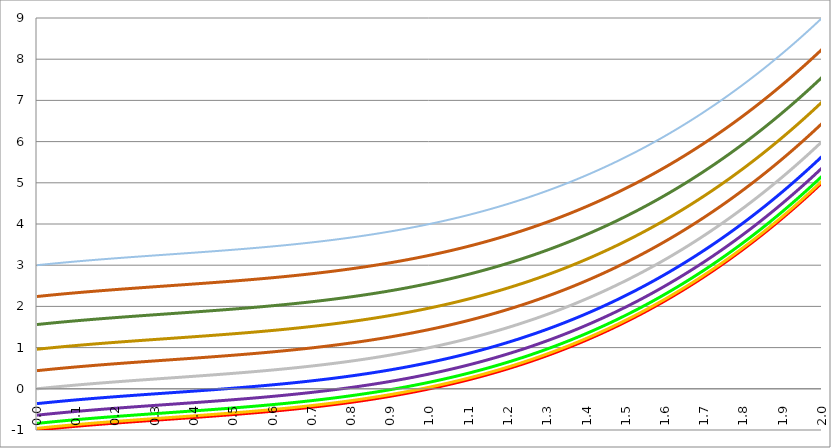
| Category | Series 1 | Series 0 | Series 3 | Series 4 | Series 5 | Series 2 | Series 6 | Series 7 | Series 8 | Series 9 | Series 10 |
|---|---|---|---|---|---|---|---|---|---|---|---|
| 0.0 | -1 | -0.96 | -0.84 | -0.64 | -0.36 | 0 | 0.44 | 0.96 | 1.56 | 2.24 | 3 |
| 0.001 | -0.999 | -0.959 | -0.839 | -0.639 | -0.359 | 0.001 | 0.441 | 0.961 | 1.561 | 2.241 | 3.001 |
| 0.002 | -0.998 | -0.958 | -0.838 | -0.638 | -0.358 | 0.002 | 0.442 | 0.962 | 1.562 | 2.242 | 3.002 |
| 0.003 | -0.997 | -0.957 | -0.837 | -0.637 | -0.357 | 0.003 | 0.443 | 0.963 | 1.563 | 2.243 | 3.003 |
| 0.004 | -0.996 | -0.956 | -0.836 | -0.636 | -0.356 | 0.004 | 0.444 | 0.964 | 1.564 | 2.244 | 3.004 |
| 0.005 | -0.995 | -0.955 | -0.835 | -0.635 | -0.355 | 0.005 | 0.445 | 0.965 | 1.565 | 2.245 | 3.005 |
| 0.006 | -0.994 | -0.954 | -0.834 | -0.634 | -0.354 | 0.006 | 0.446 | 0.966 | 1.566 | 2.246 | 3.006 |
| 0.007 | -0.993 | -0.953 | -0.833 | -0.633 | -0.353 | 0.007 | 0.447 | 0.967 | 1.567 | 2.247 | 3.007 |
| 0.008 | -0.992 | -0.952 | -0.832 | -0.632 | -0.352 | 0.008 | 0.448 | 0.968 | 1.568 | 2.248 | 3.008 |
| 0.009 | -0.991 | -0.951 | -0.831 | -0.631 | -0.351 | 0.009 | 0.449 | 0.969 | 1.569 | 2.249 | 3.009 |
| 0.01 | -0.99 | -0.95 | -0.83 | -0.63 | -0.35 | 0.01 | 0.45 | 0.97 | 1.57 | 2.25 | 3.01 |
| 0.011 | -0.989 | -0.949 | -0.829 | -0.629 | -0.349 | 0.011 | 0.451 | 0.971 | 1.571 | 2.251 | 3.011 |
| 0.012 | -0.988 | -0.948 | -0.828 | -0.628 | -0.348 | 0.012 | 0.452 | 0.972 | 1.572 | 2.252 | 3.012 |
| 0.013 | -0.987 | -0.947 | -0.827 | -0.627 | -0.347 | 0.013 | 0.453 | 0.973 | 1.573 | 2.253 | 3.013 |
| 0.014 | -0.986 | -0.946 | -0.826 | -0.626 | -0.346 | 0.014 | 0.454 | 0.974 | 1.574 | 2.254 | 3.014 |
| 0.015 | -0.985 | -0.945 | -0.825 | -0.625 | -0.345 | 0.015 | 0.455 | 0.975 | 1.575 | 2.255 | 3.015 |
| 0.016 | -0.984 | -0.944 | -0.824 | -0.624 | -0.344 | 0.016 | 0.456 | 0.976 | 1.576 | 2.256 | 3.016 |
| 0.017 | -0.983 | -0.943 | -0.823 | -0.623 | -0.343 | 0.017 | 0.457 | 0.977 | 1.577 | 2.257 | 3.017 |
| 0.018 | -0.982 | -0.942 | -0.822 | -0.622 | -0.342 | 0.018 | 0.458 | 0.978 | 1.578 | 2.258 | 3.018 |
| 0.019 | -0.981 | -0.941 | -0.821 | -0.621 | -0.341 | 0.019 | 0.459 | 0.979 | 1.579 | 2.259 | 3.019 |
| 0.02 | -0.98 | -0.94 | -0.82 | -0.62 | -0.34 | 0.02 | 0.46 | 0.98 | 1.58 | 2.26 | 3.02 |
| 0.021 | -0.979 | -0.939 | -0.819 | -0.619 | -0.339 | 0.021 | 0.461 | 0.981 | 1.581 | 2.261 | 3.021 |
| 0.022 | -0.978 | -0.938 | -0.818 | -0.618 | -0.338 | 0.022 | 0.462 | 0.982 | 1.582 | 2.262 | 3.022 |
| 0.023 | -0.978 | -0.938 | -0.818 | -0.618 | -0.338 | 0.022 | 0.462 | 0.982 | 1.582 | 2.262 | 3.022 |
| 0.024 | -0.977 | -0.937 | -0.817 | -0.617 | -0.337 | 0.023 | 0.463 | 0.983 | 1.583 | 2.263 | 3.023 |
| 0.025 | -0.976 | -0.936 | -0.816 | -0.616 | -0.336 | 0.024 | 0.464 | 0.984 | 1.584 | 2.264 | 3.024 |
| 0.026 | -0.975 | -0.935 | -0.815 | -0.615 | -0.335 | 0.025 | 0.465 | 0.985 | 1.585 | 2.265 | 3.025 |
| 0.027 | -0.974 | -0.934 | -0.814 | -0.614 | -0.334 | 0.026 | 0.466 | 0.986 | 1.586 | 2.266 | 3.026 |
| 0.028 | -0.973 | -0.933 | -0.813 | -0.613 | -0.333 | 0.027 | 0.467 | 0.987 | 1.587 | 2.267 | 3.027 |
| 0.029 | -0.972 | -0.932 | -0.812 | -0.612 | -0.332 | 0.028 | 0.468 | 0.988 | 1.588 | 2.268 | 3.028 |
| 0.03 | -0.971 | -0.931 | -0.811 | -0.611 | -0.331 | 0.029 | 0.469 | 0.989 | 1.589 | 2.269 | 3.029 |
| 0.031 | -0.97 | -0.93 | -0.81 | -0.61 | -0.33 | 0.03 | 0.47 | 0.99 | 1.59 | 2.27 | 3.03 |
| 0.032 | -0.969 | -0.929 | -0.809 | -0.609 | -0.329 | 0.031 | 0.471 | 0.991 | 1.591 | 2.271 | 3.031 |
| 0.033 | -0.968 | -0.928 | -0.808 | -0.608 | -0.328 | 0.032 | 0.472 | 0.992 | 1.592 | 2.272 | 3.032 |
| 0.034 | -0.967 | -0.927 | -0.807 | -0.607 | -0.327 | 0.033 | 0.473 | 0.993 | 1.593 | 2.273 | 3.033 |
| 0.035 | -0.966 | -0.926 | -0.806 | -0.606 | -0.326 | 0.034 | 0.474 | 0.994 | 1.594 | 2.274 | 3.034 |
| 0.036 | -0.965 | -0.925 | -0.805 | -0.605 | -0.325 | 0.035 | 0.475 | 0.995 | 1.595 | 2.275 | 3.035 |
| 0.037 | -0.964 | -0.924 | -0.804 | -0.604 | -0.324 | 0.036 | 0.476 | 0.996 | 1.596 | 2.276 | 3.036 |
| 0.038 | -0.963 | -0.923 | -0.803 | -0.603 | -0.323 | 0.037 | 0.477 | 0.997 | 1.597 | 2.277 | 3.037 |
| 0.039 | -0.962 | -0.922 | -0.802 | -0.602 | -0.322 | 0.038 | 0.478 | 0.998 | 1.598 | 2.278 | 3.038 |
| 0.04 | -0.962 | -0.922 | -0.802 | -0.602 | -0.322 | 0.038 | 0.478 | 0.998 | 1.598 | 2.278 | 3.038 |
| 0.041 | -0.961 | -0.921 | -0.801 | -0.601 | -0.321 | 0.039 | 0.479 | 0.999 | 1.599 | 2.279 | 3.039 |
| 0.042 | -0.96 | -0.92 | -0.8 | -0.6 | -0.32 | 0.04 | 0.48 | 1 | 1.6 | 2.28 | 3.04 |
| 0.043 | -0.959 | -0.919 | -0.799 | -0.599 | -0.319 | 0.041 | 0.481 | 1.001 | 1.601 | 2.281 | 3.041 |
| 0.044 | -0.958 | -0.918 | -0.798 | -0.598 | -0.318 | 0.042 | 0.482 | 1.002 | 1.602 | 2.282 | 3.042 |
| 0.045 | -0.957 | -0.917 | -0.797 | -0.597 | -0.317 | 0.043 | 0.483 | 1.003 | 1.603 | 2.283 | 3.043 |
| 0.046 | -0.956 | -0.916 | -0.796 | -0.596 | -0.316 | 0.044 | 0.484 | 1.004 | 1.604 | 2.284 | 3.044 |
| 0.047 | -0.955 | -0.915 | -0.795 | -0.595 | -0.315 | 0.045 | 0.485 | 1.005 | 1.605 | 2.285 | 3.045 |
| 0.048 | -0.954 | -0.914 | -0.794 | -0.594 | -0.314 | 0.046 | 0.486 | 1.006 | 1.606 | 2.286 | 3.046 |
| 0.049 | -0.953 | -0.913 | -0.793 | -0.593 | -0.313 | 0.047 | 0.487 | 1.007 | 1.607 | 2.287 | 3.047 |
| 0.05 | -0.952 | -0.912 | -0.792 | -0.592 | -0.312 | 0.048 | 0.488 | 1.008 | 1.608 | 2.288 | 3.048 |
| 0.051 | -0.951 | -0.911 | -0.791 | -0.591 | -0.311 | 0.049 | 0.489 | 1.009 | 1.609 | 2.289 | 3.049 |
| 0.052 | -0.951 | -0.911 | -0.791 | -0.591 | -0.311 | 0.049 | 0.489 | 1.009 | 1.609 | 2.289 | 3.049 |
| 0.053 | -0.95 | -0.91 | -0.79 | -0.59 | -0.31 | 0.05 | 0.49 | 1.01 | 1.61 | 2.29 | 3.05 |
| 0.054 | -0.949 | -0.909 | -0.789 | -0.589 | -0.309 | 0.051 | 0.491 | 1.011 | 1.611 | 2.291 | 3.051 |
| 0.055 | -0.948 | -0.908 | -0.788 | -0.588 | -0.308 | 0.052 | 0.492 | 1.012 | 1.612 | 2.292 | 3.052 |
| 0.056 | -0.947 | -0.907 | -0.787 | -0.587 | -0.307 | 0.053 | 0.493 | 1.013 | 1.613 | 2.293 | 3.053 |
| 0.057 | -0.946 | -0.906 | -0.786 | -0.586 | -0.306 | 0.054 | 0.494 | 1.014 | 1.614 | 2.294 | 3.054 |
| 0.058 | -0.945 | -0.905 | -0.785 | -0.585 | -0.305 | 0.055 | 0.495 | 1.015 | 1.615 | 2.295 | 3.055 |
| 0.059 | -0.944 | -0.904 | -0.784 | -0.584 | -0.304 | 0.056 | 0.496 | 1.016 | 1.616 | 2.296 | 3.056 |
| 0.06 | -0.943 | -0.903 | -0.783 | -0.583 | -0.303 | 0.057 | 0.497 | 1.017 | 1.617 | 2.297 | 3.057 |
| 0.061 | -0.942 | -0.902 | -0.782 | -0.582 | -0.302 | 0.058 | 0.498 | 1.018 | 1.618 | 2.298 | 3.058 |
| 0.062 | -0.942 | -0.902 | -0.782 | -0.582 | -0.302 | 0.058 | 0.498 | 1.018 | 1.618 | 2.298 | 3.058 |
| 0.063 | -0.941 | -0.901 | -0.781 | -0.581 | -0.301 | 0.059 | 0.499 | 1.019 | 1.619 | 2.299 | 3.059 |
| 0.064 | -0.94 | -0.9 | -0.78 | -0.58 | -0.3 | 0.06 | 0.5 | 1.02 | 1.62 | 2.3 | 3.06 |
| 0.065 | -0.939 | -0.899 | -0.779 | -0.579 | -0.299 | 0.061 | 0.501 | 1.021 | 1.621 | 2.301 | 3.061 |
| 0.066 | -0.938 | -0.898 | -0.778 | -0.578 | -0.298 | 0.062 | 0.502 | 1.022 | 1.622 | 2.302 | 3.062 |
| 0.067 | -0.937 | -0.897 | -0.777 | -0.577 | -0.297 | 0.063 | 0.503 | 1.023 | 1.623 | 2.303 | 3.063 |
| 0.068 | -0.936 | -0.896 | -0.776 | -0.576 | -0.296 | 0.064 | 0.504 | 1.024 | 1.624 | 2.304 | 3.064 |
| 0.069 | -0.935 | -0.895 | -0.775 | -0.575 | -0.295 | 0.065 | 0.505 | 1.025 | 1.625 | 2.305 | 3.065 |
| 0.07 | -0.935 | -0.895 | -0.775 | -0.575 | -0.295 | 0.065 | 0.505 | 1.025 | 1.625 | 2.305 | 3.065 |
| 0.071 | -0.934 | -0.894 | -0.774 | -0.574 | -0.294 | 0.066 | 0.506 | 1.026 | 1.626 | 2.306 | 3.066 |
| 0.072 | -0.933 | -0.893 | -0.773 | -0.573 | -0.293 | 0.067 | 0.507 | 1.027 | 1.627 | 2.307 | 3.067 |
| 0.073 | -0.932 | -0.892 | -0.772 | -0.572 | -0.292 | 0.068 | 0.508 | 1.028 | 1.628 | 2.308 | 3.068 |
| 0.074 | -0.931 | -0.891 | -0.771 | -0.571 | -0.291 | 0.069 | 0.509 | 1.029 | 1.629 | 2.309 | 3.069 |
| 0.075 | -0.93 | -0.89 | -0.77 | -0.57 | -0.29 | 0.07 | 0.51 | 1.03 | 1.63 | 2.31 | 3.07 |
| 0.076 | -0.929 | -0.889 | -0.769 | -0.569 | -0.289 | 0.071 | 0.511 | 1.031 | 1.631 | 2.311 | 3.071 |
| 0.077 | -0.928 | -0.888 | -0.768 | -0.568 | -0.288 | 0.072 | 0.512 | 1.032 | 1.632 | 2.312 | 3.072 |
| 0.078 | -0.928 | -0.888 | -0.768 | -0.568 | -0.288 | 0.072 | 0.512 | 1.032 | 1.632 | 2.312 | 3.072 |
| 0.079 | -0.927 | -0.887 | -0.767 | -0.567 | -0.287 | 0.073 | 0.513 | 1.033 | 1.633 | 2.313 | 3.073 |
| 0.08 | -0.926 | -0.886 | -0.766 | -0.566 | -0.286 | 0.074 | 0.514 | 1.034 | 1.634 | 2.314 | 3.074 |
| 0.081 | -0.925 | -0.885 | -0.765 | -0.565 | -0.285 | 0.075 | 0.515 | 1.035 | 1.635 | 2.315 | 3.075 |
| 0.082 | -0.924 | -0.884 | -0.764 | -0.564 | -0.284 | 0.076 | 0.516 | 1.036 | 1.636 | 2.316 | 3.076 |
| 0.083 | -0.923 | -0.883 | -0.763 | -0.563 | -0.283 | 0.077 | 0.517 | 1.037 | 1.637 | 2.317 | 3.077 |
| 0.084 | -0.922 | -0.882 | -0.762 | -0.562 | -0.282 | 0.078 | 0.518 | 1.038 | 1.638 | 2.318 | 3.078 |
| 0.085 | -0.922 | -0.882 | -0.762 | -0.562 | -0.282 | 0.078 | 0.518 | 1.038 | 1.638 | 2.318 | 3.078 |
| 0.086 | -0.921 | -0.881 | -0.761 | -0.561 | -0.281 | 0.079 | 0.519 | 1.039 | 1.639 | 2.319 | 3.079 |
| 0.087 | -0.92 | -0.88 | -0.76 | -0.56 | -0.28 | 0.08 | 0.52 | 1.04 | 1.64 | 2.32 | 3.08 |
| 0.088 | -0.919 | -0.879 | -0.759 | -0.559 | -0.279 | 0.081 | 0.521 | 1.041 | 1.641 | 2.321 | 3.081 |
| 0.089 | -0.918 | -0.878 | -0.758 | -0.558 | -0.278 | 0.082 | 0.522 | 1.042 | 1.642 | 2.322 | 3.082 |
| 0.09 | -0.917 | -0.877 | -0.757 | -0.557 | -0.277 | 0.083 | 0.523 | 1.043 | 1.643 | 2.323 | 3.083 |
| 0.091 | -0.917 | -0.877 | -0.757 | -0.557 | -0.277 | 0.083 | 0.523 | 1.043 | 1.643 | 2.323 | 3.083 |
| 0.092 | -0.916 | -0.876 | -0.756 | -0.556 | -0.276 | 0.084 | 0.524 | 1.044 | 1.644 | 2.324 | 3.084 |
| 0.093 | -0.915 | -0.875 | -0.755 | -0.555 | -0.275 | 0.085 | 0.525 | 1.045 | 1.645 | 2.325 | 3.085 |
| 0.094 | -0.914 | -0.874 | -0.754 | -0.554 | -0.274 | 0.086 | 0.526 | 1.046 | 1.646 | 2.326 | 3.086 |
| 0.095 | -0.913 | -0.873 | -0.753 | -0.553 | -0.273 | 0.087 | 0.527 | 1.047 | 1.647 | 2.327 | 3.087 |
| 0.096 | -0.912 | -0.872 | -0.752 | -0.552 | -0.272 | 0.088 | 0.528 | 1.048 | 1.648 | 2.328 | 3.088 |
| 0.097 | -0.911 | -0.871 | -0.751 | -0.551 | -0.271 | 0.089 | 0.529 | 1.049 | 1.649 | 2.329 | 3.089 |
| 0.098 | -0.911 | -0.871 | -0.751 | -0.551 | -0.271 | 0.089 | 0.529 | 1.049 | 1.649 | 2.329 | 3.089 |
| 0.099 | -0.91 | -0.87 | -0.75 | -0.55 | -0.27 | 0.09 | 0.53 | 1.05 | 1.65 | 2.33 | 3.09 |
| 0.1 | -0.909 | -0.869 | -0.749 | -0.549 | -0.269 | 0.091 | 0.531 | 1.051 | 1.651 | 2.331 | 3.091 |
| 0.101 | -0.908 | -0.868 | -0.748 | -0.548 | -0.268 | 0.092 | 0.532 | 1.052 | 1.652 | 2.332 | 3.092 |
| 0.102 | -0.907 | -0.867 | -0.747 | -0.547 | -0.267 | 0.093 | 0.533 | 1.053 | 1.653 | 2.333 | 3.093 |
| 0.103 | -0.907 | -0.867 | -0.747 | -0.547 | -0.267 | 0.093 | 0.533 | 1.053 | 1.653 | 2.333 | 3.093 |
| 0.104 | -0.906 | -0.866 | -0.746 | -0.546 | -0.266 | 0.094 | 0.534 | 1.054 | 1.654 | 2.334 | 3.094 |
| 0.105 | -0.905 | -0.865 | -0.745 | -0.545 | -0.265 | 0.095 | 0.535 | 1.055 | 1.655 | 2.335 | 3.095 |
| 0.106 | -0.904 | -0.864 | -0.744 | -0.544 | -0.264 | 0.096 | 0.536 | 1.056 | 1.656 | 2.336 | 3.096 |
| 0.107 | -0.903 | -0.863 | -0.743 | -0.543 | -0.263 | 0.097 | 0.537 | 1.057 | 1.657 | 2.337 | 3.097 |
| 0.108 | -0.902 | -0.862 | -0.742 | -0.542 | -0.262 | 0.098 | 0.538 | 1.058 | 1.658 | 2.338 | 3.098 |
| 0.109 | -0.902 | -0.862 | -0.742 | -0.542 | -0.262 | 0.098 | 0.538 | 1.058 | 1.658 | 2.338 | 3.098 |
| 0.11 | -0.901 | -0.861 | -0.741 | -0.541 | -0.261 | 0.099 | 0.539 | 1.059 | 1.659 | 2.339 | 3.099 |
| 0.111 | -0.9 | -0.86 | -0.74 | -0.54 | -0.26 | 0.1 | 0.54 | 1.06 | 1.66 | 2.34 | 3.1 |
| 0.112 | -0.899 | -0.859 | -0.739 | -0.539 | -0.259 | 0.101 | 0.541 | 1.061 | 1.661 | 2.341 | 3.101 |
| 0.113 | -0.898 | -0.858 | -0.738 | -0.538 | -0.258 | 0.102 | 0.542 | 1.062 | 1.662 | 2.342 | 3.102 |
| 0.114 | -0.898 | -0.858 | -0.738 | -0.538 | -0.258 | 0.102 | 0.542 | 1.062 | 1.662 | 2.342 | 3.102 |
| 0.115 | -0.897 | -0.857 | -0.737 | -0.537 | -0.257 | 0.103 | 0.543 | 1.063 | 1.663 | 2.343 | 3.103 |
| 0.116 | -0.896 | -0.856 | -0.736 | -0.536 | -0.256 | 0.104 | 0.544 | 1.064 | 1.664 | 2.344 | 3.104 |
| 0.117 | -0.895 | -0.855 | -0.735 | -0.535 | -0.255 | 0.105 | 0.545 | 1.065 | 1.665 | 2.345 | 3.105 |
| 0.118 | -0.894 | -0.854 | -0.734 | -0.534 | -0.254 | 0.106 | 0.546 | 1.066 | 1.666 | 2.346 | 3.106 |
| 0.119 | -0.893 | -0.853 | -0.733 | -0.533 | -0.253 | 0.107 | 0.547 | 1.067 | 1.667 | 2.347 | 3.107 |
| 0.12 | -0.893 | -0.853 | -0.733 | -0.533 | -0.253 | 0.107 | 0.547 | 1.067 | 1.667 | 2.347 | 3.107 |
| 0.121 | -0.892 | -0.852 | -0.732 | -0.532 | -0.252 | 0.108 | 0.548 | 1.068 | 1.668 | 2.348 | 3.108 |
| 0.122 | -0.891 | -0.851 | -0.731 | -0.531 | -0.251 | 0.109 | 0.549 | 1.069 | 1.669 | 2.349 | 3.109 |
| 0.123 | -0.89 | -0.85 | -0.73 | -0.53 | -0.25 | 0.11 | 0.55 | 1.07 | 1.67 | 2.35 | 3.11 |
| 0.124 | -0.889 | -0.849 | -0.729 | -0.529 | -0.249 | 0.111 | 0.551 | 1.071 | 1.671 | 2.351 | 3.111 |
| 0.125 | -0.889 | -0.849 | -0.729 | -0.529 | -0.249 | 0.111 | 0.551 | 1.071 | 1.671 | 2.351 | 3.111 |
| 0.126 | -0.888 | -0.848 | -0.728 | -0.528 | -0.248 | 0.112 | 0.552 | 1.072 | 1.672 | 2.352 | 3.112 |
| 0.127 | -0.887 | -0.847 | -0.727 | -0.527 | -0.247 | 0.113 | 0.553 | 1.073 | 1.673 | 2.353 | 3.113 |
| 0.128 | -0.886 | -0.846 | -0.726 | -0.526 | -0.246 | 0.114 | 0.554 | 1.074 | 1.674 | 2.354 | 3.114 |
| 0.129 | -0.885 | -0.845 | -0.725 | -0.525 | -0.245 | 0.115 | 0.555 | 1.075 | 1.675 | 2.355 | 3.115 |
| 0.13 | -0.885 | -0.845 | -0.725 | -0.525 | -0.245 | 0.115 | 0.555 | 1.075 | 1.675 | 2.355 | 3.115 |
| 0.131 | -0.884 | -0.844 | -0.724 | -0.524 | -0.244 | 0.116 | 0.556 | 1.076 | 1.676 | 2.356 | 3.116 |
| 0.132 | -0.883 | -0.843 | -0.723 | -0.523 | -0.243 | 0.117 | 0.557 | 1.077 | 1.677 | 2.357 | 3.117 |
| 0.133 | -0.882 | -0.842 | -0.722 | -0.522 | -0.242 | 0.118 | 0.558 | 1.078 | 1.678 | 2.358 | 3.118 |
| 0.134 | -0.882 | -0.842 | -0.722 | -0.522 | -0.242 | 0.118 | 0.558 | 1.078 | 1.678 | 2.358 | 3.118 |
| 0.135 | -0.881 | -0.841 | -0.721 | -0.521 | -0.241 | 0.119 | 0.559 | 1.079 | 1.679 | 2.359 | 3.119 |
| 0.136 | -0.88 | -0.84 | -0.72 | -0.52 | -0.24 | 0.12 | 0.56 | 1.08 | 1.68 | 2.36 | 3.12 |
| 0.137 | -0.879 | -0.839 | -0.719 | -0.519 | -0.239 | 0.121 | 0.561 | 1.081 | 1.681 | 2.361 | 3.121 |
| 0.138 | -0.878 | -0.838 | -0.718 | -0.518 | -0.238 | 0.122 | 0.562 | 1.082 | 1.682 | 2.362 | 3.122 |
| 0.139 | -0.878 | -0.838 | -0.718 | -0.518 | -0.238 | 0.122 | 0.562 | 1.082 | 1.682 | 2.362 | 3.122 |
| 0.14 | -0.877 | -0.837 | -0.717 | -0.517 | -0.237 | 0.123 | 0.563 | 1.083 | 1.683 | 2.363 | 3.123 |
| 0.141 | -0.876 | -0.836 | -0.716 | -0.516 | -0.236 | 0.124 | 0.564 | 1.084 | 1.684 | 2.364 | 3.124 |
| 0.142 | -0.875 | -0.835 | -0.715 | -0.515 | -0.235 | 0.125 | 0.565 | 1.085 | 1.685 | 2.365 | 3.125 |
| 0.143 | -0.875 | -0.835 | -0.715 | -0.515 | -0.235 | 0.125 | 0.565 | 1.085 | 1.685 | 2.365 | 3.125 |
| 0.144 | -0.874 | -0.834 | -0.714 | -0.514 | -0.234 | 0.126 | 0.566 | 1.086 | 1.686 | 2.366 | 3.126 |
| 0.145 | -0.873 | -0.833 | -0.713 | -0.513 | -0.233 | 0.127 | 0.567 | 1.087 | 1.687 | 2.367 | 3.127 |
| 0.146 | -0.872 | -0.832 | -0.712 | -0.512 | -0.232 | 0.128 | 0.568 | 1.088 | 1.688 | 2.368 | 3.128 |
| 0.147 | -0.871 | -0.831 | -0.711 | -0.511 | -0.231 | 0.129 | 0.569 | 1.089 | 1.689 | 2.369 | 3.129 |
| 0.148 | -0.871 | -0.831 | -0.711 | -0.511 | -0.231 | 0.129 | 0.569 | 1.089 | 1.689 | 2.369 | 3.129 |
| 0.149 | -0.87 | -0.83 | -0.71 | -0.51 | -0.23 | 0.13 | 0.57 | 1.09 | 1.69 | 2.37 | 3.13 |
| 0.15 | -0.869 | -0.829 | -0.709 | -0.509 | -0.229 | 0.131 | 0.571 | 1.091 | 1.691 | 2.371 | 3.131 |
| 0.151 | -0.868 | -0.828 | -0.708 | -0.508 | -0.228 | 0.132 | 0.572 | 1.092 | 1.692 | 2.372 | 3.132 |
| 0.152 | -0.868 | -0.828 | -0.708 | -0.508 | -0.228 | 0.132 | 0.572 | 1.092 | 1.692 | 2.372 | 3.132 |
| 0.153 | -0.867 | -0.827 | -0.707 | -0.507 | -0.227 | 0.133 | 0.573 | 1.093 | 1.693 | 2.373 | 3.133 |
| 0.154 | -0.866 | -0.826 | -0.706 | -0.506 | -0.226 | 0.134 | 0.574 | 1.094 | 1.694 | 2.374 | 3.134 |
| 0.155 | -0.865 | -0.825 | -0.705 | -0.505 | -0.225 | 0.135 | 0.575 | 1.095 | 1.695 | 2.375 | 3.135 |
| 0.156 | -0.865 | -0.825 | -0.705 | -0.505 | -0.225 | 0.135 | 0.575 | 1.095 | 1.695 | 2.375 | 3.135 |
| 0.157 | -0.864 | -0.824 | -0.704 | -0.504 | -0.224 | 0.136 | 0.576 | 1.096 | 1.696 | 2.376 | 3.136 |
| 0.158 | -0.863 | -0.823 | -0.703 | -0.503 | -0.223 | 0.137 | 0.577 | 1.097 | 1.697 | 2.377 | 3.137 |
| 0.159 | -0.862 | -0.822 | -0.702 | -0.502 | -0.222 | 0.138 | 0.578 | 1.098 | 1.698 | 2.378 | 3.138 |
| 0.16 | -0.862 | -0.822 | -0.702 | -0.502 | -0.222 | 0.138 | 0.578 | 1.098 | 1.698 | 2.378 | 3.138 |
| 0.161 | -0.861 | -0.821 | -0.701 | -0.501 | -0.221 | 0.139 | 0.579 | 1.099 | 1.699 | 2.379 | 3.139 |
| 0.162 | -0.86 | -0.82 | -0.7 | -0.5 | -0.22 | 0.14 | 0.58 | 1.1 | 1.7 | 2.38 | 3.14 |
| 0.163 | -0.859 | -0.819 | -0.699 | -0.499 | -0.219 | 0.141 | 0.581 | 1.101 | 1.701 | 2.381 | 3.141 |
| 0.164 | -0.858 | -0.818 | -0.698 | -0.498 | -0.218 | 0.142 | 0.582 | 1.102 | 1.702 | 2.382 | 3.142 |
| 0.165 | -0.858 | -0.818 | -0.698 | -0.498 | -0.218 | 0.142 | 0.582 | 1.102 | 1.702 | 2.382 | 3.142 |
| 0.166 | -0.857 | -0.817 | -0.697 | -0.497 | -0.217 | 0.143 | 0.583 | 1.103 | 1.703 | 2.383 | 3.143 |
| 0.167 | -0.856 | -0.816 | -0.696 | -0.496 | -0.216 | 0.144 | 0.584 | 1.104 | 1.704 | 2.384 | 3.144 |
| 0.168 | -0.855 | -0.815 | -0.695 | -0.495 | -0.215 | 0.145 | 0.585 | 1.105 | 1.705 | 2.385 | 3.145 |
| 0.169 | -0.855 | -0.815 | -0.695 | -0.495 | -0.215 | 0.145 | 0.585 | 1.105 | 1.705 | 2.385 | 3.145 |
| 0.17 | -0.854 | -0.814 | -0.694 | -0.494 | -0.214 | 0.146 | 0.586 | 1.106 | 1.706 | 2.386 | 3.146 |
| 0.171 | -0.853 | -0.813 | -0.693 | -0.493 | -0.213 | 0.147 | 0.587 | 1.107 | 1.707 | 2.387 | 3.147 |
| 0.172 | -0.852 | -0.812 | -0.692 | -0.492 | -0.212 | 0.148 | 0.588 | 1.108 | 1.708 | 2.388 | 3.148 |
| 0.173 | -0.852 | -0.812 | -0.692 | -0.492 | -0.212 | 0.148 | 0.588 | 1.108 | 1.708 | 2.388 | 3.148 |
| 0.174 | -0.851 | -0.811 | -0.691 | -0.491 | -0.211 | 0.149 | 0.589 | 1.109 | 1.709 | 2.389 | 3.149 |
| 0.175 | -0.85 | -0.81 | -0.69 | -0.49 | -0.21 | 0.15 | 0.59 | 1.11 | 1.71 | 2.39 | 3.15 |
| 0.176 | -0.85 | -0.81 | -0.69 | -0.49 | -0.21 | 0.15 | 0.59 | 1.11 | 1.71 | 2.39 | 3.15 |
| 0.177 | -0.849 | -0.809 | -0.689 | -0.489 | -0.209 | 0.151 | 0.591 | 1.111 | 1.711 | 2.391 | 3.151 |
| 0.178 | -0.848 | -0.808 | -0.688 | -0.488 | -0.208 | 0.152 | 0.592 | 1.112 | 1.712 | 2.392 | 3.152 |
| 0.179 | -0.847 | -0.807 | -0.687 | -0.487 | -0.207 | 0.153 | 0.593 | 1.113 | 1.713 | 2.393 | 3.153 |
| 0.18 | -0.847 | -0.807 | -0.687 | -0.487 | -0.207 | 0.153 | 0.593 | 1.113 | 1.713 | 2.393 | 3.153 |
| 0.181 | -0.846 | -0.806 | -0.686 | -0.486 | -0.206 | 0.154 | 0.594 | 1.114 | 1.714 | 2.394 | 3.154 |
| 0.182 | -0.845 | -0.805 | -0.685 | -0.485 | -0.205 | 0.155 | 0.595 | 1.115 | 1.715 | 2.395 | 3.155 |
| 0.183 | -0.844 | -0.804 | -0.684 | -0.484 | -0.204 | 0.156 | 0.596 | 1.116 | 1.716 | 2.396 | 3.156 |
| 0.184 | -0.844 | -0.804 | -0.684 | -0.484 | -0.204 | 0.156 | 0.596 | 1.116 | 1.716 | 2.396 | 3.156 |
| 0.185 | -0.843 | -0.803 | -0.683 | -0.483 | -0.203 | 0.157 | 0.597 | 1.117 | 1.717 | 2.397 | 3.157 |
| 0.186 | -0.842 | -0.802 | -0.682 | -0.482 | -0.202 | 0.158 | 0.598 | 1.118 | 1.718 | 2.398 | 3.158 |
| 0.187 | -0.841 | -0.801 | -0.681 | -0.481 | -0.201 | 0.159 | 0.599 | 1.119 | 1.719 | 2.399 | 3.159 |
| 0.188 | -0.841 | -0.801 | -0.681 | -0.481 | -0.201 | 0.159 | 0.599 | 1.119 | 1.719 | 2.399 | 3.159 |
| 0.189 | -0.84 | -0.8 | -0.68 | -0.48 | -0.2 | 0.16 | 0.6 | 1.12 | 1.72 | 2.4 | 3.16 |
| 0.19 | -0.839 | -0.799 | -0.679 | -0.479 | -0.199 | 0.161 | 0.601 | 1.121 | 1.721 | 2.401 | 3.161 |
| 0.191 | -0.839 | -0.799 | -0.679 | -0.479 | -0.199 | 0.161 | 0.601 | 1.121 | 1.721 | 2.401 | 3.161 |
| 0.192 | -0.838 | -0.798 | -0.678 | -0.478 | -0.198 | 0.162 | 0.602 | 1.122 | 1.722 | 2.402 | 3.162 |
| 0.193 | -0.837 | -0.797 | -0.677 | -0.477 | -0.197 | 0.163 | 0.603 | 1.123 | 1.723 | 2.403 | 3.163 |
| 0.194 | -0.836 | -0.796 | -0.676 | -0.476 | -0.196 | 0.164 | 0.604 | 1.124 | 1.724 | 2.404 | 3.164 |
| 0.195 | -0.836 | -0.796 | -0.676 | -0.476 | -0.196 | 0.164 | 0.604 | 1.124 | 1.724 | 2.404 | 3.164 |
| 0.196 | -0.835 | -0.795 | -0.675 | -0.475 | -0.195 | 0.165 | 0.605 | 1.125 | 1.725 | 2.405 | 3.165 |
| 0.197 | -0.834 | -0.794 | -0.674 | -0.474 | -0.194 | 0.166 | 0.606 | 1.126 | 1.726 | 2.406 | 3.166 |
| 0.198 | -0.833 | -0.793 | -0.673 | -0.473 | -0.193 | 0.167 | 0.607 | 1.127 | 1.727 | 2.407 | 3.167 |
| 0.199 | -0.833 | -0.793 | -0.673 | -0.473 | -0.193 | 0.167 | 0.607 | 1.127 | 1.727 | 2.407 | 3.167 |
| 0.2 | -0.832 | -0.792 | -0.672 | -0.472 | -0.192 | 0.168 | 0.608 | 1.128 | 1.728 | 2.408 | 3.168 |
| 0.201 | -0.831 | -0.791 | -0.671 | -0.471 | -0.191 | 0.169 | 0.609 | 1.129 | 1.729 | 2.409 | 3.169 |
| 0.202 | -0.831 | -0.791 | -0.671 | -0.471 | -0.191 | 0.169 | 0.609 | 1.129 | 1.729 | 2.409 | 3.169 |
| 0.203 | -0.83 | -0.79 | -0.67 | -0.47 | -0.19 | 0.17 | 0.61 | 1.13 | 1.73 | 2.41 | 3.17 |
| 0.204 | -0.829 | -0.789 | -0.669 | -0.469 | -0.189 | 0.171 | 0.611 | 1.131 | 1.731 | 2.411 | 3.171 |
| 0.205 | -0.828 | -0.788 | -0.668 | -0.468 | -0.188 | 0.172 | 0.612 | 1.132 | 1.732 | 2.412 | 3.172 |
| 0.206 | -0.828 | -0.788 | -0.668 | -0.468 | -0.188 | 0.172 | 0.612 | 1.132 | 1.732 | 2.412 | 3.172 |
| 0.207 | -0.827 | -0.787 | -0.667 | -0.467 | -0.187 | 0.173 | 0.613 | 1.133 | 1.733 | 2.413 | 3.173 |
| 0.208 | -0.826 | -0.786 | -0.666 | -0.466 | -0.186 | 0.174 | 0.614 | 1.134 | 1.734 | 2.414 | 3.174 |
| 0.209 | -0.826 | -0.786 | -0.666 | -0.466 | -0.186 | 0.174 | 0.614 | 1.134 | 1.734 | 2.414 | 3.174 |
| 0.21 | -0.825 | -0.785 | -0.665 | -0.465 | -0.185 | 0.175 | 0.615 | 1.135 | 1.735 | 2.415 | 3.175 |
| 0.211 | -0.824 | -0.784 | -0.664 | -0.464 | -0.184 | 0.176 | 0.616 | 1.136 | 1.736 | 2.416 | 3.176 |
| 0.212 | -0.823 | -0.783 | -0.663 | -0.463 | -0.183 | 0.177 | 0.617 | 1.137 | 1.737 | 2.417 | 3.177 |
| 0.213 | -0.823 | -0.783 | -0.663 | -0.463 | -0.183 | 0.177 | 0.617 | 1.137 | 1.737 | 2.417 | 3.177 |
| 0.214 | -0.822 | -0.782 | -0.662 | -0.462 | -0.182 | 0.178 | 0.618 | 1.138 | 1.738 | 2.418 | 3.178 |
| 0.215 | -0.821 | -0.781 | -0.661 | -0.461 | -0.181 | 0.179 | 0.619 | 1.139 | 1.739 | 2.419 | 3.179 |
| 0.216 | -0.821 | -0.781 | -0.661 | -0.461 | -0.181 | 0.179 | 0.619 | 1.139 | 1.739 | 2.419 | 3.179 |
| 0.217 | -0.82 | -0.78 | -0.66 | -0.46 | -0.18 | 0.18 | 0.62 | 1.14 | 1.74 | 2.42 | 3.18 |
| 0.218 | -0.819 | -0.779 | -0.659 | -0.459 | -0.179 | 0.181 | 0.621 | 1.141 | 1.741 | 2.421 | 3.181 |
| 0.219 | -0.818 | -0.778 | -0.658 | -0.458 | -0.178 | 0.182 | 0.622 | 1.142 | 1.742 | 2.422 | 3.182 |
| 0.22 | -0.818 | -0.778 | -0.658 | -0.458 | -0.178 | 0.182 | 0.622 | 1.142 | 1.742 | 2.422 | 3.182 |
| 0.221 | -0.817 | -0.777 | -0.657 | -0.457 | -0.177 | 0.183 | 0.623 | 1.143 | 1.743 | 2.423 | 3.183 |
| 0.222 | -0.816 | -0.776 | -0.656 | -0.456 | -0.176 | 0.184 | 0.624 | 1.144 | 1.744 | 2.424 | 3.184 |
| 0.223 | -0.816 | -0.776 | -0.656 | -0.456 | -0.176 | 0.184 | 0.624 | 1.144 | 1.744 | 2.424 | 3.184 |
| 0.224 | -0.815 | -0.775 | -0.655 | -0.455 | -0.175 | 0.185 | 0.625 | 1.145 | 1.745 | 2.425 | 3.185 |
| 0.225 | -0.814 | -0.774 | -0.654 | -0.454 | -0.174 | 0.186 | 0.626 | 1.146 | 1.746 | 2.426 | 3.186 |
| 0.226 | -0.814 | -0.774 | -0.654 | -0.454 | -0.174 | 0.186 | 0.626 | 1.146 | 1.746 | 2.426 | 3.186 |
| 0.227 | -0.813 | -0.773 | -0.653 | -0.453 | -0.173 | 0.187 | 0.627 | 1.147 | 1.747 | 2.427 | 3.187 |
| 0.228 | -0.812 | -0.772 | -0.652 | -0.452 | -0.172 | 0.188 | 0.628 | 1.148 | 1.748 | 2.428 | 3.188 |
| 0.229 | -0.811 | -0.771 | -0.651 | -0.451 | -0.171 | 0.189 | 0.629 | 1.149 | 1.749 | 2.429 | 3.189 |
| 0.23 | -0.811 | -0.771 | -0.651 | -0.451 | -0.171 | 0.189 | 0.629 | 1.149 | 1.749 | 2.429 | 3.189 |
| 0.231 | -0.81 | -0.77 | -0.65 | -0.45 | -0.17 | 0.19 | 0.63 | 1.15 | 1.75 | 2.43 | 3.19 |
| 0.232 | -0.809 | -0.769 | -0.649 | -0.449 | -0.169 | 0.191 | 0.631 | 1.151 | 1.751 | 2.431 | 3.191 |
| 0.233 | -0.809 | -0.769 | -0.649 | -0.449 | -0.169 | 0.191 | 0.631 | 1.151 | 1.751 | 2.431 | 3.191 |
| 0.234 | -0.808 | -0.768 | -0.648 | -0.448 | -0.168 | 0.192 | 0.632 | 1.152 | 1.752 | 2.432 | 3.192 |
| 0.235 | -0.807 | -0.767 | -0.647 | -0.447 | -0.167 | 0.193 | 0.633 | 1.153 | 1.753 | 2.433 | 3.193 |
| 0.236 | -0.807 | -0.767 | -0.647 | -0.447 | -0.167 | 0.193 | 0.633 | 1.153 | 1.753 | 2.433 | 3.193 |
| 0.237 | -0.806 | -0.766 | -0.646 | -0.446 | -0.166 | 0.194 | 0.634 | 1.154 | 1.754 | 2.434 | 3.194 |
| 0.238 | -0.805 | -0.765 | -0.645 | -0.445 | -0.165 | 0.195 | 0.635 | 1.155 | 1.755 | 2.435 | 3.195 |
| 0.239 | -0.804 | -0.764 | -0.644 | -0.444 | -0.164 | 0.196 | 0.636 | 1.156 | 1.756 | 2.436 | 3.196 |
| 0.24 | -0.804 | -0.764 | -0.644 | -0.444 | -0.164 | 0.196 | 0.636 | 1.156 | 1.756 | 2.436 | 3.196 |
| 0.241 | -0.803 | -0.763 | -0.643 | -0.443 | -0.163 | 0.197 | 0.637 | 1.157 | 1.757 | 2.437 | 3.197 |
| 0.242 | -0.802 | -0.762 | -0.642 | -0.442 | -0.162 | 0.198 | 0.638 | 1.158 | 1.758 | 2.438 | 3.198 |
| 0.243 | -0.802 | -0.762 | -0.642 | -0.442 | -0.162 | 0.198 | 0.638 | 1.158 | 1.758 | 2.438 | 3.198 |
| 0.244 | -0.801 | -0.761 | -0.641 | -0.441 | -0.161 | 0.199 | 0.639 | 1.159 | 1.759 | 2.439 | 3.199 |
| 0.245 | -0.8 | -0.76 | -0.64 | -0.44 | -0.16 | 0.2 | 0.64 | 1.16 | 1.76 | 2.44 | 3.2 |
| 0.246 | -0.8 | -0.76 | -0.64 | -0.44 | -0.16 | 0.2 | 0.64 | 1.16 | 1.76 | 2.44 | 3.2 |
| 0.247 | -0.799 | -0.759 | -0.639 | -0.439 | -0.159 | 0.201 | 0.641 | 1.161 | 1.761 | 2.441 | 3.201 |
| 0.248 | -0.798 | -0.758 | -0.638 | -0.438 | -0.158 | 0.202 | 0.642 | 1.162 | 1.762 | 2.442 | 3.202 |
| 0.249 | -0.798 | -0.758 | -0.638 | -0.438 | -0.158 | 0.202 | 0.642 | 1.162 | 1.762 | 2.442 | 3.202 |
| 0.25 | -0.797 | -0.757 | -0.637 | -0.437 | -0.157 | 0.203 | 0.643 | 1.163 | 1.763 | 2.443 | 3.203 |
| 0.251 | -0.796 | -0.756 | -0.636 | -0.436 | -0.156 | 0.204 | 0.644 | 1.164 | 1.764 | 2.444 | 3.204 |
| 0.252 | -0.796 | -0.756 | -0.636 | -0.436 | -0.156 | 0.204 | 0.644 | 1.164 | 1.764 | 2.444 | 3.204 |
| 0.253 | -0.795 | -0.755 | -0.635 | -0.435 | -0.155 | 0.205 | 0.645 | 1.165 | 1.765 | 2.445 | 3.205 |
| 0.254 | -0.794 | -0.754 | -0.634 | -0.434 | -0.154 | 0.206 | 0.646 | 1.166 | 1.766 | 2.446 | 3.206 |
| 0.255 | -0.793 | -0.753 | -0.633 | -0.433 | -0.153 | 0.207 | 0.647 | 1.167 | 1.767 | 2.447 | 3.207 |
| 0.256 | -0.793 | -0.753 | -0.633 | -0.433 | -0.153 | 0.207 | 0.647 | 1.167 | 1.767 | 2.447 | 3.207 |
| 0.257 | -0.792 | -0.752 | -0.632 | -0.432 | -0.152 | 0.208 | 0.648 | 1.168 | 1.768 | 2.448 | 3.208 |
| 0.258 | -0.791 | -0.751 | -0.631 | -0.431 | -0.151 | 0.209 | 0.649 | 1.169 | 1.769 | 2.449 | 3.209 |
| 0.259 | -0.791 | -0.751 | -0.631 | -0.431 | -0.151 | 0.209 | 0.649 | 1.169 | 1.769 | 2.449 | 3.209 |
| 0.26 | -0.79 | -0.75 | -0.63 | -0.43 | -0.15 | 0.21 | 0.65 | 1.17 | 1.77 | 2.45 | 3.21 |
| 0.261 | -0.789 | -0.749 | -0.629 | -0.429 | -0.149 | 0.211 | 0.651 | 1.171 | 1.771 | 2.451 | 3.211 |
| 0.262 | -0.789 | -0.749 | -0.629 | -0.429 | -0.149 | 0.211 | 0.651 | 1.171 | 1.771 | 2.451 | 3.211 |
| 0.263 | -0.788 | -0.748 | -0.628 | -0.428 | -0.148 | 0.212 | 0.652 | 1.172 | 1.772 | 2.452 | 3.212 |
| 0.264 | -0.787 | -0.747 | -0.627 | -0.427 | -0.147 | 0.213 | 0.653 | 1.173 | 1.773 | 2.453 | 3.213 |
| 0.265 | -0.787 | -0.747 | -0.627 | -0.427 | -0.147 | 0.213 | 0.653 | 1.173 | 1.773 | 2.453 | 3.213 |
| 0.266 | -0.786 | -0.746 | -0.626 | -0.426 | -0.146 | 0.214 | 0.654 | 1.174 | 1.774 | 2.454 | 3.214 |
| 0.267 | -0.785 | -0.745 | -0.625 | -0.425 | -0.145 | 0.215 | 0.655 | 1.175 | 1.775 | 2.455 | 3.215 |
| 0.268 | -0.785 | -0.745 | -0.625 | -0.425 | -0.145 | 0.215 | 0.655 | 1.175 | 1.775 | 2.455 | 3.215 |
| 0.269 | -0.784 | -0.744 | -0.624 | -0.424 | -0.144 | 0.216 | 0.656 | 1.176 | 1.776 | 2.456 | 3.216 |
| 0.27 | -0.783 | -0.743 | -0.623 | -0.423 | -0.143 | 0.217 | 0.657 | 1.177 | 1.777 | 2.457 | 3.217 |
| 0.271 | -0.783 | -0.743 | -0.623 | -0.423 | -0.143 | 0.217 | 0.657 | 1.177 | 1.777 | 2.457 | 3.217 |
| 0.272 | -0.782 | -0.742 | -0.622 | -0.422 | -0.142 | 0.218 | 0.658 | 1.178 | 1.778 | 2.458 | 3.218 |
| 0.273 | -0.781 | -0.741 | -0.621 | -0.421 | -0.141 | 0.219 | 0.659 | 1.179 | 1.779 | 2.459 | 3.219 |
| 0.274 | -0.781 | -0.741 | -0.621 | -0.421 | -0.141 | 0.219 | 0.659 | 1.179 | 1.779 | 2.459 | 3.219 |
| 0.275 | -0.78 | -0.74 | -0.62 | -0.42 | -0.14 | 0.22 | 0.66 | 1.18 | 1.78 | 2.46 | 3.22 |
| 0.276 | -0.779 | -0.739 | -0.619 | -0.419 | -0.139 | 0.221 | 0.661 | 1.181 | 1.781 | 2.461 | 3.221 |
| 0.277 | -0.778 | -0.738 | -0.618 | -0.418 | -0.138 | 0.222 | 0.662 | 1.182 | 1.782 | 2.462 | 3.222 |
| 0.278 | -0.778 | -0.738 | -0.618 | -0.418 | -0.138 | 0.222 | 0.662 | 1.182 | 1.782 | 2.462 | 3.222 |
| 0.279 | -0.777 | -0.737 | -0.617 | -0.417 | -0.137 | 0.223 | 0.663 | 1.183 | 1.783 | 2.463 | 3.223 |
| 0.28 | -0.776 | -0.736 | -0.616 | -0.416 | -0.136 | 0.224 | 0.664 | 1.184 | 1.784 | 2.464 | 3.224 |
| 0.281 | -0.776 | -0.736 | -0.616 | -0.416 | -0.136 | 0.224 | 0.664 | 1.184 | 1.784 | 2.464 | 3.224 |
| 0.282 | -0.775 | -0.735 | -0.615 | -0.415 | -0.135 | 0.225 | 0.665 | 1.185 | 1.785 | 2.465 | 3.225 |
| 0.283 | -0.774 | -0.734 | -0.614 | -0.414 | -0.134 | 0.226 | 0.666 | 1.186 | 1.786 | 2.466 | 3.226 |
| 0.284 | -0.774 | -0.734 | -0.614 | -0.414 | -0.134 | 0.226 | 0.666 | 1.186 | 1.786 | 2.466 | 3.226 |
| 0.285 | -0.773 | -0.733 | -0.613 | -0.413 | -0.133 | 0.227 | 0.667 | 1.187 | 1.787 | 2.467 | 3.227 |
| 0.286 | -0.772 | -0.732 | -0.612 | -0.412 | -0.132 | 0.228 | 0.668 | 1.188 | 1.788 | 2.468 | 3.228 |
| 0.287 | -0.772 | -0.732 | -0.612 | -0.412 | -0.132 | 0.228 | 0.668 | 1.188 | 1.788 | 2.468 | 3.228 |
| 0.288 | -0.771 | -0.731 | -0.611 | -0.411 | -0.131 | 0.229 | 0.669 | 1.189 | 1.789 | 2.469 | 3.229 |
| 0.289 | -0.77 | -0.73 | -0.61 | -0.41 | -0.13 | 0.23 | 0.67 | 1.19 | 1.79 | 2.47 | 3.23 |
| 0.29 | -0.77 | -0.73 | -0.61 | -0.41 | -0.13 | 0.23 | 0.67 | 1.19 | 1.79 | 2.47 | 3.23 |
| 0.291 | -0.769 | -0.729 | -0.609 | -0.409 | -0.129 | 0.231 | 0.671 | 1.191 | 1.791 | 2.471 | 3.231 |
| 0.292 | -0.768 | -0.728 | -0.608 | -0.408 | -0.128 | 0.232 | 0.672 | 1.192 | 1.792 | 2.472 | 3.232 |
| 0.293 | -0.768 | -0.728 | -0.608 | -0.408 | -0.128 | 0.232 | 0.672 | 1.192 | 1.792 | 2.472 | 3.232 |
| 0.294 | -0.767 | -0.727 | -0.607 | -0.407 | -0.127 | 0.233 | 0.673 | 1.193 | 1.793 | 2.473 | 3.233 |
| 0.295 | -0.766 | -0.726 | -0.606 | -0.406 | -0.126 | 0.234 | 0.674 | 1.194 | 1.794 | 2.474 | 3.234 |
| 0.296 | -0.766 | -0.726 | -0.606 | -0.406 | -0.126 | 0.234 | 0.674 | 1.194 | 1.794 | 2.474 | 3.234 |
| 0.297 | -0.765 | -0.725 | -0.605 | -0.405 | -0.125 | 0.235 | 0.675 | 1.195 | 1.795 | 2.475 | 3.235 |
| 0.298 | -0.764 | -0.724 | -0.604 | -0.404 | -0.124 | 0.236 | 0.676 | 1.196 | 1.796 | 2.476 | 3.236 |
| 0.299 | -0.764 | -0.724 | -0.604 | -0.404 | -0.124 | 0.236 | 0.676 | 1.196 | 1.796 | 2.476 | 3.236 |
| 0.3 | -0.763 | -0.723 | -0.603 | -0.403 | -0.123 | 0.237 | 0.677 | 1.197 | 1.797 | 2.477 | 3.237 |
| 0.301 | -0.762 | -0.722 | -0.602 | -0.402 | -0.122 | 0.238 | 0.678 | 1.198 | 1.798 | 2.478 | 3.238 |
| 0.302 | -0.762 | -0.722 | -0.602 | -0.402 | -0.122 | 0.238 | 0.678 | 1.198 | 1.798 | 2.478 | 3.238 |
| 0.303 | -0.761 | -0.721 | -0.601 | -0.401 | -0.121 | 0.239 | 0.679 | 1.199 | 1.799 | 2.479 | 3.239 |
| 0.304 | -0.76 | -0.72 | -0.6 | -0.4 | -0.12 | 0.24 | 0.68 | 1.2 | 1.8 | 2.48 | 3.24 |
| 0.305 | -0.76 | -0.72 | -0.6 | -0.4 | -0.12 | 0.24 | 0.68 | 1.2 | 1.8 | 2.48 | 3.24 |
| 0.306 | -0.759 | -0.719 | -0.599 | -0.399 | -0.119 | 0.241 | 0.681 | 1.201 | 1.801 | 2.481 | 3.241 |
| 0.307 | -0.758 | -0.718 | -0.598 | -0.398 | -0.118 | 0.242 | 0.682 | 1.202 | 1.802 | 2.482 | 3.242 |
| 0.308 | -0.758 | -0.718 | -0.598 | -0.398 | -0.118 | 0.242 | 0.682 | 1.202 | 1.802 | 2.482 | 3.242 |
| 0.309 | -0.757 | -0.717 | -0.597 | -0.397 | -0.117 | 0.243 | 0.683 | 1.203 | 1.803 | 2.483 | 3.243 |
| 0.31 | -0.756 | -0.716 | -0.596 | -0.396 | -0.116 | 0.244 | 0.684 | 1.204 | 1.804 | 2.484 | 3.244 |
| 0.311 | -0.756 | -0.716 | -0.596 | -0.396 | -0.116 | 0.244 | 0.684 | 1.204 | 1.804 | 2.484 | 3.244 |
| 0.312 | -0.755 | -0.715 | -0.595 | -0.395 | -0.115 | 0.245 | 0.685 | 1.205 | 1.805 | 2.485 | 3.245 |
| 0.313 | -0.754 | -0.714 | -0.594 | -0.394 | -0.114 | 0.246 | 0.686 | 1.206 | 1.806 | 2.486 | 3.246 |
| 0.314 | -0.754 | -0.714 | -0.594 | -0.394 | -0.114 | 0.246 | 0.686 | 1.206 | 1.806 | 2.486 | 3.246 |
| 0.315 | -0.753 | -0.713 | -0.593 | -0.393 | -0.113 | 0.247 | 0.687 | 1.207 | 1.807 | 2.487 | 3.247 |
| 0.316 | -0.752 | -0.712 | -0.592 | -0.392 | -0.112 | 0.248 | 0.688 | 1.208 | 1.808 | 2.488 | 3.248 |
| 0.317 | -0.752 | -0.712 | -0.592 | -0.392 | -0.112 | 0.248 | 0.688 | 1.208 | 1.808 | 2.488 | 3.248 |
| 0.318 | -0.751 | -0.711 | -0.591 | -0.391 | -0.111 | 0.249 | 0.689 | 1.209 | 1.809 | 2.489 | 3.249 |
| 0.319 | -0.75 | -0.71 | -0.59 | -0.39 | -0.11 | 0.25 | 0.69 | 1.21 | 1.81 | 2.49 | 3.25 |
| 0.32 | -0.75 | -0.71 | -0.59 | -0.39 | -0.11 | 0.25 | 0.69 | 1.21 | 1.81 | 2.49 | 3.25 |
| 0.321 | -0.749 | -0.709 | -0.589 | -0.389 | -0.109 | 0.251 | 0.691 | 1.211 | 1.811 | 2.491 | 3.251 |
| 0.322 | -0.748 | -0.708 | -0.588 | -0.388 | -0.108 | 0.252 | 0.692 | 1.212 | 1.812 | 2.492 | 3.252 |
| 0.323 | -0.748 | -0.708 | -0.588 | -0.388 | -0.108 | 0.252 | 0.692 | 1.212 | 1.812 | 2.492 | 3.252 |
| 0.324 | -0.747 | -0.707 | -0.587 | -0.387 | -0.107 | 0.253 | 0.693 | 1.213 | 1.813 | 2.493 | 3.253 |
| 0.325 | -0.746 | -0.706 | -0.586 | -0.386 | -0.106 | 0.254 | 0.694 | 1.214 | 1.814 | 2.494 | 3.254 |
| 0.326 | -0.746 | -0.706 | -0.586 | -0.386 | -0.106 | 0.254 | 0.694 | 1.214 | 1.814 | 2.494 | 3.254 |
| 0.327 | -0.745 | -0.705 | -0.585 | -0.385 | -0.105 | 0.255 | 0.695 | 1.215 | 1.815 | 2.495 | 3.255 |
| 0.328 | -0.744 | -0.704 | -0.584 | -0.384 | -0.104 | 0.256 | 0.696 | 1.216 | 1.816 | 2.496 | 3.256 |
| 0.329 | -0.744 | -0.704 | -0.584 | -0.384 | -0.104 | 0.256 | 0.696 | 1.216 | 1.816 | 2.496 | 3.256 |
| 0.33 | -0.743 | -0.703 | -0.583 | -0.383 | -0.103 | 0.257 | 0.697 | 1.217 | 1.817 | 2.497 | 3.257 |
| 0.331 | -0.742 | -0.702 | -0.582 | -0.382 | -0.102 | 0.258 | 0.698 | 1.218 | 1.818 | 2.498 | 3.258 |
| 0.332 | -0.742 | -0.702 | -0.582 | -0.382 | -0.102 | 0.258 | 0.698 | 1.218 | 1.818 | 2.498 | 3.258 |
| 0.333 | -0.741 | -0.701 | -0.581 | -0.381 | -0.101 | 0.259 | 0.699 | 1.219 | 1.819 | 2.499 | 3.259 |
| 0.334 | -0.74 | -0.7 | -0.58 | -0.38 | -0.1 | 0.26 | 0.7 | 1.22 | 1.82 | 2.5 | 3.26 |
| 0.335 | -0.74 | -0.7 | -0.58 | -0.38 | -0.1 | 0.26 | 0.7 | 1.22 | 1.82 | 2.5 | 3.26 |
| 0.336 | -0.739 | -0.699 | -0.579 | -0.379 | -0.099 | 0.261 | 0.701 | 1.221 | 1.821 | 2.501 | 3.261 |
| 0.337 | -0.738 | -0.698 | -0.578 | -0.378 | -0.098 | 0.262 | 0.702 | 1.222 | 1.822 | 2.502 | 3.262 |
| 0.338 | -0.738 | -0.698 | -0.578 | -0.378 | -0.098 | 0.262 | 0.702 | 1.222 | 1.822 | 2.502 | 3.262 |
| 0.339 | -0.737 | -0.697 | -0.577 | -0.377 | -0.097 | 0.263 | 0.703 | 1.223 | 1.823 | 2.503 | 3.263 |
| 0.34 | -0.736 | -0.696 | -0.576 | -0.376 | -0.096 | 0.264 | 0.704 | 1.224 | 1.824 | 2.504 | 3.264 |
| 0.341 | -0.736 | -0.696 | -0.576 | -0.376 | -0.096 | 0.264 | 0.704 | 1.224 | 1.824 | 2.504 | 3.264 |
| 0.342 | -0.735 | -0.695 | -0.575 | -0.375 | -0.095 | 0.265 | 0.705 | 1.225 | 1.825 | 2.505 | 3.265 |
| 0.343 | -0.734 | -0.694 | -0.574 | -0.374 | -0.094 | 0.266 | 0.706 | 1.226 | 1.826 | 2.506 | 3.266 |
| 0.344 | -0.734 | -0.694 | -0.574 | -0.374 | -0.094 | 0.266 | 0.706 | 1.226 | 1.826 | 2.506 | 3.266 |
| 0.345 | -0.733 | -0.693 | -0.573 | -0.373 | -0.093 | 0.267 | 0.707 | 1.227 | 1.827 | 2.507 | 3.267 |
| 0.346 | -0.732 | -0.692 | -0.572 | -0.372 | -0.092 | 0.268 | 0.708 | 1.228 | 1.828 | 2.508 | 3.268 |
| 0.347 | -0.732 | -0.692 | -0.572 | -0.372 | -0.092 | 0.268 | 0.708 | 1.228 | 1.828 | 2.508 | 3.268 |
| 0.348 | -0.731 | -0.691 | -0.571 | -0.371 | -0.091 | 0.269 | 0.709 | 1.229 | 1.829 | 2.509 | 3.269 |
| 0.349 | -0.73 | -0.69 | -0.57 | -0.37 | -0.09 | 0.27 | 0.71 | 1.23 | 1.83 | 2.51 | 3.27 |
| 0.35 | -0.73 | -0.69 | -0.57 | -0.37 | -0.09 | 0.27 | 0.71 | 1.23 | 1.83 | 2.51 | 3.27 |
| 0.351 | -0.729 | -0.689 | -0.569 | -0.369 | -0.089 | 0.271 | 0.711 | 1.231 | 1.831 | 2.511 | 3.271 |
| 0.352 | -0.728 | -0.688 | -0.568 | -0.368 | -0.088 | 0.272 | 0.712 | 1.232 | 1.832 | 2.512 | 3.272 |
| 0.353 | -0.728 | -0.688 | -0.568 | -0.368 | -0.088 | 0.272 | 0.712 | 1.232 | 1.832 | 2.512 | 3.272 |
| 0.354 | -0.727 | -0.687 | -0.567 | -0.367 | -0.087 | 0.273 | 0.713 | 1.233 | 1.833 | 2.513 | 3.273 |
| 0.355 | -0.726 | -0.686 | -0.566 | -0.366 | -0.086 | 0.274 | 0.714 | 1.234 | 1.834 | 2.514 | 3.274 |
| 0.356 | -0.726 | -0.686 | -0.566 | -0.366 | -0.086 | 0.274 | 0.714 | 1.234 | 1.834 | 2.514 | 3.274 |
| 0.357 | -0.725 | -0.685 | -0.565 | -0.365 | -0.085 | 0.275 | 0.715 | 1.235 | 1.835 | 2.515 | 3.275 |
| 0.358 | -0.724 | -0.684 | -0.564 | -0.364 | -0.084 | 0.276 | 0.716 | 1.236 | 1.836 | 2.516 | 3.276 |
| 0.359 | -0.724 | -0.684 | -0.564 | -0.364 | -0.084 | 0.276 | 0.716 | 1.236 | 1.836 | 2.516 | 3.276 |
| 0.36 | -0.723 | -0.683 | -0.563 | -0.363 | -0.083 | 0.277 | 0.717 | 1.237 | 1.837 | 2.517 | 3.277 |
| 0.361 | -0.722 | -0.682 | -0.562 | -0.362 | -0.082 | 0.278 | 0.718 | 1.238 | 1.838 | 2.518 | 3.278 |
| 0.362 | -0.722 | -0.682 | -0.562 | -0.362 | -0.082 | 0.278 | 0.718 | 1.238 | 1.838 | 2.518 | 3.278 |
| 0.363 | -0.721 | -0.681 | -0.561 | -0.361 | -0.081 | 0.279 | 0.719 | 1.239 | 1.839 | 2.519 | 3.279 |
| 0.364 | -0.72 | -0.68 | -0.56 | -0.36 | -0.08 | 0.28 | 0.72 | 1.24 | 1.84 | 2.52 | 3.28 |
| 0.365 | -0.72 | -0.68 | -0.56 | -0.36 | -0.08 | 0.28 | 0.72 | 1.24 | 1.84 | 2.52 | 3.28 |
| 0.366 | -0.719 | -0.679 | -0.559 | -0.359 | -0.079 | 0.281 | 0.721 | 1.241 | 1.841 | 2.521 | 3.281 |
| 0.367 | -0.718 | -0.678 | -0.558 | -0.358 | -0.078 | 0.282 | 0.722 | 1.242 | 1.842 | 2.522 | 3.282 |
| 0.368 | -0.718 | -0.678 | -0.558 | -0.358 | -0.078 | 0.282 | 0.722 | 1.242 | 1.842 | 2.522 | 3.282 |
| 0.369 | -0.717 | -0.677 | -0.557 | -0.357 | -0.077 | 0.283 | 0.723 | 1.243 | 1.843 | 2.523 | 3.283 |
| 0.37 | -0.716 | -0.676 | -0.556 | -0.356 | -0.076 | 0.284 | 0.724 | 1.244 | 1.844 | 2.524 | 3.284 |
| 0.371 | -0.716 | -0.676 | -0.556 | -0.356 | -0.076 | 0.284 | 0.724 | 1.244 | 1.844 | 2.524 | 3.284 |
| 0.372 | -0.715 | -0.675 | -0.555 | -0.355 | -0.075 | 0.285 | 0.725 | 1.245 | 1.845 | 2.525 | 3.285 |
| 0.373 | -0.714 | -0.674 | -0.554 | -0.354 | -0.074 | 0.286 | 0.726 | 1.246 | 1.846 | 2.526 | 3.286 |
| 0.374 | -0.714 | -0.674 | -0.554 | -0.354 | -0.074 | 0.286 | 0.726 | 1.246 | 1.846 | 2.526 | 3.286 |
| 0.375 | -0.713 | -0.673 | -0.553 | -0.353 | -0.073 | 0.287 | 0.727 | 1.247 | 1.847 | 2.527 | 3.287 |
| 0.376 | -0.712 | -0.672 | -0.552 | -0.352 | -0.072 | 0.288 | 0.728 | 1.248 | 1.848 | 2.528 | 3.288 |
| 0.377 | -0.712 | -0.672 | -0.552 | -0.352 | -0.072 | 0.288 | 0.728 | 1.248 | 1.848 | 2.528 | 3.288 |
| 0.378 | -0.711 | -0.671 | -0.551 | -0.351 | -0.071 | 0.289 | 0.729 | 1.249 | 1.849 | 2.529 | 3.289 |
| 0.379 | -0.71 | -0.67 | -0.55 | -0.35 | -0.07 | 0.29 | 0.73 | 1.25 | 1.85 | 2.53 | 3.29 |
| 0.38 | -0.71 | -0.67 | -0.55 | -0.35 | -0.07 | 0.29 | 0.73 | 1.25 | 1.85 | 2.53 | 3.29 |
| 0.381 | -0.709 | -0.669 | -0.549 | -0.349 | -0.069 | 0.291 | 0.731 | 1.251 | 1.851 | 2.531 | 3.291 |
| 0.382 | -0.708 | -0.668 | -0.548 | -0.348 | -0.068 | 0.292 | 0.732 | 1.252 | 1.852 | 2.532 | 3.292 |
| 0.383 | -0.708 | -0.668 | -0.548 | -0.348 | -0.068 | 0.292 | 0.732 | 1.252 | 1.852 | 2.532 | 3.292 |
| 0.384 | -0.707 | -0.667 | -0.547 | -0.347 | -0.067 | 0.293 | 0.733 | 1.253 | 1.853 | 2.533 | 3.293 |
| 0.385 | -0.706 | -0.666 | -0.546 | -0.346 | -0.066 | 0.294 | 0.734 | 1.254 | 1.854 | 2.534 | 3.294 |
| 0.386 | -0.705 | -0.665 | -0.545 | -0.345 | -0.065 | 0.295 | 0.735 | 1.255 | 1.855 | 2.535 | 3.295 |
| 0.387 | -0.705 | -0.665 | -0.545 | -0.345 | -0.065 | 0.295 | 0.735 | 1.255 | 1.855 | 2.535 | 3.295 |
| 0.388 | -0.704 | -0.664 | -0.544 | -0.344 | -0.064 | 0.296 | 0.736 | 1.256 | 1.856 | 2.536 | 3.296 |
| 0.389 | -0.703 | -0.663 | -0.543 | -0.343 | -0.063 | 0.297 | 0.737 | 1.257 | 1.857 | 2.537 | 3.297 |
| 0.39 | -0.703 | -0.663 | -0.543 | -0.343 | -0.063 | 0.297 | 0.737 | 1.257 | 1.857 | 2.537 | 3.297 |
| 0.391 | -0.702 | -0.662 | -0.542 | -0.342 | -0.062 | 0.298 | 0.738 | 1.258 | 1.858 | 2.538 | 3.298 |
| 0.392 | -0.701 | -0.661 | -0.541 | -0.341 | -0.061 | 0.299 | 0.739 | 1.259 | 1.859 | 2.539 | 3.299 |
| 0.393 | -0.701 | -0.661 | -0.541 | -0.341 | -0.061 | 0.299 | 0.739 | 1.259 | 1.859 | 2.539 | 3.299 |
| 0.394 | -0.7 | -0.66 | -0.54 | -0.34 | -0.06 | 0.3 | 0.74 | 1.26 | 1.86 | 2.54 | 3.3 |
| 0.395 | -0.699 | -0.659 | -0.539 | -0.339 | -0.059 | 0.301 | 0.741 | 1.261 | 1.861 | 2.541 | 3.301 |
| 0.396 | -0.699 | -0.659 | -0.539 | -0.339 | -0.059 | 0.301 | 0.741 | 1.261 | 1.861 | 2.541 | 3.301 |
| 0.397 | -0.698 | -0.658 | -0.538 | -0.338 | -0.058 | 0.302 | 0.742 | 1.262 | 1.862 | 2.542 | 3.302 |
| 0.398 | -0.697 | -0.657 | -0.537 | -0.337 | -0.057 | 0.303 | 0.743 | 1.263 | 1.863 | 2.543 | 3.303 |
| 0.399 | -0.697 | -0.657 | -0.537 | -0.337 | -0.057 | 0.303 | 0.743 | 1.263 | 1.863 | 2.543 | 3.303 |
| 0.4 | -0.696 | -0.656 | -0.536 | -0.336 | -0.056 | 0.304 | 0.744 | 1.264 | 1.864 | 2.544 | 3.304 |
| 0.401 | -0.695 | -0.655 | -0.535 | -0.335 | -0.055 | 0.305 | 0.745 | 1.265 | 1.865 | 2.545 | 3.305 |
| 0.402 | -0.695 | -0.655 | -0.535 | -0.335 | -0.055 | 0.305 | 0.745 | 1.265 | 1.865 | 2.545 | 3.305 |
| 0.403 | -0.694 | -0.654 | -0.534 | -0.334 | -0.054 | 0.306 | 0.746 | 1.266 | 1.866 | 2.546 | 3.306 |
| 0.404 | -0.693 | -0.653 | -0.533 | -0.333 | -0.053 | 0.307 | 0.747 | 1.267 | 1.867 | 2.547 | 3.307 |
| 0.405 | -0.693 | -0.653 | -0.533 | -0.333 | -0.053 | 0.307 | 0.747 | 1.267 | 1.867 | 2.547 | 3.307 |
| 0.406 | -0.692 | -0.652 | -0.532 | -0.332 | -0.052 | 0.308 | 0.748 | 1.268 | 1.868 | 2.548 | 3.308 |
| 0.407 | -0.691 | -0.651 | -0.531 | -0.331 | -0.051 | 0.309 | 0.749 | 1.269 | 1.869 | 2.549 | 3.309 |
| 0.408 | -0.691 | -0.651 | -0.531 | -0.331 | -0.051 | 0.309 | 0.749 | 1.269 | 1.869 | 2.549 | 3.309 |
| 0.409 | -0.69 | -0.65 | -0.53 | -0.33 | -0.05 | 0.31 | 0.75 | 1.27 | 1.87 | 2.55 | 3.31 |
| 0.41 | -0.689 | -0.649 | -0.529 | -0.329 | -0.049 | 0.311 | 0.751 | 1.271 | 1.871 | 2.551 | 3.311 |
| 0.411 | -0.688 | -0.648 | -0.528 | -0.328 | -0.048 | 0.312 | 0.752 | 1.272 | 1.872 | 2.552 | 3.312 |
| 0.412 | -0.688 | -0.648 | -0.528 | -0.328 | -0.048 | 0.312 | 0.752 | 1.272 | 1.872 | 2.552 | 3.312 |
| 0.413 | -0.687 | -0.647 | -0.527 | -0.327 | -0.047 | 0.313 | 0.753 | 1.273 | 1.873 | 2.553 | 3.313 |
| 0.414 | -0.686 | -0.646 | -0.526 | -0.326 | -0.046 | 0.314 | 0.754 | 1.274 | 1.874 | 2.554 | 3.314 |
| 0.415 | -0.686 | -0.646 | -0.526 | -0.326 | -0.046 | 0.314 | 0.754 | 1.274 | 1.874 | 2.554 | 3.314 |
| 0.416 | -0.685 | -0.645 | -0.525 | -0.325 | -0.045 | 0.315 | 0.755 | 1.275 | 1.875 | 2.555 | 3.315 |
| 0.417 | -0.684 | -0.644 | -0.524 | -0.324 | -0.044 | 0.316 | 0.756 | 1.276 | 1.876 | 2.556 | 3.316 |
| 0.418 | -0.684 | -0.644 | -0.524 | -0.324 | -0.044 | 0.316 | 0.756 | 1.276 | 1.876 | 2.556 | 3.316 |
| 0.419 | -0.683 | -0.643 | -0.523 | -0.323 | -0.043 | 0.317 | 0.757 | 1.277 | 1.877 | 2.557 | 3.317 |
| 0.42 | -0.682 | -0.642 | -0.522 | -0.322 | -0.042 | 0.318 | 0.758 | 1.278 | 1.878 | 2.558 | 3.318 |
| 0.421 | -0.682 | -0.642 | -0.522 | -0.322 | -0.042 | 0.318 | 0.758 | 1.278 | 1.878 | 2.558 | 3.318 |
| 0.422 | -0.681 | -0.641 | -0.521 | -0.321 | -0.041 | 0.319 | 0.759 | 1.279 | 1.879 | 2.559 | 3.319 |
| 0.423 | -0.68 | -0.64 | -0.52 | -0.32 | -0.04 | 0.32 | 0.76 | 1.28 | 1.88 | 2.56 | 3.32 |
| 0.424 | -0.68 | -0.64 | -0.52 | -0.32 | -0.04 | 0.32 | 0.76 | 1.28 | 1.88 | 2.56 | 3.32 |
| 0.425 | -0.679 | -0.639 | -0.519 | -0.319 | -0.039 | 0.321 | 0.761 | 1.281 | 1.881 | 2.561 | 3.321 |
| 0.426 | -0.678 | -0.638 | -0.518 | -0.318 | -0.038 | 0.322 | 0.762 | 1.282 | 1.882 | 2.562 | 3.322 |
| 0.427 | -0.677 | -0.637 | -0.517 | -0.317 | -0.037 | 0.323 | 0.763 | 1.283 | 1.883 | 2.563 | 3.323 |
| 0.428 | -0.677 | -0.637 | -0.517 | -0.317 | -0.037 | 0.323 | 0.763 | 1.283 | 1.883 | 2.563 | 3.323 |
| 0.429 | -0.676 | -0.636 | -0.516 | -0.316 | -0.036 | 0.324 | 0.764 | 1.284 | 1.884 | 2.564 | 3.324 |
| 0.43 | -0.675 | -0.635 | -0.515 | -0.315 | -0.035 | 0.325 | 0.765 | 1.285 | 1.885 | 2.565 | 3.325 |
| 0.431 | -0.675 | -0.635 | -0.515 | -0.315 | -0.035 | 0.325 | 0.765 | 1.285 | 1.885 | 2.565 | 3.325 |
| 0.432 | -0.674 | -0.634 | -0.514 | -0.314 | -0.034 | 0.326 | 0.766 | 1.286 | 1.886 | 2.566 | 3.326 |
| 0.433 | -0.673 | -0.633 | -0.513 | -0.313 | -0.033 | 0.327 | 0.767 | 1.287 | 1.887 | 2.567 | 3.327 |
| 0.434 | -0.673 | -0.633 | -0.513 | -0.313 | -0.033 | 0.327 | 0.767 | 1.287 | 1.887 | 2.567 | 3.327 |
| 0.435 | -0.672 | -0.632 | -0.512 | -0.312 | -0.032 | 0.328 | 0.768 | 1.288 | 1.888 | 2.568 | 3.328 |
| 0.436 | -0.671 | -0.631 | -0.511 | -0.311 | -0.031 | 0.329 | 0.769 | 1.289 | 1.889 | 2.569 | 3.329 |
| 0.437 | -0.671 | -0.631 | -0.511 | -0.311 | -0.031 | 0.329 | 0.769 | 1.289 | 1.889 | 2.569 | 3.329 |
| 0.438 | -0.67 | -0.63 | -0.51 | -0.31 | -0.03 | 0.33 | 0.77 | 1.29 | 1.89 | 2.57 | 3.33 |
| 0.439 | -0.669 | -0.629 | -0.509 | -0.309 | -0.029 | 0.331 | 0.771 | 1.291 | 1.891 | 2.571 | 3.331 |
| 0.44 | -0.668 | -0.628 | -0.508 | -0.308 | -0.028 | 0.332 | 0.772 | 1.292 | 1.892 | 2.572 | 3.332 |
| 0.441 | -0.668 | -0.628 | -0.508 | -0.308 | -0.028 | 0.332 | 0.772 | 1.292 | 1.892 | 2.572 | 3.332 |
| 0.442 | -0.667 | -0.627 | -0.507 | -0.307 | -0.027 | 0.333 | 0.773 | 1.293 | 1.893 | 2.573 | 3.333 |
| 0.443 | -0.666 | -0.626 | -0.506 | -0.306 | -0.026 | 0.334 | 0.774 | 1.294 | 1.894 | 2.574 | 3.334 |
| 0.444 | -0.666 | -0.626 | -0.506 | -0.306 | -0.026 | 0.334 | 0.774 | 1.294 | 1.894 | 2.574 | 3.334 |
| 0.445 | -0.665 | -0.625 | -0.505 | -0.305 | -0.025 | 0.335 | 0.775 | 1.295 | 1.895 | 2.575 | 3.335 |
| 0.446 | -0.664 | -0.624 | -0.504 | -0.304 | -0.024 | 0.336 | 0.776 | 1.296 | 1.896 | 2.576 | 3.336 |
| 0.447 | -0.663 | -0.623 | -0.503 | -0.303 | -0.023 | 0.337 | 0.777 | 1.297 | 1.897 | 2.577 | 3.337 |
| 0.448 | -0.663 | -0.623 | -0.503 | -0.303 | -0.023 | 0.337 | 0.777 | 1.297 | 1.897 | 2.577 | 3.337 |
| 0.449 | -0.662 | -0.622 | -0.502 | -0.302 | -0.022 | 0.338 | 0.778 | 1.298 | 1.898 | 2.578 | 3.338 |
| 0.45 | -0.661 | -0.621 | -0.501 | -0.301 | -0.021 | 0.339 | 0.779 | 1.299 | 1.899 | 2.579 | 3.339 |
| 0.451 | -0.661 | -0.621 | -0.501 | -0.301 | -0.021 | 0.339 | 0.779 | 1.299 | 1.899 | 2.579 | 3.339 |
| 0.452 | -0.66 | -0.62 | -0.5 | -0.3 | -0.02 | 0.34 | 0.78 | 1.3 | 1.9 | 2.58 | 3.34 |
| 0.453 | -0.659 | -0.619 | -0.499 | -0.299 | -0.019 | 0.341 | 0.781 | 1.301 | 1.901 | 2.581 | 3.341 |
| 0.454 | -0.659 | -0.619 | -0.499 | -0.299 | -0.019 | 0.341 | 0.781 | 1.301 | 1.901 | 2.581 | 3.341 |
| 0.455 | -0.658 | -0.618 | -0.498 | -0.298 | -0.018 | 0.342 | 0.782 | 1.302 | 1.902 | 2.582 | 3.342 |
| 0.456 | -0.657 | -0.617 | -0.497 | -0.297 | -0.017 | 0.343 | 0.783 | 1.303 | 1.903 | 2.583 | 3.343 |
| 0.457 | -0.656 | -0.616 | -0.496 | -0.296 | -0.016 | 0.344 | 0.784 | 1.304 | 1.904 | 2.584 | 3.344 |
| 0.458 | -0.656 | -0.616 | -0.496 | -0.296 | -0.016 | 0.344 | 0.784 | 1.304 | 1.904 | 2.584 | 3.344 |
| 0.459 | -0.655 | -0.615 | -0.495 | -0.295 | -0.015 | 0.345 | 0.785 | 1.305 | 1.905 | 2.585 | 3.345 |
| 0.46 | -0.654 | -0.614 | -0.494 | -0.294 | -0.014 | 0.346 | 0.786 | 1.306 | 1.906 | 2.586 | 3.346 |
| 0.461 | -0.654 | -0.614 | -0.494 | -0.294 | -0.014 | 0.346 | 0.786 | 1.306 | 1.906 | 2.586 | 3.346 |
| 0.462 | -0.653 | -0.613 | -0.493 | -0.293 | -0.013 | 0.347 | 0.787 | 1.307 | 1.907 | 2.587 | 3.347 |
| 0.463 | -0.652 | -0.612 | -0.492 | -0.292 | -0.012 | 0.348 | 0.788 | 1.308 | 1.908 | 2.588 | 3.348 |
| 0.464 | -0.651 | -0.611 | -0.491 | -0.291 | -0.011 | 0.349 | 0.789 | 1.309 | 1.909 | 2.589 | 3.349 |
| 0.465 | -0.651 | -0.611 | -0.491 | -0.291 | -0.011 | 0.349 | 0.789 | 1.309 | 1.909 | 2.589 | 3.349 |
| 0.466 | -0.65 | -0.61 | -0.49 | -0.29 | -0.01 | 0.35 | 0.79 | 1.31 | 1.91 | 2.59 | 3.35 |
| 0.467 | -0.649 | -0.609 | -0.489 | -0.289 | -0.009 | 0.351 | 0.791 | 1.311 | 1.911 | 2.591 | 3.351 |
| 0.468 | -0.649 | -0.609 | -0.489 | -0.289 | -0.009 | 0.351 | 0.791 | 1.311 | 1.911 | 2.591 | 3.351 |
| 0.469 | -0.648 | -0.608 | -0.488 | -0.288 | -0.008 | 0.352 | 0.792 | 1.312 | 1.912 | 2.592 | 3.352 |
| 0.47 | -0.647 | -0.607 | -0.487 | -0.287 | -0.007 | 0.353 | 0.793 | 1.313 | 1.913 | 2.593 | 3.353 |
| 0.471 | -0.646 | -0.606 | -0.486 | -0.286 | -0.006 | 0.354 | 0.794 | 1.314 | 1.914 | 2.594 | 3.354 |
| 0.472 | -0.646 | -0.606 | -0.486 | -0.286 | -0.006 | 0.354 | 0.794 | 1.314 | 1.914 | 2.594 | 3.354 |
| 0.473 | -0.645 | -0.605 | -0.485 | -0.285 | -0.005 | 0.355 | 0.795 | 1.315 | 1.915 | 2.595 | 3.355 |
| 0.474 | -0.644 | -0.604 | -0.484 | -0.284 | -0.004 | 0.356 | 0.796 | 1.316 | 1.916 | 2.596 | 3.356 |
| 0.475 | -0.643 | -0.603 | -0.483 | -0.283 | -0.003 | 0.357 | 0.797 | 1.317 | 1.917 | 2.597 | 3.357 |
| 0.476 | -0.643 | -0.603 | -0.483 | -0.283 | -0.003 | 0.357 | 0.797 | 1.317 | 1.917 | 2.597 | 3.357 |
| 0.477 | -0.642 | -0.602 | -0.482 | -0.282 | -0.002 | 0.358 | 0.798 | 1.318 | 1.918 | 2.598 | 3.358 |
| 0.478 | -0.641 | -0.601 | -0.481 | -0.281 | -0.001 | 0.359 | 0.799 | 1.319 | 1.919 | 2.599 | 3.359 |
| 0.479 | -0.641 | -0.601 | -0.481 | -0.281 | -0.001 | 0.359 | 0.799 | 1.319 | 1.919 | 2.599 | 3.359 |
| 0.48 | -0.64 | -0.6 | -0.48 | -0.28 | 0 | 0.36 | 0.8 | 1.32 | 1.92 | 2.6 | 3.36 |
| 0.481 | -0.639 | -0.599 | -0.479 | -0.279 | 0.001 | 0.361 | 0.801 | 1.321 | 1.921 | 2.601 | 3.361 |
| 0.482 | -0.638 | -0.598 | -0.478 | -0.278 | 0.002 | 0.362 | 0.802 | 1.322 | 1.922 | 2.602 | 3.362 |
| 0.483 | -0.638 | -0.598 | -0.478 | -0.278 | 0.002 | 0.362 | 0.802 | 1.322 | 1.922 | 2.602 | 3.362 |
| 0.484 | -0.637 | -0.597 | -0.477 | -0.277 | 0.003 | 0.363 | 0.803 | 1.323 | 1.923 | 2.603 | 3.363 |
| 0.485 | -0.636 | -0.596 | -0.476 | -0.276 | 0.004 | 0.364 | 0.804 | 1.324 | 1.924 | 2.604 | 3.364 |
| 0.486 | -0.635 | -0.595 | -0.475 | -0.275 | 0.005 | 0.365 | 0.805 | 1.325 | 1.925 | 2.605 | 3.365 |
| 0.487 | -0.635 | -0.595 | -0.475 | -0.275 | 0.005 | 0.365 | 0.805 | 1.325 | 1.925 | 2.605 | 3.365 |
| 0.488 | -0.634 | -0.594 | -0.474 | -0.274 | 0.006 | 0.366 | 0.806 | 1.326 | 1.926 | 2.606 | 3.366 |
| 0.489 | -0.633 | -0.593 | -0.473 | -0.273 | 0.007 | 0.367 | 0.807 | 1.327 | 1.927 | 2.607 | 3.367 |
| 0.49 | -0.632 | -0.592 | -0.472 | -0.272 | 0.008 | 0.368 | 0.808 | 1.328 | 1.928 | 2.608 | 3.368 |
| 0.491 | -0.632 | -0.592 | -0.472 | -0.272 | 0.008 | 0.368 | 0.808 | 1.328 | 1.928 | 2.608 | 3.368 |
| 0.492 | -0.631 | -0.591 | -0.471 | -0.271 | 0.009 | 0.369 | 0.809 | 1.329 | 1.929 | 2.609 | 3.369 |
| 0.493 | -0.63 | -0.59 | -0.47 | -0.27 | 0.01 | 0.37 | 0.81 | 1.33 | 1.93 | 2.61 | 3.37 |
| 0.494 | -0.629 | -0.589 | -0.469 | -0.269 | 0.011 | 0.371 | 0.811 | 1.331 | 1.931 | 2.611 | 3.371 |
| 0.495 | -0.629 | -0.589 | -0.469 | -0.269 | 0.011 | 0.371 | 0.811 | 1.331 | 1.931 | 2.611 | 3.371 |
| 0.496 | -0.628 | -0.588 | -0.468 | -0.268 | 0.012 | 0.372 | 0.812 | 1.332 | 1.932 | 2.612 | 3.372 |
| 0.497 | -0.627 | -0.587 | -0.467 | -0.267 | 0.013 | 0.373 | 0.813 | 1.333 | 1.933 | 2.613 | 3.373 |
| 0.498 | -0.626 | -0.586 | -0.466 | -0.266 | 0.014 | 0.374 | 0.814 | 1.334 | 1.934 | 2.614 | 3.374 |
| 0.499 | -0.626 | -0.586 | -0.466 | -0.266 | 0.014 | 0.374 | 0.814 | 1.334 | 1.934 | 2.614 | 3.374 |
| 0.5 | -0.625 | -0.585 | -0.465 | -0.265 | 0.015 | 0.375 | 0.815 | 1.335 | 1.935 | 2.615 | 3.375 |
| 0.501 | -0.624 | -0.584 | -0.464 | -0.264 | 0.016 | 0.376 | 0.816 | 1.336 | 1.936 | 2.616 | 3.376 |
| 0.502 | -0.623 | -0.583 | -0.463 | -0.263 | 0.017 | 0.377 | 0.817 | 1.337 | 1.937 | 2.617 | 3.377 |
| 0.503 | -0.623 | -0.583 | -0.463 | -0.263 | 0.017 | 0.377 | 0.817 | 1.337 | 1.937 | 2.617 | 3.377 |
| 0.504 | -0.622 | -0.582 | -0.462 | -0.262 | 0.018 | 0.378 | 0.818 | 1.338 | 1.938 | 2.618 | 3.378 |
| 0.505 | -0.621 | -0.581 | -0.461 | -0.261 | 0.019 | 0.379 | 0.819 | 1.339 | 1.939 | 2.619 | 3.379 |
| 0.506 | -0.62 | -0.58 | -0.46 | -0.26 | 0.02 | 0.38 | 0.82 | 1.34 | 1.94 | 2.62 | 3.38 |
| 0.507 | -0.62 | -0.58 | -0.46 | -0.26 | 0.02 | 0.38 | 0.82 | 1.34 | 1.94 | 2.62 | 3.38 |
| 0.508 | -0.619 | -0.579 | -0.459 | -0.259 | 0.021 | 0.381 | 0.821 | 1.341 | 1.941 | 2.621 | 3.381 |
| 0.509 | -0.618 | -0.578 | -0.458 | -0.258 | 0.022 | 0.382 | 0.822 | 1.342 | 1.942 | 2.622 | 3.382 |
| 0.51 | -0.617 | -0.577 | -0.457 | -0.257 | 0.023 | 0.383 | 0.823 | 1.343 | 1.943 | 2.623 | 3.383 |
| 0.511 | -0.617 | -0.577 | -0.457 | -0.257 | 0.023 | 0.383 | 0.823 | 1.343 | 1.943 | 2.623 | 3.383 |
| 0.512 | -0.616 | -0.576 | -0.456 | -0.256 | 0.024 | 0.384 | 0.824 | 1.344 | 1.944 | 2.624 | 3.384 |
| 0.513 | -0.615 | -0.575 | -0.455 | -0.255 | 0.025 | 0.385 | 0.825 | 1.345 | 1.945 | 2.625 | 3.385 |
| 0.514 | -0.614 | -0.574 | -0.454 | -0.254 | 0.026 | 0.386 | 0.826 | 1.346 | 1.946 | 2.626 | 3.386 |
| 0.515 | -0.614 | -0.574 | -0.454 | -0.254 | 0.026 | 0.386 | 0.826 | 1.346 | 1.946 | 2.626 | 3.386 |
| 0.516 | -0.613 | -0.573 | -0.453 | -0.253 | 0.027 | 0.387 | 0.827 | 1.347 | 1.947 | 2.627 | 3.387 |
| 0.517 | -0.612 | -0.572 | -0.452 | -0.252 | 0.028 | 0.388 | 0.828 | 1.348 | 1.948 | 2.628 | 3.388 |
| 0.518 | -0.611 | -0.571 | -0.451 | -0.251 | 0.029 | 0.389 | 0.829 | 1.349 | 1.949 | 2.629 | 3.389 |
| 0.519 | -0.611 | -0.571 | -0.451 | -0.251 | 0.029 | 0.389 | 0.829 | 1.349 | 1.949 | 2.629 | 3.389 |
| 0.52 | -0.61 | -0.57 | -0.45 | -0.25 | 0.03 | 0.39 | 0.83 | 1.35 | 1.95 | 2.63 | 3.39 |
| 0.521 | -0.609 | -0.569 | -0.449 | -0.249 | 0.031 | 0.391 | 0.831 | 1.351 | 1.951 | 2.631 | 3.391 |
| 0.522 | -0.608 | -0.568 | -0.448 | -0.248 | 0.032 | 0.392 | 0.832 | 1.352 | 1.952 | 2.632 | 3.392 |
| 0.523 | -0.607 | -0.567 | -0.447 | -0.247 | 0.033 | 0.393 | 0.833 | 1.353 | 1.953 | 2.633 | 3.393 |
| 0.524 | -0.607 | -0.567 | -0.447 | -0.247 | 0.033 | 0.393 | 0.833 | 1.353 | 1.953 | 2.633 | 3.393 |
| 0.525 | -0.606 | -0.566 | -0.446 | -0.246 | 0.034 | 0.394 | 0.834 | 1.354 | 1.954 | 2.634 | 3.394 |
| 0.526 | -0.605 | -0.565 | -0.445 | -0.245 | 0.035 | 0.395 | 0.835 | 1.355 | 1.955 | 2.635 | 3.395 |
| 0.527 | -0.604 | -0.564 | -0.444 | -0.244 | 0.036 | 0.396 | 0.836 | 1.356 | 1.956 | 2.636 | 3.396 |
| 0.528 | -0.604 | -0.564 | -0.444 | -0.244 | 0.036 | 0.396 | 0.836 | 1.356 | 1.956 | 2.636 | 3.396 |
| 0.529 | -0.603 | -0.563 | -0.443 | -0.243 | 0.037 | 0.397 | 0.837 | 1.357 | 1.957 | 2.637 | 3.397 |
| 0.53 | -0.602 | -0.562 | -0.442 | -0.242 | 0.038 | 0.398 | 0.838 | 1.358 | 1.958 | 2.638 | 3.398 |
| 0.531 | -0.601 | -0.561 | -0.441 | -0.241 | 0.039 | 0.399 | 0.839 | 1.359 | 1.959 | 2.639 | 3.399 |
| 0.532 | -0.6 | -0.56 | -0.44 | -0.24 | 0.04 | 0.4 | 0.84 | 1.36 | 1.96 | 2.64 | 3.4 |
| 0.533 | -0.6 | -0.56 | -0.44 | -0.24 | 0.04 | 0.4 | 0.84 | 1.36 | 1.96 | 2.64 | 3.4 |
| 0.534 | -0.599 | -0.559 | -0.439 | -0.239 | 0.041 | 0.401 | 0.841 | 1.361 | 1.961 | 2.641 | 3.401 |
| 0.535 | -0.598 | -0.558 | -0.438 | -0.238 | 0.042 | 0.402 | 0.842 | 1.362 | 1.962 | 2.642 | 3.402 |
| 0.536 | -0.597 | -0.557 | -0.437 | -0.237 | 0.043 | 0.403 | 0.843 | 1.363 | 1.963 | 2.643 | 3.403 |
| 0.537 | -0.597 | -0.557 | -0.437 | -0.237 | 0.043 | 0.403 | 0.843 | 1.363 | 1.963 | 2.643 | 3.403 |
| 0.538 | -0.596 | -0.556 | -0.436 | -0.236 | 0.044 | 0.404 | 0.844 | 1.364 | 1.964 | 2.644 | 3.404 |
| 0.539 | -0.595 | -0.555 | -0.435 | -0.235 | 0.045 | 0.405 | 0.845 | 1.365 | 1.965 | 2.645 | 3.405 |
| 0.54 | -0.594 | -0.554 | -0.434 | -0.234 | 0.046 | 0.406 | 0.846 | 1.366 | 1.966 | 2.646 | 3.406 |
| 0.541 | -0.593 | -0.553 | -0.433 | -0.233 | 0.047 | 0.407 | 0.847 | 1.367 | 1.967 | 2.647 | 3.407 |
| 0.542 | -0.593 | -0.553 | -0.433 | -0.233 | 0.047 | 0.407 | 0.847 | 1.367 | 1.967 | 2.647 | 3.407 |
| 0.543 | -0.592 | -0.552 | -0.432 | -0.232 | 0.048 | 0.408 | 0.848 | 1.368 | 1.968 | 2.648 | 3.408 |
| 0.544 | -0.591 | -0.551 | -0.431 | -0.231 | 0.049 | 0.409 | 0.849 | 1.369 | 1.969 | 2.649 | 3.409 |
| 0.545 | -0.59 | -0.55 | -0.43 | -0.23 | 0.05 | 0.41 | 0.85 | 1.37 | 1.97 | 2.65 | 3.41 |
| 0.546 | -0.589 | -0.549 | -0.429 | -0.229 | 0.051 | 0.411 | 0.851 | 1.371 | 1.971 | 2.651 | 3.411 |
| 0.547 | -0.589 | -0.549 | -0.429 | -0.229 | 0.051 | 0.411 | 0.851 | 1.371 | 1.971 | 2.651 | 3.411 |
| 0.548 | -0.588 | -0.548 | -0.428 | -0.228 | 0.052 | 0.412 | 0.852 | 1.372 | 1.972 | 2.652 | 3.412 |
| 0.549 | -0.587 | -0.547 | -0.427 | -0.227 | 0.053 | 0.413 | 0.853 | 1.373 | 1.973 | 2.653 | 3.413 |
| 0.55 | -0.586 | -0.546 | -0.426 | -0.226 | 0.054 | 0.414 | 0.854 | 1.374 | 1.974 | 2.654 | 3.414 |
| 0.551 | -0.585 | -0.545 | -0.425 | -0.225 | 0.055 | 0.415 | 0.855 | 1.375 | 1.975 | 2.655 | 3.415 |
| 0.552 | -0.585 | -0.545 | -0.425 | -0.225 | 0.055 | 0.415 | 0.855 | 1.375 | 1.975 | 2.655 | 3.415 |
| 0.553 | -0.584 | -0.544 | -0.424 | -0.224 | 0.056 | 0.416 | 0.856 | 1.376 | 1.976 | 2.656 | 3.416 |
| 0.554 | -0.583 | -0.543 | -0.423 | -0.223 | 0.057 | 0.417 | 0.857 | 1.377 | 1.977 | 2.657 | 3.417 |
| 0.555 | -0.582 | -0.542 | -0.422 | -0.222 | 0.058 | 0.418 | 0.858 | 1.378 | 1.978 | 2.658 | 3.418 |
| 0.556 | -0.581 | -0.541 | -0.421 | -0.221 | 0.059 | 0.419 | 0.859 | 1.379 | 1.979 | 2.659 | 3.419 |
| 0.557 | -0.58 | -0.54 | -0.42 | -0.22 | 0.06 | 0.42 | 0.86 | 1.38 | 1.98 | 2.66 | 3.42 |
| 0.558 | -0.58 | -0.54 | -0.42 | -0.22 | 0.06 | 0.42 | 0.86 | 1.38 | 1.98 | 2.66 | 3.42 |
| 0.559 | -0.579 | -0.539 | -0.419 | -0.219 | 0.061 | 0.421 | 0.861 | 1.381 | 1.981 | 2.661 | 3.421 |
| 0.56 | -0.578 | -0.538 | -0.418 | -0.218 | 0.062 | 0.422 | 0.862 | 1.382 | 1.982 | 2.662 | 3.422 |
| 0.561 | -0.577 | -0.537 | -0.417 | -0.217 | 0.063 | 0.423 | 0.863 | 1.383 | 1.983 | 2.663 | 3.423 |
| 0.562 | -0.576 | -0.536 | -0.416 | -0.216 | 0.064 | 0.424 | 0.864 | 1.384 | 1.984 | 2.664 | 3.424 |
| 0.563 | -0.576 | -0.536 | -0.416 | -0.216 | 0.064 | 0.424 | 0.864 | 1.384 | 1.984 | 2.664 | 3.424 |
| 0.564 | -0.575 | -0.535 | -0.415 | -0.215 | 0.065 | 0.425 | 0.865 | 1.385 | 1.985 | 2.665 | 3.425 |
| 0.565 | -0.574 | -0.534 | -0.414 | -0.214 | 0.066 | 0.426 | 0.866 | 1.386 | 1.986 | 2.666 | 3.426 |
| 0.566 | -0.573 | -0.533 | -0.413 | -0.213 | 0.067 | 0.427 | 0.867 | 1.387 | 1.987 | 2.667 | 3.427 |
| 0.567 | -0.572 | -0.532 | -0.412 | -0.212 | 0.068 | 0.428 | 0.868 | 1.388 | 1.988 | 2.668 | 3.428 |
| 0.568 | -0.571 | -0.531 | -0.411 | -0.211 | 0.069 | 0.429 | 0.869 | 1.389 | 1.989 | 2.669 | 3.429 |
| 0.569 | -0.571 | -0.531 | -0.411 | -0.211 | 0.069 | 0.429 | 0.869 | 1.389 | 1.989 | 2.669 | 3.429 |
| 0.57 | -0.57 | -0.53 | -0.41 | -0.21 | 0.07 | 0.43 | 0.87 | 1.39 | 1.99 | 2.67 | 3.43 |
| 0.571 | -0.569 | -0.529 | -0.409 | -0.209 | 0.071 | 0.431 | 0.871 | 1.391 | 1.991 | 2.671 | 3.431 |
| 0.572 | -0.568 | -0.528 | -0.408 | -0.208 | 0.072 | 0.432 | 0.872 | 1.392 | 1.992 | 2.672 | 3.432 |
| 0.573 | -0.567 | -0.527 | -0.407 | -0.207 | 0.073 | 0.433 | 0.873 | 1.393 | 1.993 | 2.673 | 3.433 |
| 0.574 | -0.566 | -0.526 | -0.406 | -0.206 | 0.074 | 0.434 | 0.874 | 1.394 | 1.994 | 2.674 | 3.434 |
| 0.575 | -0.566 | -0.526 | -0.406 | -0.206 | 0.074 | 0.434 | 0.874 | 1.394 | 1.994 | 2.674 | 3.434 |
| 0.576 | -0.565 | -0.525 | -0.405 | -0.205 | 0.075 | 0.435 | 0.875 | 1.395 | 1.995 | 2.675 | 3.435 |
| 0.577 | -0.564 | -0.524 | -0.404 | -0.204 | 0.076 | 0.436 | 0.876 | 1.396 | 1.996 | 2.676 | 3.436 |
| 0.578 | -0.563 | -0.523 | -0.403 | -0.203 | 0.077 | 0.437 | 0.877 | 1.397 | 1.997 | 2.677 | 3.437 |
| 0.579 | -0.562 | -0.522 | -0.402 | -0.202 | 0.078 | 0.438 | 0.878 | 1.398 | 1.998 | 2.678 | 3.438 |
| 0.58 | -0.561 | -0.521 | -0.401 | -0.201 | 0.079 | 0.439 | 0.879 | 1.399 | 1.999 | 2.679 | 3.439 |
| 0.581 | -0.56 | -0.52 | -0.4 | -0.2 | 0.08 | 0.44 | 0.88 | 1.4 | 2 | 2.68 | 3.44 |
| 0.582 | -0.56 | -0.52 | -0.4 | -0.2 | 0.08 | 0.44 | 0.88 | 1.4 | 2 | 2.68 | 3.44 |
| 0.583 | -0.559 | -0.519 | -0.399 | -0.199 | 0.081 | 0.441 | 0.881 | 1.401 | 2.001 | 2.681 | 3.441 |
| 0.584 | -0.558 | -0.518 | -0.398 | -0.198 | 0.082 | 0.442 | 0.882 | 1.402 | 2.002 | 2.682 | 3.442 |
| 0.585 | -0.557 | -0.517 | -0.397 | -0.197 | 0.083 | 0.443 | 0.883 | 1.403 | 2.003 | 2.683 | 3.443 |
| 0.586 | -0.556 | -0.516 | -0.396 | -0.196 | 0.084 | 0.444 | 0.884 | 1.404 | 2.004 | 2.684 | 3.444 |
| 0.587 | -0.555 | -0.515 | -0.395 | -0.195 | 0.085 | 0.445 | 0.885 | 1.405 | 2.005 | 2.685 | 3.445 |
| 0.588 | -0.554 | -0.514 | -0.394 | -0.194 | 0.086 | 0.446 | 0.886 | 1.406 | 2.006 | 2.686 | 3.446 |
| 0.589 | -0.554 | -0.514 | -0.394 | -0.194 | 0.086 | 0.446 | 0.886 | 1.406 | 2.006 | 2.686 | 3.446 |
| 0.59 | -0.553 | -0.513 | -0.393 | -0.193 | 0.087 | 0.447 | 0.887 | 1.407 | 2.007 | 2.687 | 3.447 |
| 0.591 | -0.552 | -0.512 | -0.392 | -0.192 | 0.088 | 0.448 | 0.888 | 1.408 | 2.008 | 2.688 | 3.448 |
| 0.592 | -0.551 | -0.511 | -0.391 | -0.191 | 0.089 | 0.449 | 0.889 | 1.409 | 2.009 | 2.689 | 3.449 |
| 0.593 | -0.55 | -0.51 | -0.39 | -0.19 | 0.09 | 0.45 | 0.89 | 1.41 | 2.01 | 2.69 | 3.45 |
| 0.594 | -0.549 | -0.509 | -0.389 | -0.189 | 0.091 | 0.451 | 0.891 | 1.411 | 2.011 | 2.691 | 3.451 |
| 0.595 | -0.548 | -0.508 | -0.388 | -0.188 | 0.092 | 0.452 | 0.892 | 1.412 | 2.012 | 2.692 | 3.452 |
| 0.596 | -0.548 | -0.508 | -0.388 | -0.188 | 0.092 | 0.452 | 0.892 | 1.412 | 2.012 | 2.692 | 3.452 |
| 0.597 | -0.547 | -0.507 | -0.387 | -0.187 | 0.093 | 0.453 | 0.893 | 1.413 | 2.013 | 2.693 | 3.453 |
| 0.598 | -0.546 | -0.506 | -0.386 | -0.186 | 0.094 | 0.454 | 0.894 | 1.414 | 2.014 | 2.694 | 3.454 |
| 0.599 | -0.545 | -0.505 | -0.385 | -0.185 | 0.095 | 0.455 | 0.895 | 1.415 | 2.015 | 2.695 | 3.455 |
| 0.6 | -0.544 | -0.504 | -0.384 | -0.184 | 0.096 | 0.456 | 0.896 | 1.416 | 2.016 | 2.696 | 3.456 |
| 0.601 | -0.543 | -0.503 | -0.383 | -0.183 | 0.097 | 0.457 | 0.897 | 1.417 | 2.017 | 2.697 | 3.457 |
| 0.602 | -0.542 | -0.502 | -0.382 | -0.182 | 0.098 | 0.458 | 0.898 | 1.418 | 2.018 | 2.698 | 3.458 |
| 0.603 | -0.541 | -0.501 | -0.381 | -0.181 | 0.099 | 0.459 | 0.899 | 1.419 | 2.019 | 2.699 | 3.459 |
| 0.604 | -0.54 | -0.5 | -0.38 | -0.18 | 0.1 | 0.46 | 0.9 | 1.42 | 2.02 | 2.7 | 3.46 |
| 0.605 | -0.54 | -0.5 | -0.38 | -0.18 | 0.1 | 0.46 | 0.9 | 1.42 | 2.02 | 2.7 | 3.46 |
| 0.606 | -0.539 | -0.499 | -0.379 | -0.179 | 0.101 | 0.461 | 0.901 | 1.421 | 2.021 | 2.701 | 3.461 |
| 0.607 | -0.538 | -0.498 | -0.378 | -0.178 | 0.102 | 0.462 | 0.902 | 1.422 | 2.022 | 2.702 | 3.462 |
| 0.608 | -0.537 | -0.497 | -0.377 | -0.177 | 0.103 | 0.463 | 0.903 | 1.423 | 2.023 | 2.703 | 3.463 |
| 0.609 | -0.536 | -0.496 | -0.376 | -0.176 | 0.104 | 0.464 | 0.904 | 1.424 | 2.024 | 2.704 | 3.464 |
| 0.61 | -0.535 | -0.495 | -0.375 | -0.175 | 0.105 | 0.465 | 0.905 | 1.425 | 2.025 | 2.705 | 3.465 |
| 0.611 | -0.534 | -0.494 | -0.374 | -0.174 | 0.106 | 0.466 | 0.906 | 1.426 | 2.026 | 2.706 | 3.466 |
| 0.612 | -0.533 | -0.493 | -0.373 | -0.173 | 0.107 | 0.467 | 0.907 | 1.427 | 2.027 | 2.707 | 3.467 |
| 0.613 | -0.532 | -0.492 | -0.372 | -0.172 | 0.108 | 0.468 | 0.908 | 1.428 | 2.028 | 2.708 | 3.468 |
| 0.614 | -0.532 | -0.492 | -0.372 | -0.172 | 0.108 | 0.468 | 0.908 | 1.428 | 2.028 | 2.708 | 3.468 |
| 0.615 | -0.531 | -0.491 | -0.371 | -0.171 | 0.109 | 0.469 | 0.909 | 1.429 | 2.029 | 2.709 | 3.469 |
| 0.616 | -0.53 | -0.49 | -0.37 | -0.17 | 0.11 | 0.47 | 0.91 | 1.43 | 2.03 | 2.71 | 3.47 |
| 0.617 | -0.529 | -0.489 | -0.369 | -0.169 | 0.111 | 0.471 | 0.911 | 1.431 | 2.031 | 2.711 | 3.471 |
| 0.618 | -0.528 | -0.488 | -0.368 | -0.168 | 0.112 | 0.472 | 0.912 | 1.432 | 2.032 | 2.712 | 3.472 |
| 0.619 | -0.527 | -0.487 | -0.367 | -0.167 | 0.113 | 0.473 | 0.913 | 1.433 | 2.033 | 2.713 | 3.473 |
| 0.62 | -0.526 | -0.486 | -0.366 | -0.166 | 0.114 | 0.474 | 0.914 | 1.434 | 2.034 | 2.714 | 3.474 |
| 0.621 | -0.525 | -0.485 | -0.365 | -0.165 | 0.115 | 0.475 | 0.915 | 1.435 | 2.035 | 2.715 | 3.475 |
| 0.622 | -0.524 | -0.484 | -0.364 | -0.164 | 0.116 | 0.476 | 0.916 | 1.436 | 2.036 | 2.716 | 3.476 |
| 0.623 | -0.523 | -0.483 | -0.363 | -0.163 | 0.117 | 0.477 | 0.917 | 1.437 | 2.037 | 2.717 | 3.477 |
| 0.624 | -0.522 | -0.482 | -0.362 | -0.162 | 0.118 | 0.478 | 0.918 | 1.438 | 2.038 | 2.718 | 3.478 |
| 0.625 | -0.521 | -0.481 | -0.361 | -0.161 | 0.119 | 0.479 | 0.919 | 1.439 | 2.039 | 2.719 | 3.479 |
| 0.626 | -0.521 | -0.481 | -0.361 | -0.161 | 0.119 | 0.479 | 0.919 | 1.439 | 2.039 | 2.719 | 3.479 |
| 0.627 | -0.52 | -0.48 | -0.36 | -0.16 | 0.12 | 0.48 | 0.92 | 1.44 | 2.04 | 2.72 | 3.48 |
| 0.628 | -0.519 | -0.479 | -0.359 | -0.159 | 0.121 | 0.481 | 0.921 | 1.441 | 2.041 | 2.721 | 3.481 |
| 0.629 | -0.518 | -0.478 | -0.358 | -0.158 | 0.122 | 0.482 | 0.922 | 1.442 | 2.042 | 2.722 | 3.482 |
| 0.63 | -0.517 | -0.477 | -0.357 | -0.157 | 0.123 | 0.483 | 0.923 | 1.443 | 2.043 | 2.723 | 3.483 |
| 0.631 | -0.516 | -0.476 | -0.356 | -0.156 | 0.124 | 0.484 | 0.924 | 1.444 | 2.044 | 2.724 | 3.484 |
| 0.632 | -0.515 | -0.475 | -0.355 | -0.155 | 0.125 | 0.485 | 0.925 | 1.445 | 2.045 | 2.725 | 3.485 |
| 0.633 | -0.514 | -0.474 | -0.354 | -0.154 | 0.126 | 0.486 | 0.926 | 1.446 | 2.046 | 2.726 | 3.486 |
| 0.634 | -0.513 | -0.473 | -0.353 | -0.153 | 0.127 | 0.487 | 0.927 | 1.447 | 2.047 | 2.727 | 3.487 |
| 0.635 | -0.512 | -0.472 | -0.352 | -0.152 | 0.128 | 0.488 | 0.928 | 1.448 | 2.048 | 2.728 | 3.488 |
| 0.636 | -0.511 | -0.471 | -0.351 | -0.151 | 0.129 | 0.489 | 0.929 | 1.449 | 2.049 | 2.729 | 3.489 |
| 0.637 | -0.51 | -0.47 | -0.35 | -0.15 | 0.13 | 0.49 | 0.93 | 1.45 | 2.05 | 2.73 | 3.49 |
| 0.638 | -0.509 | -0.469 | -0.349 | -0.149 | 0.131 | 0.491 | 0.931 | 1.451 | 2.051 | 2.731 | 3.491 |
| 0.639 | -0.508 | -0.468 | -0.348 | -0.148 | 0.132 | 0.492 | 0.932 | 1.452 | 2.052 | 2.732 | 3.492 |
| 0.64 | -0.507 | -0.467 | -0.347 | -0.147 | 0.133 | 0.493 | 0.933 | 1.453 | 2.053 | 2.733 | 3.493 |
| 0.641 | -0.507 | -0.467 | -0.347 | -0.147 | 0.133 | 0.493 | 0.933 | 1.453 | 2.053 | 2.733 | 3.493 |
| 0.642 | -0.506 | -0.466 | -0.346 | -0.146 | 0.134 | 0.494 | 0.934 | 1.454 | 2.054 | 2.734 | 3.494 |
| 0.643 | -0.505 | -0.465 | -0.345 | -0.145 | 0.135 | 0.495 | 0.935 | 1.455 | 2.055 | 2.735 | 3.495 |
| 0.644 | -0.504 | -0.464 | -0.344 | -0.144 | 0.136 | 0.496 | 0.936 | 1.456 | 2.056 | 2.736 | 3.496 |
| 0.645 | -0.503 | -0.463 | -0.343 | -0.143 | 0.137 | 0.497 | 0.937 | 1.457 | 2.057 | 2.737 | 3.497 |
| 0.646 | -0.502 | -0.462 | -0.342 | -0.142 | 0.138 | 0.498 | 0.938 | 1.458 | 2.058 | 2.738 | 3.498 |
| 0.647 | -0.501 | -0.461 | -0.341 | -0.141 | 0.139 | 0.499 | 0.939 | 1.459 | 2.059 | 2.739 | 3.499 |
| 0.648 | -0.5 | -0.46 | -0.34 | -0.14 | 0.14 | 0.5 | 0.94 | 1.46 | 2.06 | 2.74 | 3.5 |
| 0.649 | -0.499 | -0.459 | -0.339 | -0.139 | 0.141 | 0.501 | 0.941 | 1.461 | 2.061 | 2.741 | 3.501 |
| 0.65 | -0.498 | -0.458 | -0.338 | -0.138 | 0.142 | 0.502 | 0.942 | 1.462 | 2.062 | 2.742 | 3.502 |
| 0.651 | -0.497 | -0.457 | -0.337 | -0.137 | 0.143 | 0.503 | 0.943 | 1.463 | 2.063 | 2.743 | 3.503 |
| 0.652 | -0.496 | -0.456 | -0.336 | -0.136 | 0.144 | 0.504 | 0.944 | 1.464 | 2.064 | 2.744 | 3.504 |
| 0.653 | -0.495 | -0.455 | -0.335 | -0.135 | 0.145 | 0.505 | 0.945 | 1.465 | 2.065 | 2.745 | 3.505 |
| 0.654 | -0.494 | -0.454 | -0.334 | -0.134 | 0.146 | 0.506 | 0.946 | 1.466 | 2.066 | 2.746 | 3.506 |
| 0.655 | -0.493 | -0.453 | -0.333 | -0.133 | 0.147 | 0.507 | 0.947 | 1.467 | 2.067 | 2.747 | 3.507 |
| 0.656 | -0.492 | -0.452 | -0.332 | -0.132 | 0.148 | 0.508 | 0.948 | 1.468 | 2.068 | 2.748 | 3.508 |
| 0.657 | -0.491 | -0.451 | -0.331 | -0.131 | 0.149 | 0.509 | 0.949 | 1.469 | 2.069 | 2.749 | 3.509 |
| 0.658 | -0.49 | -0.45 | -0.33 | -0.13 | 0.15 | 0.51 | 0.95 | 1.47 | 2.07 | 2.75 | 3.51 |
| 0.659 | -0.489 | -0.449 | -0.329 | -0.129 | 0.151 | 0.511 | 0.951 | 1.471 | 2.071 | 2.751 | 3.511 |
| 0.66 | -0.488 | -0.448 | -0.328 | -0.128 | 0.152 | 0.512 | 0.952 | 1.472 | 2.072 | 2.752 | 3.512 |
| 0.661 | -0.487 | -0.447 | -0.327 | -0.127 | 0.153 | 0.513 | 0.953 | 1.473 | 2.073 | 2.753 | 3.513 |
| 0.662 | -0.486 | -0.446 | -0.326 | -0.126 | 0.154 | 0.514 | 0.954 | 1.474 | 2.074 | 2.754 | 3.514 |
| 0.663 | -0.485 | -0.445 | -0.325 | -0.125 | 0.155 | 0.515 | 0.955 | 1.475 | 2.075 | 2.755 | 3.515 |
| 0.664 | -0.484 | -0.444 | -0.324 | -0.124 | 0.156 | 0.516 | 0.956 | 1.476 | 2.076 | 2.756 | 3.516 |
| 0.665 | -0.483 | -0.443 | -0.323 | -0.123 | 0.157 | 0.517 | 0.957 | 1.477 | 2.077 | 2.757 | 3.517 |
| 0.666 | -0.482 | -0.442 | -0.322 | -0.122 | 0.158 | 0.518 | 0.958 | 1.478 | 2.078 | 2.758 | 3.518 |
| 0.667 | -0.481 | -0.441 | -0.321 | -0.121 | 0.159 | 0.519 | 0.959 | 1.479 | 2.079 | 2.759 | 3.519 |
| 0.668 | -0.48 | -0.44 | -0.32 | -0.12 | 0.16 | 0.52 | 0.96 | 1.48 | 2.08 | 2.76 | 3.52 |
| 0.669 | -0.479 | -0.439 | -0.319 | -0.119 | 0.161 | 0.521 | 0.961 | 1.481 | 2.081 | 2.761 | 3.521 |
| 0.67 | -0.478 | -0.438 | -0.318 | -0.118 | 0.162 | 0.522 | 0.962 | 1.482 | 2.082 | 2.762 | 3.522 |
| 0.671 | -0.477 | -0.437 | -0.317 | -0.117 | 0.163 | 0.523 | 0.963 | 1.483 | 2.083 | 2.763 | 3.523 |
| 0.672 | -0.476 | -0.436 | -0.316 | -0.116 | 0.164 | 0.524 | 0.964 | 1.484 | 2.084 | 2.764 | 3.524 |
| 0.673 | -0.475 | -0.435 | -0.315 | -0.115 | 0.165 | 0.525 | 0.965 | 1.485 | 2.085 | 2.765 | 3.525 |
| 0.674 | -0.474 | -0.434 | -0.314 | -0.114 | 0.166 | 0.526 | 0.966 | 1.486 | 2.086 | 2.766 | 3.526 |
| 0.675 | -0.473 | -0.433 | -0.313 | -0.113 | 0.167 | 0.527 | 0.967 | 1.487 | 2.087 | 2.767 | 3.527 |
| 0.676 | -0.472 | -0.432 | -0.312 | -0.112 | 0.168 | 0.528 | 0.968 | 1.488 | 2.088 | 2.768 | 3.528 |
| 0.677 | -0.471 | -0.431 | -0.311 | -0.111 | 0.169 | 0.529 | 0.969 | 1.489 | 2.089 | 2.769 | 3.529 |
| 0.678 | -0.47 | -0.43 | -0.31 | -0.11 | 0.17 | 0.53 | 0.97 | 1.49 | 2.09 | 2.77 | 3.53 |
| 0.679 | -0.469 | -0.429 | -0.309 | -0.109 | 0.171 | 0.531 | 0.971 | 1.491 | 2.091 | 2.771 | 3.531 |
| 0.68 | -0.468 | -0.428 | -0.308 | -0.108 | 0.172 | 0.532 | 0.972 | 1.492 | 2.092 | 2.772 | 3.532 |
| 0.681 | -0.467 | -0.427 | -0.307 | -0.107 | 0.173 | 0.533 | 0.973 | 1.493 | 2.093 | 2.773 | 3.533 |
| 0.682 | -0.466 | -0.426 | -0.306 | -0.106 | 0.174 | 0.534 | 0.974 | 1.494 | 2.094 | 2.774 | 3.534 |
| 0.683 | -0.465 | -0.425 | -0.305 | -0.105 | 0.175 | 0.535 | 0.975 | 1.495 | 2.095 | 2.775 | 3.535 |
| 0.684 | -0.464 | -0.424 | -0.304 | -0.104 | 0.176 | 0.536 | 0.976 | 1.496 | 2.096 | 2.776 | 3.536 |
| 0.685 | -0.463 | -0.423 | -0.303 | -0.103 | 0.177 | 0.537 | 0.977 | 1.497 | 2.097 | 2.777 | 3.537 |
| 0.686 | -0.462 | -0.422 | -0.302 | -0.102 | 0.178 | 0.538 | 0.978 | 1.498 | 2.098 | 2.778 | 3.538 |
| 0.687 | -0.461 | -0.421 | -0.301 | -0.101 | 0.179 | 0.539 | 0.979 | 1.499 | 2.099 | 2.779 | 3.539 |
| 0.688 | -0.46 | -0.42 | -0.3 | -0.1 | 0.18 | 0.54 | 0.98 | 1.5 | 2.1 | 2.78 | 3.54 |
| 0.689 | -0.459 | -0.419 | -0.299 | -0.099 | 0.181 | 0.541 | 0.981 | 1.501 | 2.101 | 2.781 | 3.541 |
| 0.69 | -0.458 | -0.418 | -0.298 | -0.098 | 0.182 | 0.542 | 0.982 | 1.502 | 2.102 | 2.782 | 3.542 |
| 0.691 | -0.457 | -0.417 | -0.297 | -0.097 | 0.183 | 0.543 | 0.983 | 1.503 | 2.103 | 2.783 | 3.543 |
| 0.692 | -0.455 | -0.415 | -0.295 | -0.095 | 0.185 | 0.545 | 0.985 | 1.505 | 2.105 | 2.785 | 3.545 |
| 0.693 | -0.454 | -0.414 | -0.294 | -0.094 | 0.186 | 0.546 | 0.986 | 1.506 | 2.106 | 2.786 | 3.546 |
| 0.694 | -0.453 | -0.413 | -0.293 | -0.093 | 0.187 | 0.547 | 0.987 | 1.507 | 2.107 | 2.787 | 3.547 |
| 0.695 | -0.452 | -0.412 | -0.292 | -0.092 | 0.188 | 0.548 | 0.988 | 1.508 | 2.108 | 2.788 | 3.548 |
| 0.696 | -0.451 | -0.411 | -0.291 | -0.091 | 0.189 | 0.549 | 0.989 | 1.509 | 2.109 | 2.789 | 3.549 |
| 0.697 | -0.45 | -0.41 | -0.29 | -0.09 | 0.19 | 0.55 | 0.99 | 1.51 | 2.11 | 2.79 | 3.55 |
| 0.698 | -0.449 | -0.409 | -0.289 | -0.089 | 0.191 | 0.551 | 0.991 | 1.511 | 2.111 | 2.791 | 3.551 |
| 0.699 | -0.448 | -0.408 | -0.288 | -0.088 | 0.192 | 0.552 | 0.992 | 1.512 | 2.112 | 2.792 | 3.552 |
| 0.7 | -0.447 | -0.407 | -0.287 | -0.087 | 0.193 | 0.553 | 0.993 | 1.513 | 2.113 | 2.793 | 3.553 |
| 0.701 | -0.446 | -0.406 | -0.286 | -0.086 | 0.194 | 0.554 | 0.994 | 1.514 | 2.114 | 2.794 | 3.554 |
| 0.702 | -0.445 | -0.405 | -0.285 | -0.085 | 0.195 | 0.555 | 0.995 | 1.515 | 2.115 | 2.795 | 3.555 |
| 0.703 | -0.444 | -0.404 | -0.284 | -0.084 | 0.196 | 0.556 | 0.996 | 1.516 | 2.116 | 2.796 | 3.556 |
| 0.704 | -0.443 | -0.403 | -0.283 | -0.083 | 0.197 | 0.557 | 0.997 | 1.517 | 2.117 | 2.797 | 3.557 |
| 0.705 | -0.442 | -0.402 | -0.282 | -0.082 | 0.198 | 0.558 | 0.998 | 1.518 | 2.118 | 2.798 | 3.558 |
| 0.706 | -0.441 | -0.401 | -0.281 | -0.081 | 0.199 | 0.559 | 0.999 | 1.519 | 2.119 | 2.799 | 3.559 |
| 0.707 | -0.439 | -0.399 | -0.279 | -0.079 | 0.201 | 0.561 | 1.001 | 1.521 | 2.121 | 2.801 | 3.561 |
| 0.708 | -0.438 | -0.398 | -0.278 | -0.078 | 0.202 | 0.562 | 1.002 | 1.522 | 2.122 | 2.802 | 3.562 |
| 0.709 | -0.437 | -0.397 | -0.277 | -0.077 | 0.203 | 0.563 | 1.003 | 1.523 | 2.123 | 2.803 | 3.563 |
| 0.71 | -0.436 | -0.396 | -0.276 | -0.076 | 0.204 | 0.564 | 1.004 | 1.524 | 2.124 | 2.804 | 3.564 |
| 0.711 | -0.435 | -0.395 | -0.275 | -0.075 | 0.205 | 0.565 | 1.005 | 1.525 | 2.125 | 2.805 | 3.565 |
| 0.712 | -0.434 | -0.394 | -0.274 | -0.074 | 0.206 | 0.566 | 1.006 | 1.526 | 2.126 | 2.806 | 3.566 |
| 0.713 | -0.433 | -0.393 | -0.273 | -0.073 | 0.207 | 0.567 | 1.007 | 1.527 | 2.127 | 2.807 | 3.567 |
| 0.714 | -0.432 | -0.392 | -0.272 | -0.072 | 0.208 | 0.568 | 1.008 | 1.528 | 2.128 | 2.808 | 3.568 |
| 0.715 | -0.431 | -0.391 | -0.271 | -0.071 | 0.209 | 0.569 | 1.009 | 1.529 | 2.129 | 2.809 | 3.569 |
| 0.716 | -0.43 | -0.39 | -0.27 | -0.07 | 0.21 | 0.57 | 1.01 | 1.53 | 2.13 | 2.81 | 3.57 |
| 0.717 | -0.428 | -0.388 | -0.268 | -0.068 | 0.212 | 0.572 | 1.012 | 1.532 | 2.132 | 2.812 | 3.572 |
| 0.718 | -0.427 | -0.387 | -0.267 | -0.067 | 0.213 | 0.573 | 1.013 | 1.533 | 2.133 | 2.813 | 3.573 |
| 0.719 | -0.426 | -0.386 | -0.266 | -0.066 | 0.214 | 0.574 | 1.014 | 1.534 | 2.134 | 2.814 | 3.574 |
| 0.72 | -0.425 | -0.385 | -0.265 | -0.065 | 0.215 | 0.575 | 1.015 | 1.535 | 2.135 | 2.815 | 3.575 |
| 0.721 | -0.424 | -0.384 | -0.264 | -0.064 | 0.216 | 0.576 | 1.016 | 1.536 | 2.136 | 2.816 | 3.576 |
| 0.722 | -0.423 | -0.383 | -0.263 | -0.063 | 0.217 | 0.577 | 1.017 | 1.537 | 2.137 | 2.817 | 3.577 |
| 0.723 | -0.422 | -0.382 | -0.262 | -0.062 | 0.218 | 0.578 | 1.018 | 1.538 | 2.138 | 2.818 | 3.578 |
| 0.724 | -0.421 | -0.381 | -0.261 | -0.061 | 0.219 | 0.579 | 1.019 | 1.539 | 2.139 | 2.819 | 3.579 |
| 0.725 | -0.42 | -0.38 | -0.26 | -0.06 | 0.22 | 0.58 | 1.02 | 1.54 | 2.14 | 2.82 | 3.58 |
| 0.726 | -0.418 | -0.378 | -0.258 | -0.058 | 0.222 | 0.582 | 1.022 | 1.542 | 2.142 | 2.822 | 3.582 |
| 0.727 | -0.417 | -0.377 | -0.257 | -0.057 | 0.223 | 0.583 | 1.023 | 1.543 | 2.143 | 2.823 | 3.583 |
| 0.728 | -0.416 | -0.376 | -0.256 | -0.056 | 0.224 | 0.584 | 1.024 | 1.544 | 2.144 | 2.824 | 3.584 |
| 0.729 | -0.415 | -0.375 | -0.255 | -0.055 | 0.225 | 0.585 | 1.025 | 1.545 | 2.145 | 2.825 | 3.585 |
| 0.73 | -0.414 | -0.374 | -0.254 | -0.054 | 0.226 | 0.586 | 1.026 | 1.546 | 2.146 | 2.826 | 3.586 |
| 0.731 | -0.413 | -0.373 | -0.253 | -0.053 | 0.227 | 0.587 | 1.027 | 1.547 | 2.147 | 2.827 | 3.587 |
| 0.732 | -0.412 | -0.372 | -0.252 | -0.052 | 0.228 | 0.588 | 1.028 | 1.548 | 2.148 | 2.828 | 3.588 |
| 0.733 | -0.41 | -0.37 | -0.25 | -0.05 | 0.23 | 0.59 | 1.03 | 1.55 | 2.15 | 2.83 | 3.59 |
| 0.734 | -0.409 | -0.369 | -0.249 | -0.049 | 0.231 | 0.591 | 1.031 | 1.551 | 2.151 | 2.831 | 3.591 |
| 0.735 | -0.408 | -0.368 | -0.248 | -0.048 | 0.232 | 0.592 | 1.032 | 1.552 | 2.152 | 2.832 | 3.592 |
| 0.736 | -0.407 | -0.367 | -0.247 | -0.047 | 0.233 | 0.593 | 1.033 | 1.553 | 2.153 | 2.833 | 3.593 |
| 0.737 | -0.406 | -0.366 | -0.246 | -0.046 | 0.234 | 0.594 | 1.034 | 1.554 | 2.154 | 2.834 | 3.594 |
| 0.738 | -0.405 | -0.365 | -0.245 | -0.045 | 0.235 | 0.595 | 1.035 | 1.555 | 2.155 | 2.835 | 3.595 |
| 0.739 | -0.404 | -0.364 | -0.244 | -0.044 | 0.236 | 0.596 | 1.036 | 1.556 | 2.156 | 2.836 | 3.596 |
| 0.74 | -0.402 | -0.362 | -0.242 | -0.042 | 0.238 | 0.598 | 1.038 | 1.558 | 2.158 | 2.838 | 3.598 |
| 0.741 | -0.401 | -0.361 | -0.241 | -0.041 | 0.239 | 0.599 | 1.039 | 1.559 | 2.159 | 2.839 | 3.599 |
| 0.742 | -0.4 | -0.36 | -0.24 | -0.04 | 0.24 | 0.6 | 1.04 | 1.56 | 2.16 | 2.84 | 3.6 |
| 0.743 | -0.399 | -0.359 | -0.239 | -0.039 | 0.241 | 0.601 | 1.041 | 1.561 | 2.161 | 2.841 | 3.601 |
| 0.744 | -0.398 | -0.358 | -0.238 | -0.038 | 0.242 | 0.602 | 1.042 | 1.562 | 2.162 | 2.842 | 3.602 |
| 0.745 | -0.397 | -0.357 | -0.237 | -0.037 | 0.243 | 0.603 | 1.043 | 1.563 | 2.163 | 2.843 | 3.603 |
| 0.746 | -0.395 | -0.355 | -0.235 | -0.035 | 0.245 | 0.605 | 1.045 | 1.565 | 2.165 | 2.845 | 3.605 |
| 0.747 | -0.394 | -0.354 | -0.234 | -0.034 | 0.246 | 0.606 | 1.046 | 1.566 | 2.166 | 2.846 | 3.606 |
| 0.748 | -0.393 | -0.353 | -0.233 | -0.033 | 0.247 | 0.607 | 1.047 | 1.567 | 2.167 | 2.847 | 3.607 |
| 0.749 | -0.392 | -0.352 | -0.232 | -0.032 | 0.248 | 0.608 | 1.048 | 1.568 | 2.168 | 2.848 | 3.608 |
| 0.75 | -0.391 | -0.351 | -0.231 | -0.031 | 0.249 | 0.609 | 1.049 | 1.569 | 2.169 | 2.849 | 3.609 |
| 0.751 | -0.389 | -0.349 | -0.229 | -0.029 | 0.251 | 0.611 | 1.051 | 1.571 | 2.171 | 2.851 | 3.611 |
| 0.752 | -0.388 | -0.348 | -0.228 | -0.028 | 0.252 | 0.612 | 1.052 | 1.572 | 2.172 | 2.852 | 3.612 |
| 0.753 | -0.387 | -0.347 | -0.227 | -0.027 | 0.253 | 0.613 | 1.053 | 1.573 | 2.173 | 2.853 | 3.613 |
| 0.754 | -0.386 | -0.346 | -0.226 | -0.026 | 0.254 | 0.614 | 1.054 | 1.574 | 2.174 | 2.854 | 3.614 |
| 0.755 | -0.385 | -0.345 | -0.225 | -0.025 | 0.255 | 0.615 | 1.055 | 1.575 | 2.175 | 2.855 | 3.615 |
| 0.756 | -0.383 | -0.343 | -0.223 | -0.023 | 0.257 | 0.617 | 1.057 | 1.577 | 2.177 | 2.857 | 3.617 |
| 0.757 | -0.382 | -0.342 | -0.222 | -0.022 | 0.258 | 0.618 | 1.058 | 1.578 | 2.178 | 2.858 | 3.618 |
| 0.758 | -0.381 | -0.341 | -0.221 | -0.021 | 0.259 | 0.619 | 1.059 | 1.579 | 2.179 | 2.859 | 3.619 |
| 0.759 | -0.38 | -0.34 | -0.22 | -0.02 | 0.26 | 0.62 | 1.06 | 1.58 | 2.18 | 2.86 | 3.62 |
| 0.76 | -0.379 | -0.339 | -0.219 | -0.019 | 0.261 | 0.621 | 1.061 | 1.581 | 2.181 | 2.861 | 3.621 |
| 0.761 | -0.377 | -0.337 | -0.217 | -0.017 | 0.263 | 0.623 | 1.063 | 1.583 | 2.183 | 2.863 | 3.623 |
| 0.762 | -0.376 | -0.336 | -0.216 | -0.016 | 0.264 | 0.624 | 1.064 | 1.584 | 2.184 | 2.864 | 3.624 |
| 0.763 | -0.375 | -0.335 | -0.215 | -0.015 | 0.265 | 0.625 | 1.065 | 1.585 | 2.185 | 2.865 | 3.625 |
| 0.764 | -0.374 | -0.334 | -0.214 | -0.014 | 0.266 | 0.626 | 1.066 | 1.586 | 2.186 | 2.866 | 3.626 |
| 0.765 | -0.373 | -0.333 | -0.213 | -0.013 | 0.267 | 0.627 | 1.067 | 1.587 | 2.187 | 2.867 | 3.627 |
| 0.766 | -0.371 | -0.331 | -0.211 | -0.011 | 0.269 | 0.629 | 1.069 | 1.589 | 2.189 | 2.869 | 3.629 |
| 0.767 | -0.37 | -0.33 | -0.21 | -0.01 | 0.27 | 0.63 | 1.07 | 1.59 | 2.19 | 2.87 | 3.63 |
| 0.768 | -0.369 | -0.329 | -0.209 | -0.009 | 0.271 | 0.631 | 1.071 | 1.591 | 2.191 | 2.871 | 3.631 |
| 0.769 | -0.368 | -0.328 | -0.208 | -0.008 | 0.272 | 0.632 | 1.072 | 1.592 | 2.192 | 2.872 | 3.632 |
| 0.77 | -0.366 | -0.326 | -0.206 | -0.006 | 0.274 | 0.634 | 1.074 | 1.594 | 2.194 | 2.874 | 3.634 |
| 0.771000000000001 | -0.365 | -0.325 | -0.205 | -0.005 | 0.275 | 0.635 | 1.075 | 1.595 | 2.195 | 2.875 | 3.635 |
| 0.772000000000001 | -0.364 | -0.324 | -0.204 | -0.004 | 0.276 | 0.636 | 1.076 | 1.596 | 2.196 | 2.876 | 3.636 |
| 0.773000000000001 | -0.363 | -0.323 | -0.203 | -0.003 | 0.277 | 0.637 | 1.077 | 1.597 | 2.197 | 2.877 | 3.637 |
| 0.774000000000001 | -0.361 | -0.321 | -0.201 | -0.001 | 0.279 | 0.639 | 1.079 | 1.599 | 2.199 | 2.879 | 3.639 |
| 0.775000000000001 | -0.36 | -0.32 | -0.2 | 0 | 0.28 | 0.64 | 1.08 | 1.6 | 2.2 | 2.88 | 3.64 |
| 0.776000000000001 | -0.359 | -0.319 | -0.199 | 0.001 | 0.281 | 0.641 | 1.081 | 1.601 | 2.201 | 2.881 | 3.641 |
| 0.777000000000001 | -0.358 | -0.318 | -0.198 | 0.002 | 0.282 | 0.642 | 1.082 | 1.602 | 2.202 | 2.882 | 3.642 |
| 0.778000000000001 | -0.356 | -0.316 | -0.196 | 0.004 | 0.284 | 0.644 | 1.084 | 1.604 | 2.204 | 2.884 | 3.644 |
| 0.779000000000001 | -0.355 | -0.315 | -0.195 | 0.005 | 0.285 | 0.645 | 1.085 | 1.605 | 2.205 | 2.885 | 3.645 |
| 0.78 | -0.354 | -0.314 | -0.194 | 0.006 | 0.286 | 0.646 | 1.086 | 1.606 | 2.206 | 2.886 | 3.646 |
| 0.781000000000001 | -0.353 | -0.313 | -0.193 | 0.007 | 0.287 | 0.647 | 1.087 | 1.607 | 2.207 | 2.887 | 3.647 |
| 0.782000000000001 | -0.351 | -0.311 | -0.191 | 0.009 | 0.289 | 0.649 | 1.089 | 1.609 | 2.209 | 2.889 | 3.649 |
| 0.783000000000001 | -0.35 | -0.31 | -0.19 | 0.01 | 0.29 | 0.65 | 1.09 | 1.61 | 2.21 | 2.89 | 3.65 |
| 0.784000000000001 | -0.349 | -0.309 | -0.189 | 0.011 | 0.291 | 0.651 | 1.091 | 1.611 | 2.211 | 2.891 | 3.651 |
| 0.785000000000001 | -0.347 | -0.307 | -0.187 | 0.013 | 0.293 | 0.653 | 1.093 | 1.613 | 2.213 | 2.893 | 3.653 |
| 0.786000000000001 | -0.346 | -0.306 | -0.186 | 0.014 | 0.294 | 0.654 | 1.094 | 1.614 | 2.214 | 2.894 | 3.654 |
| 0.787000000000001 | -0.345 | -0.305 | -0.185 | 0.015 | 0.295 | 0.655 | 1.095 | 1.615 | 2.215 | 2.895 | 3.655 |
| 0.788000000000001 | -0.344 | -0.304 | -0.184 | 0.016 | 0.296 | 0.656 | 1.096 | 1.616 | 2.216 | 2.896 | 3.656 |
| 0.789000000000001 | -0.342 | -0.302 | -0.182 | 0.018 | 0.298 | 0.658 | 1.098 | 1.618 | 2.218 | 2.898 | 3.658 |
| 0.79 | -0.341 | -0.301 | -0.181 | 0.019 | 0.299 | 0.659 | 1.099 | 1.619 | 2.219 | 2.899 | 3.659 |
| 0.791000000000001 | -0.34 | -0.3 | -0.18 | 0.02 | 0.3 | 0.66 | 1.1 | 1.62 | 2.22 | 2.9 | 3.66 |
| 0.792000000000001 | -0.338 | -0.298 | -0.178 | 0.022 | 0.302 | 0.662 | 1.102 | 1.622 | 2.222 | 2.902 | 3.662 |
| 0.793000000000001 | -0.337 | -0.297 | -0.177 | 0.023 | 0.303 | 0.663 | 1.103 | 1.623 | 2.223 | 2.903 | 3.663 |
| 0.794000000000001 | -0.336 | -0.296 | -0.176 | 0.024 | 0.304 | 0.664 | 1.104 | 1.624 | 2.224 | 2.904 | 3.664 |
| 0.795000000000001 | -0.335 | -0.295 | -0.175 | 0.025 | 0.305 | 0.665 | 1.105 | 1.625 | 2.225 | 2.905 | 3.665 |
| 0.796000000000001 | -0.333 | -0.293 | -0.173 | 0.027 | 0.307 | 0.667 | 1.107 | 1.627 | 2.227 | 2.907 | 3.667 |
| 0.797000000000001 | -0.332 | -0.292 | -0.172 | 0.028 | 0.308 | 0.668 | 1.108 | 1.628 | 2.228 | 2.908 | 3.668 |
| 0.798000000000001 | -0.331 | -0.291 | -0.171 | 0.029 | 0.309 | 0.669 | 1.109 | 1.629 | 2.229 | 2.909 | 3.669 |
| 0.799000000000001 | -0.329 | -0.289 | -0.169 | 0.031 | 0.311 | 0.671 | 1.111 | 1.631 | 2.231 | 2.911 | 3.671 |
| 0.800000000000001 | -0.328 | -0.288 | -0.168 | 0.032 | 0.312 | 0.672 | 1.112 | 1.632 | 2.232 | 2.912 | 3.672 |
| 0.801000000000001 | -0.327 | -0.287 | -0.167 | 0.033 | 0.313 | 0.673 | 1.113 | 1.633 | 2.233 | 2.913 | 3.673 |
| 0.802000000000001 | -0.325 | -0.285 | -0.165 | 0.035 | 0.315 | 0.675 | 1.115 | 1.635 | 2.235 | 2.915 | 3.675 |
| 0.803000000000001 | -0.324 | -0.284 | -0.164 | 0.036 | 0.316 | 0.676 | 1.116 | 1.636 | 2.236 | 2.916 | 3.676 |
| 0.804000000000001 | -0.323 | -0.283 | -0.163 | 0.037 | 0.317 | 0.677 | 1.117 | 1.637 | 2.237 | 2.917 | 3.677 |
| 0.805000000000001 | -0.321 | -0.281 | -0.161 | 0.039 | 0.319 | 0.679 | 1.119 | 1.639 | 2.239 | 2.919 | 3.679 |
| 0.806000000000001 | -0.32 | -0.28 | -0.16 | 0.04 | 0.32 | 0.68 | 1.12 | 1.64 | 2.24 | 2.92 | 3.68 |
| 0.807000000000001 | -0.319 | -0.279 | -0.159 | 0.041 | 0.321 | 0.681 | 1.121 | 1.641 | 2.241 | 2.921 | 3.681 |
| 0.808000000000001 | -0.317 | -0.277 | -0.157 | 0.043 | 0.323 | 0.683 | 1.123 | 1.643 | 2.243 | 2.923 | 3.683 |
| 0.809000000000001 | -0.316 | -0.276 | -0.156 | 0.044 | 0.324 | 0.684 | 1.124 | 1.644 | 2.244 | 2.924 | 3.684 |
| 0.810000000000001 | -0.315 | -0.275 | -0.155 | 0.045 | 0.325 | 0.685 | 1.125 | 1.645 | 2.245 | 2.925 | 3.685 |
| 0.811000000000001 | -0.313 | -0.273 | -0.153 | 0.047 | 0.327 | 0.687 | 1.127 | 1.647 | 2.247 | 2.927 | 3.687 |
| 0.812000000000001 | -0.312 | -0.272 | -0.152 | 0.048 | 0.328 | 0.688 | 1.128 | 1.648 | 2.248 | 2.928 | 3.688 |
| 0.813000000000001 | -0.311 | -0.271 | -0.151 | 0.049 | 0.329 | 0.689 | 1.129 | 1.649 | 2.249 | 2.929 | 3.689 |
| 0.814000000000001 | -0.309 | -0.269 | -0.149 | 0.051 | 0.331 | 0.691 | 1.131 | 1.651 | 2.251 | 2.931 | 3.691 |
| 0.815000000000001 | -0.308 | -0.268 | -0.148 | 0.052 | 0.332 | 0.692 | 1.132 | 1.652 | 2.252 | 2.932 | 3.692 |
| 0.816000000000001 | -0.307 | -0.267 | -0.147 | 0.053 | 0.333 | 0.693 | 1.133 | 1.653 | 2.253 | 2.933 | 3.693 |
| 0.817000000000001 | -0.305 | -0.265 | -0.145 | 0.055 | 0.335 | 0.695 | 1.135 | 1.655 | 2.255 | 2.935 | 3.695 |
| 0.818000000000001 | -0.304 | -0.264 | -0.144 | 0.056 | 0.336 | 0.696 | 1.136 | 1.656 | 2.256 | 2.936 | 3.696 |
| 0.819000000000001 | -0.302 | -0.262 | -0.142 | 0.058 | 0.338 | 0.698 | 1.138 | 1.658 | 2.258 | 2.938 | 3.698 |
| 0.820000000000001 | -0.301 | -0.261 | -0.141 | 0.059 | 0.339 | 0.699 | 1.139 | 1.659 | 2.259 | 2.939 | 3.699 |
| 0.821000000000001 | -0.3 | -0.26 | -0.14 | 0.06 | 0.34 | 0.7 | 1.14 | 1.66 | 2.26 | 2.94 | 3.7 |
| 0.822000000000001 | -0.298 | -0.258 | -0.138 | 0.062 | 0.342 | 0.702 | 1.142 | 1.662 | 2.262 | 2.942 | 3.702 |
| 0.823000000000001 | -0.297 | -0.257 | -0.137 | 0.063 | 0.343 | 0.703 | 1.143 | 1.663 | 2.263 | 2.943 | 3.703 |
| 0.824000000000001 | -0.295 | -0.255 | -0.135 | 0.065 | 0.345 | 0.705 | 1.145 | 1.665 | 2.265 | 2.945 | 3.705 |
| 0.825000000000001 | -0.294 | -0.254 | -0.134 | 0.066 | 0.346 | 0.706 | 1.146 | 1.666 | 2.266 | 2.946 | 3.706 |
| 0.826000000000001 | -0.293 | -0.253 | -0.133 | 0.067 | 0.347 | 0.707 | 1.147 | 1.667 | 2.267 | 2.947 | 3.707 |
| 0.827000000000001 | -0.291 | -0.251 | -0.131 | 0.069 | 0.349 | 0.709 | 1.149 | 1.669 | 2.269 | 2.949 | 3.709 |
| 0.828000000000001 | -0.29 | -0.25 | -0.13 | 0.07 | 0.35 | 0.71 | 1.15 | 1.67 | 2.27 | 2.95 | 3.71 |
| 0.829000000000001 | -0.289 | -0.249 | -0.129 | 0.071 | 0.351 | 0.711 | 1.151 | 1.671 | 2.271 | 2.951 | 3.711 |
| 0.830000000000001 | -0.287 | -0.247 | -0.127 | 0.073 | 0.353 | 0.713 | 1.153 | 1.673 | 2.273 | 2.953 | 3.713 |
| 0.831000000000001 | -0.286 | -0.246 | -0.126 | 0.074 | 0.354 | 0.714 | 1.154 | 1.674 | 2.274 | 2.954 | 3.714 |
| 0.832000000000001 | -0.284 | -0.244 | -0.124 | 0.076 | 0.356 | 0.716 | 1.156 | 1.676 | 2.276 | 2.956 | 3.716 |
| 0.833000000000001 | -0.283 | -0.243 | -0.123 | 0.077 | 0.357 | 0.717 | 1.157 | 1.677 | 2.277 | 2.957 | 3.717 |
| 0.834000000000001 | -0.281 | -0.241 | -0.121 | 0.079 | 0.359 | 0.719 | 1.159 | 1.679 | 2.279 | 2.959 | 3.719 |
| 0.835000000000001 | -0.28 | -0.24 | -0.12 | 0.08 | 0.36 | 0.72 | 1.16 | 1.68 | 2.28 | 2.96 | 3.72 |
| 0.836000000000001 | -0.279 | -0.239 | -0.119 | 0.081 | 0.361 | 0.721 | 1.161 | 1.681 | 2.281 | 2.961 | 3.721 |
| 0.837000000000001 | -0.277 | -0.237 | -0.117 | 0.083 | 0.363 | 0.723 | 1.163 | 1.683 | 2.283 | 2.963 | 3.723 |
| 0.838000000000001 | -0.276 | -0.236 | -0.116 | 0.084 | 0.364 | 0.724 | 1.164 | 1.684 | 2.284 | 2.964 | 3.724 |
| 0.839000000000001 | -0.274 | -0.234 | -0.114 | 0.086 | 0.366 | 0.726 | 1.166 | 1.686 | 2.286 | 2.966 | 3.726 |
| 0.840000000000001 | -0.273 | -0.233 | -0.113 | 0.087 | 0.367 | 0.727 | 1.167 | 1.687 | 2.287 | 2.967 | 3.727 |
| 0.841000000000001 | -0.271 | -0.231 | -0.111 | 0.089 | 0.369 | 0.729 | 1.169 | 1.689 | 2.289 | 2.969 | 3.729 |
| 0.842000000000001 | -0.27 | -0.23 | -0.11 | 0.09 | 0.37 | 0.73 | 1.17 | 1.69 | 2.29 | 2.97 | 3.73 |
| 0.843000000000001 | -0.269 | -0.229 | -0.109 | 0.091 | 0.371 | 0.731 | 1.171 | 1.691 | 2.291 | 2.971 | 3.731 |
| 0.844000000000001 | -0.267 | -0.227 | -0.107 | 0.093 | 0.373 | 0.733 | 1.173 | 1.693 | 2.293 | 2.973 | 3.733 |
| 0.845000000000001 | -0.266 | -0.226 | -0.106 | 0.094 | 0.374 | 0.734 | 1.174 | 1.694 | 2.294 | 2.974 | 3.734 |
| 0.846000000000001 | -0.264 | -0.224 | -0.104 | 0.096 | 0.376 | 0.736 | 1.176 | 1.696 | 2.296 | 2.976 | 3.736 |
| 0.847000000000001 | -0.263 | -0.223 | -0.103 | 0.097 | 0.377 | 0.737 | 1.177 | 1.697 | 2.297 | 2.977 | 3.737 |
| 0.848000000000001 | -0.261 | -0.221 | -0.101 | 0.099 | 0.379 | 0.739 | 1.179 | 1.699 | 2.299 | 2.979 | 3.739 |
| 0.849000000000001 | -0.26 | -0.22 | -0.1 | 0.1 | 0.38 | 0.74 | 1.18 | 1.7 | 2.3 | 2.98 | 3.74 |
| 0.850000000000001 | -0.258 | -0.218 | -0.098 | 0.102 | 0.382 | 0.742 | 1.182 | 1.702 | 2.302 | 2.982 | 3.742 |
| 0.851000000000001 | -0.257 | -0.217 | -0.097 | 0.103 | 0.383 | 0.743 | 1.183 | 1.703 | 2.303 | 2.983 | 3.743 |
| 0.852000000000001 | -0.255 | -0.215 | -0.095 | 0.105 | 0.385 | 0.745 | 1.185 | 1.705 | 2.305 | 2.985 | 3.745 |
| 0.853000000000001 | -0.254 | -0.214 | -0.094 | 0.106 | 0.386 | 0.746 | 1.186 | 1.706 | 2.306 | 2.986 | 3.746 |
| 0.854000000000001 | -0.252 | -0.212 | -0.092 | 0.108 | 0.388 | 0.748 | 1.188 | 1.708 | 2.308 | 2.988 | 3.748 |
| 0.855000000000001 | -0.251 | -0.211 | -0.091 | 0.109 | 0.389 | 0.749 | 1.189 | 1.709 | 2.309 | 2.989 | 3.749 |
| 0.856000000000001 | -0.25 | -0.21 | -0.09 | 0.11 | 0.39 | 0.75 | 1.19 | 1.71 | 2.31 | 2.99 | 3.75 |
| 0.857000000000001 | -0.248 | -0.208 | -0.088 | 0.112 | 0.392 | 0.752 | 1.192 | 1.712 | 2.312 | 2.992 | 3.752 |
| 0.858000000000001 | -0.247 | -0.207 | -0.087 | 0.113 | 0.393 | 0.753 | 1.193 | 1.713 | 2.313 | 2.993 | 3.753 |
| 0.859000000000001 | -0.245 | -0.205 | -0.085 | 0.115 | 0.395 | 0.755 | 1.195 | 1.715 | 2.315 | 2.995 | 3.755 |
| 0.860000000000001 | -0.244 | -0.204 | -0.084 | 0.116 | 0.396 | 0.756 | 1.196 | 1.716 | 2.316 | 2.996 | 3.756 |
| 0.861000000000001 | -0.242 | -0.202 | -0.082 | 0.118 | 0.398 | 0.758 | 1.198 | 1.718 | 2.318 | 2.998 | 3.758 |
| 0.862000000000001 | -0.241 | -0.201 | -0.081 | 0.119 | 0.399 | 0.759 | 1.199 | 1.719 | 2.319 | 2.999 | 3.759 |
| 0.863000000000001 | -0.239 | -0.199 | -0.079 | 0.121 | 0.401 | 0.761 | 1.201 | 1.721 | 2.321 | 3.001 | 3.761 |
| 0.864000000000001 | -0.238 | -0.198 | -0.078 | 0.122 | 0.402 | 0.762 | 1.202 | 1.722 | 2.322 | 3.002 | 3.762 |
| 0.865000000000001 | -0.236 | -0.196 | -0.076 | 0.124 | 0.404 | 0.764 | 1.204 | 1.724 | 2.324 | 3.004 | 3.764 |
| 0.866000000000001 | -0.234 | -0.194 | -0.074 | 0.126 | 0.406 | 0.766 | 1.206 | 1.726 | 2.326 | 3.006 | 3.766 |
| 0.867000000000001 | -0.233 | -0.193 | -0.073 | 0.127 | 0.407 | 0.767 | 1.207 | 1.727 | 2.327 | 3.007 | 3.767 |
| 0.868000000000001 | -0.231 | -0.191 | -0.071 | 0.129 | 0.409 | 0.769 | 1.209 | 1.729 | 2.329 | 3.009 | 3.769 |
| 0.869000000000001 | -0.23 | -0.19 | -0.07 | 0.13 | 0.41 | 0.77 | 1.21 | 1.73 | 2.33 | 3.01 | 3.77 |
| 0.870000000000001 | -0.228 | -0.188 | -0.068 | 0.132 | 0.412 | 0.772 | 1.212 | 1.732 | 2.332 | 3.012 | 3.772 |
| 0.871000000000001 | -0.227 | -0.187 | -0.067 | 0.133 | 0.413 | 0.773 | 1.213 | 1.733 | 2.333 | 3.013 | 3.773 |
| 0.872000000000001 | -0.225 | -0.185 | -0.065 | 0.135 | 0.415 | 0.775 | 1.215 | 1.735 | 2.335 | 3.015 | 3.775 |
| 0.873000000000001 | -0.224 | -0.184 | -0.064 | 0.136 | 0.416 | 0.776 | 1.216 | 1.736 | 2.336 | 3.016 | 3.776 |
| 0.874000000000001 | -0.222 | -0.182 | -0.062 | 0.138 | 0.418 | 0.778 | 1.218 | 1.738 | 2.338 | 3.018 | 3.778 |
| 0.875000000000001 | -0.221 | -0.181 | -0.061 | 0.139 | 0.419 | 0.779 | 1.219 | 1.739 | 2.339 | 3.019 | 3.779 |
| 0.876000000000001 | -0.219 | -0.179 | -0.059 | 0.141 | 0.421 | 0.781 | 1.221 | 1.741 | 2.341 | 3.021 | 3.781 |
| 0.877000000000001 | -0.218 | -0.178 | -0.058 | 0.142 | 0.422 | 0.782 | 1.222 | 1.742 | 2.342 | 3.022 | 3.782 |
| 0.878000000000001 | -0.216 | -0.176 | -0.056 | 0.144 | 0.424 | 0.784 | 1.224 | 1.744 | 2.344 | 3.024 | 3.784 |
| 0.879000000000001 | -0.214 | -0.174 | -0.054 | 0.146 | 0.426 | 0.786 | 1.226 | 1.746 | 2.346 | 3.026 | 3.786 |
| 0.880000000000001 | -0.213 | -0.173 | -0.053 | 0.147 | 0.427 | 0.787 | 1.227 | 1.747 | 2.347 | 3.027 | 3.787 |
| 0.881000000000001 | -0.211 | -0.171 | -0.051 | 0.149 | 0.429 | 0.789 | 1.229 | 1.749 | 2.349 | 3.029 | 3.789 |
| 0.882000000000001 | -0.21 | -0.17 | -0.05 | 0.15 | 0.43 | 0.79 | 1.23 | 1.75 | 2.35 | 3.03 | 3.79 |
| 0.883000000000001 | -0.208 | -0.168 | -0.048 | 0.152 | 0.432 | 0.792 | 1.232 | 1.752 | 2.352 | 3.032 | 3.792 |
| 0.884000000000001 | -0.207 | -0.167 | -0.047 | 0.153 | 0.433 | 0.793 | 1.233 | 1.753 | 2.353 | 3.033 | 3.793 |
| 0.885000000000001 | -0.205 | -0.165 | -0.045 | 0.155 | 0.435 | 0.795 | 1.235 | 1.755 | 2.355 | 3.035 | 3.795 |
| 0.886000000000001 | -0.203 | -0.163 | -0.043 | 0.157 | 0.437 | 0.797 | 1.237 | 1.757 | 2.357 | 3.037 | 3.797 |
| 0.887000000000001 | -0.202 | -0.162 | -0.042 | 0.158 | 0.438 | 0.798 | 1.238 | 1.758 | 2.358 | 3.038 | 3.798 |
| 0.888000000000001 | -0.2 | -0.16 | -0.04 | 0.16 | 0.44 | 0.8 | 1.24 | 1.76 | 2.36 | 3.04 | 3.8 |
| 0.889000000000001 | -0.199 | -0.159 | -0.039 | 0.161 | 0.441 | 0.801 | 1.241 | 1.761 | 2.361 | 3.041 | 3.801 |
| 0.890000000000001 | -0.197 | -0.157 | -0.037 | 0.163 | 0.443 | 0.803 | 1.243 | 1.763 | 2.363 | 3.043 | 3.803 |
| 0.891000000000001 | -0.196 | -0.156 | -0.036 | 0.164 | 0.444 | 0.804 | 1.244 | 1.764 | 2.364 | 3.044 | 3.804 |
| 0.892000000000001 | -0.194 | -0.154 | -0.034 | 0.166 | 0.446 | 0.806 | 1.246 | 1.766 | 2.366 | 3.046 | 3.806 |
| 0.893000000000001 | -0.192 | -0.152 | -0.032 | 0.168 | 0.448 | 0.808 | 1.248 | 1.768 | 2.368 | 3.048 | 3.808 |
| 0.894000000000001 | -0.191 | -0.151 | -0.031 | 0.169 | 0.449 | 0.809 | 1.249 | 1.769 | 2.369 | 3.049 | 3.809 |
| 0.895000000000001 | -0.189 | -0.149 | -0.029 | 0.171 | 0.451 | 0.811 | 1.251 | 1.771 | 2.371 | 3.051 | 3.811 |
| 0.896000000000001 | -0.187 | -0.147 | -0.027 | 0.173 | 0.453 | 0.813 | 1.253 | 1.773 | 2.373 | 3.053 | 3.813 |
| 0.897000000000001 | -0.186 | -0.146 | -0.026 | 0.174 | 0.454 | 0.814 | 1.254 | 1.774 | 2.374 | 3.054 | 3.814 |
| 0.898000000000001 | -0.184 | -0.144 | -0.024 | 0.176 | 0.456 | 0.816 | 1.256 | 1.776 | 2.376 | 3.056 | 3.816 |
| 0.899000000000001 | -0.183 | -0.143 | -0.023 | 0.177 | 0.457 | 0.817 | 1.257 | 1.777 | 2.377 | 3.057 | 3.817 |
| 0.900000000000001 | -0.181 | -0.141 | -0.021 | 0.179 | 0.459 | 0.819 | 1.259 | 1.779 | 2.379 | 3.059 | 3.819 |
| 0.901000000000001 | -0.179 | -0.139 | -0.019 | 0.181 | 0.461 | 0.821 | 1.261 | 1.781 | 2.381 | 3.061 | 3.821 |
| 0.902000000000001 | -0.178 | -0.138 | -0.018 | 0.182 | 0.462 | 0.822 | 1.262 | 1.782 | 2.382 | 3.062 | 3.822 |
| 0.903000000000001 | -0.176 | -0.136 | -0.016 | 0.184 | 0.464 | 0.824 | 1.264 | 1.784 | 2.384 | 3.064 | 3.824 |
| 0.904000000000001 | -0.174 | -0.134 | -0.014 | 0.186 | 0.466 | 0.826 | 1.266 | 1.786 | 2.386 | 3.066 | 3.826 |
| 0.905000000000001 | -0.173 | -0.133 | -0.013 | 0.187 | 0.467 | 0.827 | 1.267 | 1.787 | 2.387 | 3.067 | 3.827 |
| 0.906000000000001 | -0.171 | -0.131 | -0.011 | 0.189 | 0.469 | 0.829 | 1.269 | 1.789 | 2.389 | 3.069 | 3.829 |
| 0.907000000000001 | -0.17 | -0.13 | -0.01 | 0.19 | 0.47 | 0.83 | 1.27 | 1.79 | 2.39 | 3.07 | 3.83 |
| 0.908000000000001 | -0.168 | -0.128 | -0.008 | 0.192 | 0.472 | 0.832 | 1.272 | 1.792 | 2.392 | 3.072 | 3.832 |
| 0.909000000000001 | -0.166 | -0.126 | -0.006 | 0.194 | 0.474 | 0.834 | 1.274 | 1.794 | 2.394 | 3.074 | 3.834 |
| 0.910000000000001 | -0.165 | -0.125 | -0.005 | 0.195 | 0.475 | 0.835 | 1.275 | 1.795 | 2.395 | 3.075 | 3.835 |
| 0.911000000000001 | -0.163 | -0.123 | -0.003 | 0.197 | 0.477 | 0.837 | 1.277 | 1.797 | 2.397 | 3.077 | 3.837 |
| 0.912000000000001 | -0.161 | -0.121 | -0.001 | 0.199 | 0.479 | 0.839 | 1.279 | 1.799 | 2.399 | 3.079 | 3.839 |
| 0.913000000000001 | -0.16 | -0.12 | 0 | 0.2 | 0.48 | 0.84 | 1.28 | 1.8 | 2.4 | 3.08 | 3.84 |
| 0.914000000000001 | -0.158 | -0.118 | 0.002 | 0.202 | 0.482 | 0.842 | 1.282 | 1.802 | 2.402 | 3.082 | 3.842 |
| 0.915000000000001 | -0.156 | -0.116 | 0.004 | 0.204 | 0.484 | 0.844 | 1.284 | 1.804 | 2.404 | 3.084 | 3.844 |
| 0.916000000000001 | -0.154 | -0.114 | 0.006 | 0.206 | 0.486 | 0.846 | 1.286 | 1.806 | 2.406 | 3.086 | 3.846 |
| 0.917000000000001 | -0.153 | -0.113 | 0.007 | 0.207 | 0.487 | 0.847 | 1.287 | 1.807 | 2.407 | 3.087 | 3.847 |
| 0.918000000000001 | -0.151 | -0.111 | 0.009 | 0.209 | 0.489 | 0.849 | 1.289 | 1.809 | 2.409 | 3.089 | 3.849 |
| 0.919000000000001 | -0.149 | -0.109 | 0.011 | 0.211 | 0.491 | 0.851 | 1.291 | 1.811 | 2.411 | 3.091 | 3.851 |
| 0.920000000000001 | -0.148 | -0.108 | 0.012 | 0.212 | 0.492 | 0.852 | 1.292 | 1.812 | 2.412 | 3.092 | 3.852 |
| 0.921000000000001 | -0.146 | -0.106 | 0.014 | 0.214 | 0.494 | 0.854 | 1.294 | 1.814 | 2.414 | 3.094 | 3.854 |
| 0.922000000000001 | -0.144 | -0.104 | 0.016 | 0.216 | 0.496 | 0.856 | 1.296 | 1.816 | 2.416 | 3.096 | 3.856 |
| 0.923000000000001 | -0.143 | -0.103 | 0.017 | 0.217 | 0.497 | 0.857 | 1.297 | 1.817 | 2.417 | 3.097 | 3.857 |
| 0.924000000000001 | -0.141 | -0.101 | 0.019 | 0.219 | 0.499 | 0.859 | 1.299 | 1.819 | 2.419 | 3.099 | 3.859 |
| 0.925000000000001 | -0.139 | -0.099 | 0.021 | 0.221 | 0.501 | 0.861 | 1.301 | 1.821 | 2.421 | 3.101 | 3.861 |
| 0.926000000000001 | -0.137 | -0.097 | 0.023 | 0.223 | 0.503 | 0.863 | 1.303 | 1.823 | 2.423 | 3.103 | 3.863 |
| 0.927000000000001 | -0.136 | -0.096 | 0.024 | 0.224 | 0.504 | 0.864 | 1.304 | 1.824 | 2.424 | 3.104 | 3.864 |
| 0.928000000000001 | -0.134 | -0.094 | 0.026 | 0.226 | 0.506 | 0.866 | 1.306 | 1.826 | 2.426 | 3.106 | 3.866 |
| 0.929000000000001 | -0.132 | -0.092 | 0.028 | 0.228 | 0.508 | 0.868 | 1.308 | 1.828 | 2.428 | 3.108 | 3.868 |
| 0.930000000000001 | -0.131 | -0.091 | 0.029 | 0.229 | 0.509 | 0.869 | 1.309 | 1.829 | 2.429 | 3.109 | 3.869 |
| 0.931000000000001 | -0.129 | -0.089 | 0.031 | 0.231 | 0.511 | 0.871 | 1.311 | 1.831 | 2.431 | 3.111 | 3.871 |
| 0.932000000000001 | -0.127 | -0.087 | 0.033 | 0.233 | 0.513 | 0.873 | 1.313 | 1.833 | 2.433 | 3.113 | 3.873 |
| 0.933000000000001 | -0.125 | -0.085 | 0.035 | 0.235 | 0.515 | 0.875 | 1.315 | 1.835 | 2.435 | 3.115 | 3.875 |
| 0.934000000000001 | -0.124 | -0.084 | 0.036 | 0.236 | 0.516 | 0.876 | 1.316 | 1.836 | 2.436 | 3.116 | 3.876 |
| 0.935000000000001 | -0.122 | -0.082 | 0.038 | 0.238 | 0.518 | 0.878 | 1.318 | 1.838 | 2.438 | 3.118 | 3.878 |
| 0.936000000000001 | -0.12 | -0.08 | 0.04 | 0.24 | 0.52 | 0.88 | 1.32 | 1.84 | 2.44 | 3.12 | 3.88 |
| 0.937000000000001 | -0.118 | -0.078 | 0.042 | 0.242 | 0.522 | 0.882 | 1.322 | 1.842 | 2.442 | 3.122 | 3.882 |
| 0.938000000000001 | -0.117 | -0.077 | 0.043 | 0.243 | 0.523 | 0.883 | 1.323 | 1.843 | 2.443 | 3.123 | 3.883 |
| 0.939000000000001 | -0.115 | -0.075 | 0.045 | 0.245 | 0.525 | 0.885 | 1.325 | 1.845 | 2.445 | 3.125 | 3.885 |
| 0.940000000000001 | -0.113 | -0.073 | 0.047 | 0.247 | 0.527 | 0.887 | 1.327 | 1.847 | 2.447 | 3.127 | 3.887 |
| 0.941000000000001 | -0.111 | -0.071 | 0.049 | 0.249 | 0.529 | 0.889 | 1.329 | 1.849 | 2.449 | 3.129 | 3.889 |
| 0.942000000000001 | -0.109 | -0.069 | 0.051 | 0.251 | 0.531 | 0.891 | 1.331 | 1.851 | 2.451 | 3.131 | 3.891 |
| 0.943000000000001 | -0.108 | -0.068 | 0.052 | 0.252 | 0.532 | 0.892 | 1.332 | 1.852 | 2.452 | 3.132 | 3.892 |
| 0.944000000000001 | -0.106 | -0.066 | 0.054 | 0.254 | 0.534 | 0.894 | 1.334 | 1.854 | 2.454 | 3.134 | 3.894 |
| 0.945000000000001 | -0.104 | -0.064 | 0.056 | 0.256 | 0.536 | 0.896 | 1.336 | 1.856 | 2.456 | 3.136 | 3.896 |
| 0.946000000000001 | -0.102 | -0.062 | 0.058 | 0.258 | 0.538 | 0.898 | 1.338 | 1.858 | 2.458 | 3.138 | 3.898 |
| 0.947000000000001 | -0.101 | -0.061 | 0.059 | 0.259 | 0.539 | 0.899 | 1.339 | 1.859 | 2.459 | 3.139 | 3.899 |
| 0.948000000000001 | -0.099 | -0.059 | 0.061 | 0.261 | 0.541 | 0.901 | 1.341 | 1.861 | 2.461 | 3.141 | 3.901 |
| 0.949000000000001 | -0.097 | -0.057 | 0.063 | 0.263 | 0.543 | 0.903 | 1.343 | 1.863 | 2.463 | 3.143 | 3.903 |
| 0.950000000000001 | -0.095 | -0.055 | 0.065 | 0.265 | 0.545 | 0.905 | 1.345 | 1.865 | 2.465 | 3.145 | 3.905 |
| 0.951000000000001 | -0.093 | -0.053 | 0.067 | 0.267 | 0.547 | 0.907 | 1.347 | 1.867 | 2.467 | 3.147 | 3.907 |
| 0.952000000000001 | -0.092 | -0.052 | 0.068 | 0.268 | 0.548 | 0.908 | 1.348 | 1.868 | 2.468 | 3.148 | 3.908 |
| 0.953000000000001 | -0.09 | -0.05 | 0.07 | 0.27 | 0.55 | 0.91 | 1.35 | 1.87 | 2.47 | 3.15 | 3.91 |
| 0.954000000000001 | -0.088 | -0.048 | 0.072 | 0.272 | 0.552 | 0.912 | 1.352 | 1.872 | 2.472 | 3.152 | 3.912 |
| 0.955000000000001 | -0.086 | -0.046 | 0.074 | 0.274 | 0.554 | 0.914 | 1.354 | 1.874 | 2.474 | 3.154 | 3.914 |
| 0.956000000000001 | -0.084 | -0.044 | 0.076 | 0.276 | 0.556 | 0.916 | 1.356 | 1.876 | 2.476 | 3.156 | 3.916 |
| 0.957000000000001 | -0.082 | -0.042 | 0.078 | 0.278 | 0.558 | 0.918 | 1.358 | 1.878 | 2.478 | 3.158 | 3.918 |
| 0.958000000000001 | -0.081 | -0.041 | 0.079 | 0.279 | 0.559 | 0.919 | 1.359 | 1.879 | 2.479 | 3.159 | 3.919 |
| 0.959000000000001 | -0.079 | -0.039 | 0.081 | 0.281 | 0.561 | 0.921 | 1.361 | 1.881 | 2.481 | 3.161 | 3.921 |
| 0.960000000000001 | -0.077 | -0.037 | 0.083 | 0.283 | 0.563 | 0.923 | 1.363 | 1.883 | 2.483 | 3.163 | 3.923 |
| 0.961000000000001 | -0.075 | -0.035 | 0.085 | 0.285 | 0.565 | 0.925 | 1.365 | 1.885 | 2.485 | 3.165 | 3.925 |
| 0.962000000000001 | -0.073 | -0.033 | 0.087 | 0.287 | 0.567 | 0.927 | 1.367 | 1.887 | 2.487 | 3.167 | 3.927 |
| 0.963000000000001 | -0.071 | -0.031 | 0.089 | 0.289 | 0.569 | 0.929 | 1.369 | 1.889 | 2.489 | 3.169 | 3.929 |
| 0.964000000000001 | -0.069 | -0.029 | 0.091 | 0.291 | 0.571 | 0.931 | 1.371 | 1.891 | 2.491 | 3.171 | 3.931 |
| 0.965000000000001 | -0.068 | -0.028 | 0.092 | 0.292 | 0.572 | 0.932 | 1.372 | 1.892 | 2.492 | 3.172 | 3.932 |
| 0.966000000000001 | -0.066 | -0.026 | 0.094 | 0.294 | 0.574 | 0.934 | 1.374 | 1.894 | 2.494 | 3.174 | 3.934 |
| 0.967000000000001 | -0.064 | -0.024 | 0.096 | 0.296 | 0.576 | 0.936 | 1.376 | 1.896 | 2.496 | 3.176 | 3.936 |
| 0.968000000000001 | -0.062 | -0.022 | 0.098 | 0.298 | 0.578 | 0.938 | 1.378 | 1.898 | 2.498 | 3.178 | 3.938 |
| 0.969000000000001 | -0.06 | -0.02 | 0.1 | 0.3 | 0.58 | 0.94 | 1.38 | 1.9 | 2.5 | 3.18 | 3.94 |
| 0.970000000000001 | -0.058 | -0.018 | 0.102 | 0.302 | 0.582 | 0.942 | 1.382 | 1.902 | 2.502 | 3.182 | 3.942 |
| 0.971000000000001 | -0.056 | -0.016 | 0.104 | 0.304 | 0.584 | 0.944 | 1.384 | 1.904 | 2.504 | 3.184 | 3.944 |
| 0.972000000000001 | -0.054 | -0.014 | 0.106 | 0.306 | 0.586 | 0.946 | 1.386 | 1.906 | 2.506 | 3.186 | 3.946 |
| 0.973000000000001 | -0.053 | -0.013 | 0.107 | 0.307 | 0.587 | 0.947 | 1.387 | 1.907 | 2.507 | 3.187 | 3.947 |
| 0.974000000000001 | -0.051 | -0.011 | 0.109 | 0.309 | 0.589 | 0.949 | 1.389 | 1.909 | 2.509 | 3.189 | 3.949 |
| 0.975000000000001 | -0.049 | -0.009 | 0.111 | 0.311 | 0.591 | 0.951 | 1.391 | 1.911 | 2.511 | 3.191 | 3.951 |
| 0.976000000000001 | -0.047 | -0.007 | 0.113 | 0.313 | 0.593 | 0.953 | 1.393 | 1.913 | 2.513 | 3.193 | 3.953 |
| 0.977000000000001 | -0.045 | -0.005 | 0.115 | 0.315 | 0.595 | 0.955 | 1.395 | 1.915 | 2.515 | 3.195 | 3.955 |
| 0.978000000000001 | -0.043 | -0.003 | 0.117 | 0.317 | 0.597 | 0.957 | 1.397 | 1.917 | 2.517 | 3.197 | 3.957 |
| 0.979000000000001 | -0.041 | -0.001 | 0.119 | 0.319 | 0.599 | 0.959 | 1.399 | 1.919 | 2.519 | 3.199 | 3.959 |
| 0.980000000000001 | -0.039 | 0.001 | 0.121 | 0.321 | 0.601 | 0.961 | 1.401 | 1.921 | 2.521 | 3.201 | 3.961 |
| 0.981000000000001 | -0.037 | 0.003 | 0.123 | 0.323 | 0.603 | 0.963 | 1.403 | 1.923 | 2.523 | 3.203 | 3.963 |
| 0.982000000000001 | -0.035 | 0.005 | 0.125 | 0.325 | 0.605 | 0.965 | 1.405 | 1.925 | 2.525 | 3.205 | 3.965 |
| 0.983000000000001 | -0.033 | 0.007 | 0.127 | 0.327 | 0.607 | 0.967 | 1.407 | 1.927 | 2.527 | 3.207 | 3.967 |
| 0.984000000000001 | -0.031 | 0.009 | 0.129 | 0.329 | 0.609 | 0.969 | 1.409 | 1.929 | 2.529 | 3.209 | 3.969 |
| 0.985000000000001 | -0.03 | 0.01 | 0.13 | 0.33 | 0.61 | 0.97 | 1.41 | 1.93 | 2.53 | 3.21 | 3.97 |
| 0.986000000000001 | -0.028 | 0.012 | 0.132 | 0.332 | 0.612 | 0.972 | 1.412 | 1.932 | 2.532 | 3.212 | 3.972 |
| 0.987000000000001 | -0.026 | 0.014 | 0.134 | 0.334 | 0.614 | 0.974 | 1.414 | 1.934 | 2.534 | 3.214 | 3.974 |
| 0.988000000000001 | -0.024 | 0.016 | 0.136 | 0.336 | 0.616 | 0.976 | 1.416 | 1.936 | 2.536 | 3.216 | 3.976 |
| 0.989000000000001 | -0.022 | 0.018 | 0.138 | 0.338 | 0.618 | 0.978 | 1.418 | 1.938 | 2.538 | 3.218 | 3.978 |
| 0.990000000000001 | -0.02 | 0.02 | 0.14 | 0.34 | 0.62 | 0.98 | 1.42 | 1.94 | 2.54 | 3.22 | 3.98 |
| 0.991000000000001 | -0.018 | 0.022 | 0.142 | 0.342 | 0.622 | 0.982 | 1.422 | 1.942 | 2.542 | 3.222 | 3.982 |
| 0.992000000000001 | -0.016 | 0.024 | 0.144 | 0.344 | 0.624 | 0.984 | 1.424 | 1.944 | 2.544 | 3.224 | 3.984 |
| 0.993000000000001 | -0.014 | 0.026 | 0.146 | 0.346 | 0.626 | 0.986 | 1.426 | 1.946 | 2.546 | 3.226 | 3.986 |
| 0.994000000000001 | -0.012 | 0.028 | 0.148 | 0.348 | 0.628 | 0.988 | 1.428 | 1.948 | 2.548 | 3.228 | 3.988 |
| 0.995000000000001 | -0.01 | 0.03 | 0.15 | 0.35 | 0.63 | 0.99 | 1.43 | 1.95 | 2.55 | 3.23 | 3.99 |
| 0.996000000000001 | -0.008 | 0.032 | 0.152 | 0.352 | 0.632 | 0.992 | 1.432 | 1.952 | 2.552 | 3.232 | 3.992 |
| 0.997000000000001 | -0.006 | 0.034 | 0.154 | 0.354 | 0.634 | 0.994 | 1.434 | 1.954 | 2.554 | 3.234 | 3.994 |
| 0.998000000000001 | -0.004 | 0.036 | 0.156 | 0.356 | 0.636 | 0.996 | 1.436 | 1.956 | 2.556 | 3.236 | 3.996 |
| 0.999000000000001 | -0.002 | 0.038 | 0.158 | 0.358 | 0.638 | 0.998 | 1.438 | 1.958 | 2.558 | 3.238 | 3.998 |
| 1.000000000000001 | 0 | 0.04 | 0.16 | 0.36 | 0.64 | 1 | 1.44 | 1.96 | 2.56 | 3.24 | 4 |
| 1.001000000000001 | 0.002 | 0.042 | 0.162 | 0.362 | 0.642 | 1.002 | 1.442 | 1.962 | 2.562 | 3.242 | 4.002 |
| 1.002 | 0.004 | 0.044 | 0.164 | 0.364 | 0.644 | 1.004 | 1.444 | 1.964 | 2.564 | 3.244 | 4.004 |
| 1.003 | 0.006 | 0.046 | 0.166 | 0.366 | 0.646 | 1.006 | 1.446 | 1.966 | 2.566 | 3.246 | 4.006 |
| 1.004 | 0.008 | 0.048 | 0.168 | 0.368 | 0.648 | 1.008 | 1.448 | 1.968 | 2.568 | 3.248 | 4.008 |
| 1.005 | 0.01 | 0.05 | 0.17 | 0.37 | 0.65 | 1.01 | 1.45 | 1.97 | 2.57 | 3.25 | 4.01 |
| 1.006 | 0.012 | 0.052 | 0.172 | 0.372 | 0.652 | 1.012 | 1.452 | 1.972 | 2.572 | 3.252 | 4.012 |
| 1.007 | 0.014 | 0.054 | 0.174 | 0.374 | 0.654 | 1.014 | 1.454 | 1.974 | 2.574 | 3.254 | 4.014 |
| 1.008 | 0.016 | 0.056 | 0.176 | 0.376 | 0.656 | 1.016 | 1.456 | 1.976 | 2.576 | 3.256 | 4.016 |
| 1.009 | 0.018 | 0.058 | 0.178 | 0.378 | 0.658 | 1.018 | 1.458 | 1.978 | 2.578 | 3.258 | 4.018 |
| 1.01 | 0.02 | 0.06 | 0.18 | 0.38 | 0.66 | 1.02 | 1.46 | 1.98 | 2.58 | 3.26 | 4.02 |
| 1.010999999999999 | 0.022 | 0.062 | 0.182 | 0.382 | 0.662 | 1.022 | 1.462 | 1.982 | 2.582 | 3.262 | 4.022 |
| 1.011999999999999 | 0.024 | 0.064 | 0.184 | 0.384 | 0.664 | 1.024 | 1.464 | 1.984 | 2.584 | 3.264 | 4.024 |
| 1.012999999999999 | 0.026 | 0.066 | 0.186 | 0.386 | 0.666 | 1.026 | 1.466 | 1.986 | 2.586 | 3.266 | 4.026 |
| 1.013999999999999 | 0.028 | 0.068 | 0.188 | 0.388 | 0.668 | 1.028 | 1.468 | 1.988 | 2.588 | 3.268 | 4.028 |
| 1.014999999999999 | 0.03 | 0.07 | 0.19 | 0.39 | 0.67 | 1.03 | 1.47 | 1.99 | 2.59 | 3.27 | 4.03 |
| 1.015999999999999 | 0.033 | 0.073 | 0.193 | 0.393 | 0.673 | 1.033 | 1.473 | 1.993 | 2.593 | 3.273 | 4.033 |
| 1.016999999999999 | 0.035 | 0.075 | 0.195 | 0.395 | 0.675 | 1.035 | 1.475 | 1.995 | 2.595 | 3.275 | 4.035 |
| 1.017999999999999 | 0.037 | 0.077 | 0.197 | 0.397 | 0.677 | 1.037 | 1.477 | 1.997 | 2.597 | 3.277 | 4.037 |
| 1.018999999999999 | 0.039 | 0.079 | 0.199 | 0.399 | 0.679 | 1.039 | 1.479 | 1.999 | 2.599 | 3.279 | 4.039 |
| 1.019999999999998 | 0.041 | 0.081 | 0.201 | 0.401 | 0.681 | 1.041 | 1.481 | 2.001 | 2.601 | 3.281 | 4.041 |
| 1.020999999999998 | 0.043 | 0.083 | 0.203 | 0.403 | 0.683 | 1.043 | 1.483 | 2.003 | 2.603 | 3.283 | 4.043 |
| 1.021999999999998 | 0.045 | 0.085 | 0.205 | 0.405 | 0.685 | 1.045 | 1.485 | 2.005 | 2.605 | 3.285 | 4.045 |
| 1.022999999999998 | 0.047 | 0.087 | 0.207 | 0.407 | 0.687 | 1.047 | 1.487 | 2.007 | 2.607 | 3.287 | 4.047 |
| 1.023999999999998 | 0.049 | 0.089 | 0.209 | 0.409 | 0.689 | 1.049 | 1.489 | 2.009 | 2.609 | 3.289 | 4.049 |
| 1.024999999999998 | 0.051 | 0.091 | 0.211 | 0.411 | 0.691 | 1.051 | 1.491 | 2.011 | 2.611 | 3.291 | 4.051 |
| 1.025999999999998 | 0.053 | 0.093 | 0.213 | 0.413 | 0.693 | 1.053 | 1.493 | 2.013 | 2.613 | 3.293 | 4.053 |
| 1.026999999999998 | 0.055 | 0.095 | 0.215 | 0.415 | 0.695 | 1.055 | 1.495 | 2.015 | 2.615 | 3.295 | 4.055 |
| 1.027999999999998 | 0.058 | 0.098 | 0.218 | 0.418 | 0.698 | 1.058 | 1.498 | 2.018 | 2.618 | 3.298 | 4.058 |
| 1.028999999999997 | 0.06 | 0.1 | 0.22 | 0.42 | 0.7 | 1.06 | 1.5 | 2.02 | 2.62 | 3.3 | 4.06 |
| 1.029999999999997 | 0.062 | 0.102 | 0.222 | 0.422 | 0.702 | 1.062 | 1.502 | 2.022 | 2.622 | 3.302 | 4.062 |
| 1.030999999999997 | 0.064 | 0.104 | 0.224 | 0.424 | 0.704 | 1.064 | 1.504 | 2.024 | 2.624 | 3.304 | 4.064 |
| 1.031999999999997 | 0.066 | 0.106 | 0.226 | 0.426 | 0.706 | 1.066 | 1.506 | 2.026 | 2.626 | 3.306 | 4.066 |
| 1.032999999999997 | 0.068 | 0.108 | 0.228 | 0.428 | 0.708 | 1.068 | 1.508 | 2.028 | 2.628 | 3.308 | 4.068 |
| 1.033999999999997 | 0.07 | 0.11 | 0.23 | 0.43 | 0.71 | 1.07 | 1.51 | 2.03 | 2.63 | 3.31 | 4.07 |
| 1.034999999999997 | 0.072 | 0.112 | 0.232 | 0.432 | 0.712 | 1.072 | 1.512 | 2.032 | 2.632 | 3.312 | 4.072 |
| 1.035999999999997 | 0.075 | 0.115 | 0.235 | 0.435 | 0.715 | 1.075 | 1.515 | 2.035 | 2.635 | 3.315 | 4.075 |
| 1.036999999999997 | 0.077 | 0.117 | 0.237 | 0.437 | 0.717 | 1.077 | 1.517 | 2.037 | 2.637 | 3.317 | 4.077 |
| 1.037999999999996 | 0.079 | 0.119 | 0.239 | 0.439 | 0.719 | 1.079 | 1.519 | 2.039 | 2.639 | 3.319 | 4.079 |
| 1.038999999999996 | 0.081 | 0.121 | 0.241 | 0.441 | 0.721 | 1.081 | 1.521 | 2.041 | 2.641 | 3.321 | 4.081 |
| 1.039999999999996 | 0.083 | 0.123 | 0.243 | 0.443 | 0.723 | 1.083 | 1.523 | 2.043 | 2.643 | 3.323 | 4.083 |
| 1.040999999999996 | 0.085 | 0.125 | 0.245 | 0.445 | 0.725 | 1.085 | 1.525 | 2.045 | 2.645 | 3.325 | 4.085 |
| 1.041999999999996 | 0.088 | 0.128 | 0.248 | 0.448 | 0.728 | 1.088 | 1.528 | 2.048 | 2.648 | 3.328 | 4.088 |
| 1.042999999999996 | 0.09 | 0.13 | 0.25 | 0.45 | 0.73 | 1.09 | 1.53 | 2.05 | 2.65 | 3.33 | 4.09 |
| 1.043999999999996 | 0.092 | 0.132 | 0.252 | 0.452 | 0.732 | 1.092 | 1.532 | 2.052 | 2.652 | 3.332 | 4.092 |
| 1.044999999999996 | 0.094 | 0.134 | 0.254 | 0.454 | 0.734 | 1.094 | 1.534 | 2.054 | 2.654 | 3.334 | 4.094 |
| 1.045999999999996 | 0.096 | 0.136 | 0.256 | 0.456 | 0.736 | 1.096 | 1.536 | 2.056 | 2.656 | 3.336 | 4.096 |
| 1.046999999999995 | 0.099 | 0.139 | 0.259 | 0.459 | 0.739 | 1.099 | 1.539 | 2.059 | 2.659 | 3.339 | 4.099 |
| 1.047999999999995 | 0.101 | 0.141 | 0.261 | 0.461 | 0.741 | 1.101 | 1.541 | 2.061 | 2.661 | 3.341 | 4.101 |
| 1.048999999999995 | 0.103 | 0.143 | 0.263 | 0.463 | 0.743 | 1.103 | 1.543 | 2.063 | 2.663 | 3.343 | 4.103 |
| 1.049999999999995 | 0.105 | 0.145 | 0.265 | 0.465 | 0.745 | 1.105 | 1.545 | 2.065 | 2.665 | 3.345 | 4.105 |
| 1.050999999999995 | 0.107 | 0.147 | 0.267 | 0.467 | 0.747 | 1.107 | 1.547 | 2.067 | 2.667 | 3.347 | 4.107 |
| 1.051999999999995 | 0.11 | 0.15 | 0.27 | 0.47 | 0.75 | 1.11 | 1.55 | 2.07 | 2.67 | 3.35 | 4.11 |
| 1.052999999999995 | 0.112 | 0.152 | 0.272 | 0.472 | 0.752 | 1.112 | 1.552 | 2.072 | 2.672 | 3.352 | 4.112 |
| 1.053999999999995 | 0.114 | 0.154 | 0.274 | 0.474 | 0.754 | 1.114 | 1.554 | 2.074 | 2.674 | 3.354 | 4.114 |
| 1.054999999999995 | 0.116 | 0.156 | 0.276 | 0.476 | 0.756 | 1.116 | 1.556 | 2.076 | 2.676 | 3.356 | 4.116 |
| 1.055999999999994 | 0.118 | 0.158 | 0.278 | 0.478 | 0.758 | 1.118 | 1.558 | 2.078 | 2.678 | 3.358 | 4.118 |
| 1.056999999999994 | 0.121 | 0.161 | 0.281 | 0.481 | 0.761 | 1.121 | 1.561 | 2.081 | 2.681 | 3.361 | 4.121 |
| 1.057999999999994 | 0.123 | 0.163 | 0.283 | 0.483 | 0.763 | 1.123 | 1.563 | 2.083 | 2.683 | 3.363 | 4.123 |
| 1.058999999999994 | 0.125 | 0.165 | 0.285 | 0.485 | 0.765 | 1.125 | 1.565 | 2.085 | 2.685 | 3.365 | 4.125 |
| 1.059999999999994 | 0.127 | 0.167 | 0.287 | 0.487 | 0.767 | 1.127 | 1.567 | 2.087 | 2.687 | 3.367 | 4.127 |
| 1.060999999999994 | 0.13 | 0.17 | 0.29 | 0.49 | 0.77 | 1.13 | 1.57 | 2.09 | 2.69 | 3.37 | 4.13 |
| 1.061999999999994 | 0.132 | 0.172 | 0.292 | 0.492 | 0.772 | 1.132 | 1.572 | 2.092 | 2.692 | 3.372 | 4.132 |
| 1.062999999999994 | 0.134 | 0.174 | 0.294 | 0.494 | 0.774 | 1.134 | 1.574 | 2.094 | 2.694 | 3.374 | 4.134 |
| 1.063999999999994 | 0.136 | 0.176 | 0.296 | 0.496 | 0.776 | 1.136 | 1.576 | 2.096 | 2.696 | 3.376 | 4.136 |
| 1.064999999999993 | 0.139 | 0.179 | 0.299 | 0.499 | 0.779 | 1.139 | 1.579 | 2.099 | 2.699 | 3.379 | 4.139 |
| 1.065999999999993 | 0.141 | 0.181 | 0.301 | 0.501 | 0.781 | 1.141 | 1.581 | 2.101 | 2.701 | 3.381 | 4.141 |
| 1.066999999999993 | 0.143 | 0.183 | 0.303 | 0.503 | 0.783 | 1.143 | 1.583 | 2.103 | 2.703 | 3.383 | 4.143 |
| 1.067999999999993 | 0.146 | 0.186 | 0.306 | 0.506 | 0.786 | 1.146 | 1.586 | 2.106 | 2.706 | 3.386 | 4.146 |
| 1.068999999999993 | 0.148 | 0.188 | 0.308 | 0.508 | 0.788 | 1.148 | 1.588 | 2.108 | 2.708 | 3.388 | 4.148 |
| 1.069999999999993 | 0.15 | 0.19 | 0.31 | 0.51 | 0.79 | 1.15 | 1.59 | 2.11 | 2.71 | 3.39 | 4.15 |
| 1.070999999999993 | 0.152 | 0.192 | 0.312 | 0.512 | 0.792 | 1.152 | 1.592 | 2.112 | 2.712 | 3.392 | 4.152 |
| 1.071999999999993 | 0.155 | 0.195 | 0.315 | 0.515 | 0.795 | 1.155 | 1.595 | 2.115 | 2.715 | 3.395 | 4.155 |
| 1.072999999999993 | 0.157 | 0.197 | 0.317 | 0.517 | 0.797 | 1.157 | 1.597 | 2.117 | 2.717 | 3.397 | 4.157 |
| 1.073999999999993 | 0.159 | 0.199 | 0.319 | 0.519 | 0.799 | 1.159 | 1.599 | 2.119 | 2.719 | 3.399 | 4.159 |
| 1.074999999999992 | 0.162 | 0.202 | 0.322 | 0.522 | 0.802 | 1.162 | 1.602 | 2.122 | 2.722 | 3.402 | 4.162 |
| 1.075999999999992 | 0.164 | 0.204 | 0.324 | 0.524 | 0.804 | 1.164 | 1.604 | 2.124 | 2.724 | 3.404 | 4.164 |
| 1.076999999999992 | 0.166 | 0.206 | 0.326 | 0.526 | 0.806 | 1.166 | 1.606 | 2.126 | 2.726 | 3.406 | 4.166 |
| 1.077999999999992 | 0.169 | 0.209 | 0.329 | 0.529 | 0.809 | 1.169 | 1.609 | 2.129 | 2.729 | 3.409 | 4.169 |
| 1.078999999999992 | 0.171 | 0.211 | 0.331 | 0.531 | 0.811 | 1.171 | 1.611 | 2.131 | 2.731 | 3.411 | 4.171 |
| 1.079999999999992 | 0.173 | 0.213 | 0.333 | 0.533 | 0.813 | 1.173 | 1.613 | 2.133 | 2.733 | 3.413 | 4.173 |
| 1.080999999999992 | 0.176 | 0.216 | 0.336 | 0.536 | 0.816 | 1.176 | 1.616 | 2.136 | 2.736 | 3.416 | 4.176 |
| 1.081999999999992 | 0.178 | 0.218 | 0.338 | 0.538 | 0.818 | 1.178 | 1.618 | 2.138 | 2.738 | 3.418 | 4.178 |
| 1.082999999999992 | 0.18 | 0.22 | 0.34 | 0.54 | 0.82 | 1.18 | 1.62 | 2.14 | 2.74 | 3.42 | 4.18 |
| 1.083999999999991 | 0.183 | 0.223 | 0.343 | 0.543 | 0.823 | 1.183 | 1.623 | 2.143 | 2.743 | 3.423 | 4.183 |
| 1.084999999999991 | 0.185 | 0.225 | 0.345 | 0.545 | 0.825 | 1.185 | 1.625 | 2.145 | 2.745 | 3.425 | 4.185 |
| 1.085999999999991 | 0.187 | 0.227 | 0.347 | 0.547 | 0.827 | 1.187 | 1.627 | 2.147 | 2.747 | 3.427 | 4.187 |
| 1.086999999999991 | 0.19 | 0.23 | 0.35 | 0.55 | 0.83 | 1.19 | 1.63 | 2.15 | 2.75 | 3.43 | 4.19 |
| 1.087999999999991 | 0.192 | 0.232 | 0.352 | 0.552 | 0.832 | 1.192 | 1.632 | 2.152 | 2.752 | 3.432 | 4.192 |
| 1.088999999999991 | 0.195 | 0.235 | 0.355 | 0.555 | 0.835 | 1.195 | 1.635 | 2.155 | 2.755 | 3.435 | 4.195 |
| 1.089999999999991 | 0.197 | 0.237 | 0.357 | 0.557 | 0.837 | 1.197 | 1.637 | 2.157 | 2.757 | 3.437 | 4.197 |
| 1.090999999999991 | 0.199 | 0.239 | 0.359 | 0.559 | 0.839 | 1.199 | 1.639 | 2.159 | 2.759 | 3.439 | 4.199 |
| 1.091999999999991 | 0.202 | 0.242 | 0.362 | 0.562 | 0.842 | 1.202 | 1.642 | 2.162 | 2.762 | 3.442 | 4.202 |
| 1.09299999999999 | 0.204 | 0.244 | 0.364 | 0.564 | 0.844 | 1.204 | 1.644 | 2.164 | 2.764 | 3.444 | 4.204 |
| 1.09399999999999 | 0.207 | 0.247 | 0.367 | 0.567 | 0.847 | 1.207 | 1.647 | 2.167 | 2.767 | 3.447 | 4.207 |
| 1.09499999999999 | 0.209 | 0.249 | 0.369 | 0.569 | 0.849 | 1.209 | 1.649 | 2.169 | 2.769 | 3.449 | 4.209 |
| 1.09599999999999 | 0.211 | 0.251 | 0.371 | 0.571 | 0.851 | 1.211 | 1.651 | 2.171 | 2.771 | 3.451 | 4.211 |
| 1.09699999999999 | 0.214 | 0.254 | 0.374 | 0.574 | 0.854 | 1.214 | 1.654 | 2.174 | 2.774 | 3.454 | 4.214 |
| 1.09799999999999 | 0.216 | 0.256 | 0.376 | 0.576 | 0.856 | 1.216 | 1.656 | 2.176 | 2.776 | 3.456 | 4.216 |
| 1.09899999999999 | 0.219 | 0.259 | 0.379 | 0.579 | 0.859 | 1.219 | 1.659 | 2.179 | 2.779 | 3.459 | 4.219 |
| 1.09999999999999 | 0.221 | 0.261 | 0.381 | 0.581 | 0.861 | 1.221 | 1.661 | 2.181 | 2.781 | 3.461 | 4.221 |
| 1.10099999999999 | 0.223 | 0.263 | 0.383 | 0.583 | 0.863 | 1.223 | 1.663 | 2.183 | 2.783 | 3.463 | 4.223 |
| 1.101999999999989 | 0.226 | 0.266 | 0.386 | 0.586 | 0.866 | 1.226 | 1.666 | 2.186 | 2.786 | 3.466 | 4.226 |
| 1.102999999999989 | 0.228 | 0.268 | 0.388 | 0.588 | 0.868 | 1.228 | 1.668 | 2.188 | 2.788 | 3.468 | 4.228 |
| 1.103999999999989 | 0.231 | 0.271 | 0.391 | 0.591 | 0.871 | 1.231 | 1.671 | 2.191 | 2.791 | 3.471 | 4.231 |
| 1.104999999999989 | 0.233 | 0.273 | 0.393 | 0.593 | 0.873 | 1.233 | 1.673 | 2.193 | 2.793 | 3.473 | 4.233 |
| 1.105999999999989 | 0.236 | 0.276 | 0.396 | 0.596 | 0.876 | 1.236 | 1.676 | 2.196 | 2.796 | 3.476 | 4.236 |
| 1.106999999999989 | 0.238 | 0.278 | 0.398 | 0.598 | 0.878 | 1.238 | 1.678 | 2.198 | 2.798 | 3.478 | 4.238 |
| 1.107999999999989 | 0.241 | 0.281 | 0.401 | 0.601 | 0.881 | 1.241 | 1.681 | 2.201 | 2.801 | 3.481 | 4.241 |
| 1.108999999999989 | 0.243 | 0.283 | 0.403 | 0.603 | 0.883 | 1.243 | 1.683 | 2.203 | 2.803 | 3.483 | 4.243 |
| 1.109999999999989 | 0.246 | 0.286 | 0.406 | 0.606 | 0.886 | 1.246 | 1.686 | 2.206 | 2.806 | 3.486 | 4.246 |
| 1.110999999999988 | 0.248 | 0.288 | 0.408 | 0.608 | 0.888 | 1.248 | 1.688 | 2.208 | 2.808 | 3.488 | 4.248 |
| 1.111999999999988 | 0.25 | 0.29 | 0.41 | 0.61 | 0.89 | 1.25 | 1.69 | 2.21 | 2.81 | 3.49 | 4.25 |
| 1.112999999999988 | 0.253 | 0.293 | 0.413 | 0.613 | 0.893 | 1.253 | 1.693 | 2.213 | 2.813 | 3.493 | 4.253 |
| 1.113999999999988 | 0.255 | 0.295 | 0.415 | 0.615 | 0.895 | 1.255 | 1.695 | 2.215 | 2.815 | 3.495 | 4.255 |
| 1.114999999999988 | 0.258 | 0.298 | 0.418 | 0.618 | 0.898 | 1.258 | 1.698 | 2.218 | 2.818 | 3.498 | 4.258 |
| 1.115999999999988 | 0.26 | 0.3 | 0.42 | 0.62 | 0.9 | 1.26 | 1.7 | 2.22 | 2.82 | 3.5 | 4.26 |
| 1.116999999999988 | 0.263 | 0.303 | 0.423 | 0.623 | 0.903 | 1.263 | 1.703 | 2.223 | 2.823 | 3.503 | 4.263 |
| 1.117999999999988 | 0.265 | 0.305 | 0.425 | 0.625 | 0.905 | 1.265 | 1.705 | 2.225 | 2.825 | 3.505 | 4.265 |
| 1.118999999999988 | 0.268 | 0.308 | 0.428 | 0.628 | 0.908 | 1.268 | 1.708 | 2.228 | 2.828 | 3.508 | 4.268 |
| 1.119999999999987 | 0.271 | 0.311 | 0.431 | 0.631 | 0.911 | 1.271 | 1.711 | 2.231 | 2.831 | 3.511 | 4.271 |
| 1.120999999999987 | 0.273 | 0.313 | 0.433 | 0.633 | 0.913 | 1.273 | 1.713 | 2.233 | 2.833 | 3.513 | 4.273 |
| 1.121999999999987 | 0.276 | 0.316 | 0.436 | 0.636 | 0.916 | 1.276 | 1.716 | 2.236 | 2.836 | 3.516 | 4.276 |
| 1.122999999999987 | 0.278 | 0.318 | 0.438 | 0.638 | 0.918 | 1.278 | 1.718 | 2.238 | 2.838 | 3.518 | 4.278 |
| 1.123999999999987 | 0.281 | 0.321 | 0.441 | 0.641 | 0.921 | 1.281 | 1.721 | 2.241 | 2.841 | 3.521 | 4.281 |
| 1.124999999999987 | 0.283 | 0.323 | 0.443 | 0.643 | 0.923 | 1.283 | 1.723 | 2.243 | 2.843 | 3.523 | 4.283 |
| 1.125999999999987 | 0.286 | 0.326 | 0.446 | 0.646 | 0.926 | 1.286 | 1.726 | 2.246 | 2.846 | 3.526 | 4.286 |
| 1.126999999999987 | 0.288 | 0.328 | 0.448 | 0.648 | 0.928 | 1.288 | 1.728 | 2.248 | 2.848 | 3.528 | 4.288 |
| 1.127999999999987 | 0.291 | 0.331 | 0.451 | 0.651 | 0.931 | 1.291 | 1.731 | 2.251 | 2.851 | 3.531 | 4.291 |
| 1.128999999999986 | 0.293 | 0.333 | 0.453 | 0.653 | 0.933 | 1.293 | 1.733 | 2.253 | 2.853 | 3.533 | 4.293 |
| 1.129999999999986 | 0.296 | 0.336 | 0.456 | 0.656 | 0.936 | 1.296 | 1.736 | 2.256 | 2.856 | 3.536 | 4.296 |
| 1.130999999999986 | 0.299 | 0.339 | 0.459 | 0.659 | 0.939 | 1.299 | 1.739 | 2.259 | 2.859 | 3.539 | 4.299 |
| 1.131999999999986 | 0.301 | 0.341 | 0.461 | 0.661 | 0.941 | 1.301 | 1.741 | 2.261 | 2.861 | 3.541 | 4.301 |
| 1.132999999999986 | 0.304 | 0.344 | 0.464 | 0.664 | 0.944 | 1.304 | 1.744 | 2.264 | 2.864 | 3.544 | 4.304 |
| 1.133999999999986 | 0.306 | 0.346 | 0.466 | 0.666 | 0.946 | 1.306 | 1.746 | 2.266 | 2.866 | 3.546 | 4.306 |
| 1.134999999999986 | 0.309 | 0.349 | 0.469 | 0.669 | 0.949 | 1.309 | 1.749 | 2.269 | 2.869 | 3.549 | 4.309 |
| 1.135999999999986 | 0.312 | 0.352 | 0.472 | 0.672 | 0.952 | 1.312 | 1.752 | 2.272 | 2.872 | 3.552 | 4.312 |
| 1.136999999999986 | 0.314 | 0.354 | 0.474 | 0.674 | 0.954 | 1.314 | 1.754 | 2.274 | 2.874 | 3.554 | 4.314 |
| 1.137999999999985 | 0.317 | 0.357 | 0.477 | 0.677 | 0.957 | 1.317 | 1.757 | 2.277 | 2.877 | 3.557 | 4.317 |
| 1.138999999999985 | 0.319 | 0.359 | 0.479 | 0.679 | 0.959 | 1.319 | 1.759 | 2.279 | 2.879 | 3.559 | 4.319 |
| 1.139999999999985 | 0.322 | 0.362 | 0.482 | 0.682 | 0.962 | 1.322 | 1.762 | 2.282 | 2.882 | 3.562 | 4.322 |
| 1.140999999999985 | 0.325 | 0.365 | 0.485 | 0.685 | 0.965 | 1.325 | 1.765 | 2.285 | 2.885 | 3.565 | 4.325 |
| 1.141999999999985 | 0.327 | 0.367 | 0.487 | 0.687 | 0.967 | 1.327 | 1.767 | 2.287 | 2.887 | 3.567 | 4.327 |
| 1.142999999999985 | 0.33 | 0.37 | 0.49 | 0.69 | 0.97 | 1.33 | 1.77 | 2.29 | 2.89 | 3.57 | 4.33 |
| 1.143999999999985 | 0.332 | 0.372 | 0.492 | 0.692 | 0.972 | 1.332 | 1.772 | 2.292 | 2.892 | 3.572 | 4.332 |
| 1.144999999999985 | 0.335 | 0.375 | 0.495 | 0.695 | 0.975 | 1.335 | 1.775 | 2.295 | 2.895 | 3.575 | 4.335 |
| 1.145999999999985 | 0.338 | 0.378 | 0.498 | 0.698 | 0.978 | 1.338 | 1.778 | 2.298 | 2.898 | 3.578 | 4.338 |
| 1.146999999999984 | 0.34 | 0.38 | 0.5 | 0.7 | 0.98 | 1.34 | 1.78 | 2.3 | 2.9 | 3.58 | 4.34 |
| 1.147999999999984 | 0.343 | 0.383 | 0.503 | 0.703 | 0.983 | 1.343 | 1.783 | 2.303 | 2.903 | 3.583 | 4.343 |
| 1.148999999999984 | 0.346 | 0.386 | 0.506 | 0.706 | 0.986 | 1.346 | 1.786 | 2.306 | 2.906 | 3.586 | 4.346 |
| 1.149999999999984 | 0.348 | 0.388 | 0.508 | 0.708 | 0.988 | 1.348 | 1.788 | 2.308 | 2.908 | 3.588 | 4.348 |
| 1.150999999999984 | 0.351 | 0.391 | 0.511 | 0.711 | 0.991 | 1.351 | 1.791 | 2.311 | 2.911 | 3.591 | 4.351 |
| 1.151999999999984 | 0.354 | 0.394 | 0.514 | 0.714 | 0.994 | 1.354 | 1.794 | 2.314 | 2.914 | 3.594 | 4.354 |
| 1.152999999999984 | 0.356 | 0.396 | 0.516 | 0.716 | 0.996 | 1.356 | 1.796 | 2.316 | 2.916 | 3.596 | 4.356 |
| 1.153999999999984 | 0.359 | 0.399 | 0.519 | 0.719 | 0.999 | 1.359 | 1.799 | 2.319 | 2.919 | 3.599 | 4.359 |
| 1.154999999999984 | 0.362 | 0.402 | 0.522 | 0.722 | 1.002 | 1.362 | 1.802 | 2.322 | 2.922 | 3.602 | 4.362 |
| 1.155999999999983 | 0.364 | 0.404 | 0.524 | 0.724 | 1.004 | 1.364 | 1.804 | 2.324 | 2.924 | 3.604 | 4.364 |
| 1.156999999999983 | 0.367 | 0.407 | 0.527 | 0.727 | 1.007 | 1.367 | 1.807 | 2.327 | 2.927 | 3.607 | 4.367 |
| 1.157999999999983 | 0.37 | 0.41 | 0.53 | 0.73 | 1.01 | 1.37 | 1.81 | 2.33 | 2.93 | 3.61 | 4.37 |
| 1.158999999999983 | 0.373 | 0.413 | 0.533 | 0.733 | 1.013 | 1.373 | 1.813 | 2.333 | 2.933 | 3.613 | 4.373 |
| 1.159999999999983 | 0.375 | 0.415 | 0.535 | 0.735 | 1.015 | 1.375 | 1.815 | 2.335 | 2.935 | 3.615 | 4.375 |
| 1.160999999999983 | 0.378 | 0.418 | 0.538 | 0.738 | 1.018 | 1.378 | 1.818 | 2.338 | 2.938 | 3.618 | 4.378 |
| 1.161999999999983 | 0.381 | 0.421 | 0.541 | 0.741 | 1.021 | 1.381 | 1.821 | 2.341 | 2.941 | 3.621 | 4.381 |
| 1.162999999999983 | 0.383 | 0.423 | 0.543 | 0.743 | 1.023 | 1.383 | 1.823 | 2.343 | 2.943 | 3.623 | 4.383 |
| 1.163999999999983 | 0.386 | 0.426 | 0.546 | 0.746 | 1.026 | 1.386 | 1.826 | 2.346 | 2.946 | 3.626 | 4.386 |
| 1.164999999999982 | 0.389 | 0.429 | 0.549 | 0.749 | 1.029 | 1.389 | 1.829 | 2.349 | 2.949 | 3.629 | 4.389 |
| 1.165999999999982 | 0.392 | 0.432 | 0.552 | 0.752 | 1.032 | 1.392 | 1.832 | 2.352 | 2.952 | 3.632 | 4.392 |
| 1.166999999999982 | 0.394 | 0.434 | 0.554 | 0.754 | 1.034 | 1.394 | 1.834 | 2.354 | 2.954 | 3.634 | 4.394 |
| 1.167999999999982 | 0.397 | 0.437 | 0.557 | 0.757 | 1.037 | 1.397 | 1.837 | 2.357 | 2.957 | 3.637 | 4.397 |
| 1.168999999999982 | 0.4 | 0.44 | 0.56 | 0.76 | 1.04 | 1.4 | 1.84 | 2.36 | 2.96 | 3.64 | 4.4 |
| 1.169999999999982 | 0.403 | 0.443 | 0.563 | 0.763 | 1.043 | 1.403 | 1.843 | 2.363 | 2.963 | 3.643 | 4.403 |
| 1.170999999999982 | 0.405 | 0.445 | 0.565 | 0.765 | 1.045 | 1.405 | 1.845 | 2.365 | 2.965 | 3.645 | 4.405 |
| 1.171999999999982 | 0.408 | 0.448 | 0.568 | 0.768 | 1.048 | 1.408 | 1.848 | 2.368 | 2.968 | 3.648 | 4.408 |
| 1.172999999999982 | 0.411 | 0.451 | 0.571 | 0.771 | 1.051 | 1.411 | 1.851 | 2.371 | 2.971 | 3.651 | 4.411 |
| 1.173999999999981 | 0.414 | 0.454 | 0.574 | 0.774 | 1.054 | 1.414 | 1.854 | 2.374 | 2.974 | 3.654 | 4.414 |
| 1.174999999999981 | 0.417 | 0.457 | 0.577 | 0.777 | 1.057 | 1.417 | 1.857 | 2.377 | 2.977 | 3.657 | 4.417 |
| 1.175999999999981 | 0.419 | 0.459 | 0.579 | 0.779 | 1.059 | 1.419 | 1.859 | 2.379 | 2.979 | 3.659 | 4.419 |
| 1.176999999999981 | 0.422 | 0.462 | 0.582 | 0.782 | 1.062 | 1.422 | 1.862 | 2.382 | 2.982 | 3.662 | 4.422 |
| 1.177999999999981 | 0.425 | 0.465 | 0.585 | 0.785 | 1.065 | 1.425 | 1.865 | 2.385 | 2.985 | 3.665 | 4.425 |
| 1.178999999999981 | 0.428 | 0.468 | 0.588 | 0.788 | 1.068 | 1.428 | 1.868 | 2.388 | 2.988 | 3.668 | 4.428 |
| 1.179999999999981 | 0.431 | 0.471 | 0.591 | 0.791 | 1.071 | 1.431 | 1.871 | 2.391 | 2.991 | 3.671 | 4.431 |
| 1.180999999999981 | 0.433 | 0.473 | 0.593 | 0.793 | 1.073 | 1.433 | 1.873 | 2.393 | 2.993 | 3.673 | 4.433 |
| 1.181999999999981 | 0.436 | 0.476 | 0.596 | 0.796 | 1.076 | 1.436 | 1.876 | 2.396 | 2.996 | 3.676 | 4.436 |
| 1.18299999999998 | 0.439 | 0.479 | 0.599 | 0.799 | 1.079 | 1.439 | 1.879 | 2.399 | 2.999 | 3.679 | 4.439 |
| 1.18399999999998 | 0.442 | 0.482 | 0.602 | 0.802 | 1.082 | 1.442 | 1.882 | 2.402 | 3.002 | 3.682 | 4.442 |
| 1.18499999999998 | 0.445 | 0.485 | 0.605 | 0.805 | 1.085 | 1.445 | 1.885 | 2.405 | 3.005 | 3.685 | 4.445 |
| 1.18599999999998 | 0.448 | 0.488 | 0.608 | 0.808 | 1.088 | 1.448 | 1.888 | 2.408 | 3.008 | 3.688 | 4.448 |
| 1.18699999999998 | 0.45 | 0.49 | 0.61 | 0.81 | 1.09 | 1.45 | 1.89 | 2.41 | 3.01 | 3.69 | 4.45 |
| 1.18799999999998 | 0.453 | 0.493 | 0.613 | 0.813 | 1.093 | 1.453 | 1.893 | 2.413 | 3.013 | 3.693 | 4.453 |
| 1.18899999999998 | 0.456 | 0.496 | 0.616 | 0.816 | 1.096 | 1.456 | 1.896 | 2.416 | 3.016 | 3.696 | 4.456 |
| 1.18999999999998 | 0.459 | 0.499 | 0.619 | 0.819 | 1.099 | 1.459 | 1.899 | 2.419 | 3.019 | 3.699 | 4.459 |
| 1.19099999999998 | 0.462 | 0.502 | 0.622 | 0.822 | 1.102 | 1.462 | 1.902 | 2.422 | 3.022 | 3.702 | 4.462 |
| 1.191999999999979 | 0.465 | 0.505 | 0.625 | 0.825 | 1.105 | 1.465 | 1.905 | 2.425 | 3.025 | 3.705 | 4.465 |
| 1.192999999999979 | 0.468 | 0.508 | 0.628 | 0.828 | 1.108 | 1.468 | 1.908 | 2.428 | 3.028 | 3.708 | 4.468 |
| 1.193999999999979 | 0.471 | 0.511 | 0.631 | 0.831 | 1.111 | 1.471 | 1.911 | 2.431 | 3.031 | 3.711 | 4.471 |
| 1.194999999999979 | 0.473 | 0.513 | 0.633 | 0.833 | 1.113 | 1.473 | 1.913 | 2.433 | 3.033 | 3.713 | 4.473 |
| 1.195999999999979 | 0.476 | 0.516 | 0.636 | 0.836 | 1.116 | 1.476 | 1.916 | 2.436 | 3.036 | 3.716 | 4.476 |
| 1.196999999999979 | 0.479 | 0.519 | 0.639 | 0.839 | 1.119 | 1.479 | 1.919 | 2.439 | 3.039 | 3.719 | 4.479 |
| 1.197999999999979 | 0.482 | 0.522 | 0.642 | 0.842 | 1.122 | 1.482 | 1.922 | 2.442 | 3.042 | 3.722 | 4.482 |
| 1.198999999999979 | 0.485 | 0.525 | 0.645 | 0.845 | 1.125 | 1.485 | 1.925 | 2.445 | 3.045 | 3.725 | 4.485 |
| 1.199999999999979 | 0.488 | 0.528 | 0.648 | 0.848 | 1.128 | 1.488 | 1.928 | 2.448 | 3.048 | 3.728 | 4.488 |
| 1.200999999999979 | 0.491 | 0.531 | 0.651 | 0.851 | 1.131 | 1.491 | 1.931 | 2.451 | 3.051 | 3.731 | 4.491 |
| 1.201999999999978 | 0.494 | 0.534 | 0.654 | 0.854 | 1.134 | 1.494 | 1.934 | 2.454 | 3.054 | 3.734 | 4.494 |
| 1.202999999999978 | 0.497 | 0.537 | 0.657 | 0.857 | 1.137 | 1.497 | 1.937 | 2.457 | 3.057 | 3.737 | 4.497 |
| 1.203999999999978 | 0.5 | 0.54 | 0.66 | 0.86 | 1.14 | 1.5 | 1.94 | 2.46 | 3.06 | 3.74 | 4.5 |
| 1.204999999999978 | 0.503 | 0.543 | 0.663 | 0.863 | 1.143 | 1.503 | 1.943 | 2.463 | 3.063 | 3.743 | 4.503 |
| 1.205999999999978 | 0.506 | 0.546 | 0.666 | 0.866 | 1.146 | 1.506 | 1.946 | 2.466 | 3.066 | 3.746 | 4.506 |
| 1.206999999999978 | 0.509 | 0.549 | 0.669 | 0.869 | 1.149 | 1.509 | 1.949 | 2.469 | 3.069 | 3.749 | 4.509 |
| 1.207999999999978 | 0.512 | 0.552 | 0.672 | 0.872 | 1.152 | 1.512 | 1.952 | 2.472 | 3.072 | 3.752 | 4.512 |
| 1.208999999999978 | 0.514 | 0.554 | 0.674 | 0.874 | 1.154 | 1.514 | 1.954 | 2.474 | 3.074 | 3.754 | 4.514 |
| 1.209999999999978 | 0.517 | 0.557 | 0.677 | 0.877 | 1.157 | 1.517 | 1.957 | 2.477 | 3.077 | 3.757 | 4.517 |
| 1.210999999999977 | 0.52 | 0.56 | 0.68 | 0.88 | 1.16 | 1.52 | 1.96 | 2.48 | 3.08 | 3.76 | 4.52 |
| 1.211999999999977 | 0.523 | 0.563 | 0.683 | 0.883 | 1.163 | 1.523 | 1.963 | 2.483 | 3.083 | 3.763 | 4.523 |
| 1.212999999999977 | 0.526 | 0.566 | 0.686 | 0.886 | 1.166 | 1.526 | 1.966 | 2.486 | 3.086 | 3.766 | 4.526 |
| 1.213999999999977 | 0.529 | 0.569 | 0.689 | 0.889 | 1.169 | 1.529 | 1.969 | 2.489 | 3.089 | 3.769 | 4.529 |
| 1.214999999999977 | 0.532 | 0.572 | 0.692 | 0.892 | 1.172 | 1.532 | 1.972 | 2.492 | 3.092 | 3.772 | 4.532 |
| 1.215999999999977 | 0.535 | 0.575 | 0.695 | 0.895 | 1.175 | 1.535 | 1.975 | 2.495 | 3.095 | 3.775 | 4.535 |
| 1.216999999999977 | 0.538 | 0.578 | 0.698 | 0.898 | 1.178 | 1.538 | 1.978 | 2.498 | 3.098 | 3.778 | 4.538 |
| 1.217999999999977 | 0.541 | 0.581 | 0.701 | 0.901 | 1.181 | 1.541 | 1.981 | 2.501 | 3.101 | 3.781 | 4.541 |
| 1.218999999999977 | 0.544 | 0.584 | 0.704 | 0.904 | 1.184 | 1.544 | 1.984 | 2.504 | 3.104 | 3.784 | 4.544 |
| 1.219999999999976 | 0.547 | 0.587 | 0.707 | 0.907 | 1.187 | 1.547 | 1.987 | 2.507 | 3.107 | 3.787 | 4.547 |
| 1.220999999999976 | 0.55 | 0.59 | 0.71 | 0.91 | 1.19 | 1.55 | 1.99 | 2.51 | 3.11 | 3.79 | 4.55 |
| 1.221999999999976 | 0.554 | 0.594 | 0.714 | 0.914 | 1.194 | 1.554 | 1.994 | 2.514 | 3.114 | 3.794 | 4.554 |
| 1.222999999999976 | 0.557 | 0.597 | 0.717 | 0.917 | 1.197 | 1.557 | 1.997 | 2.517 | 3.117 | 3.797 | 4.557 |
| 1.223999999999976 | 0.56 | 0.6 | 0.72 | 0.92 | 1.2 | 1.56 | 2 | 2.52 | 3.12 | 3.8 | 4.56 |
| 1.224999999999976 | 0.563 | 0.603 | 0.723 | 0.923 | 1.203 | 1.563 | 2.003 | 2.523 | 3.123 | 3.803 | 4.563 |
| 1.225999999999976 | 0.566 | 0.606 | 0.726 | 0.926 | 1.206 | 1.566 | 2.006 | 2.526 | 3.126 | 3.806 | 4.566 |
| 1.226999999999976 | 0.569 | 0.609 | 0.729 | 0.929 | 1.209 | 1.569 | 2.009 | 2.529 | 3.129 | 3.809 | 4.569 |
| 1.227999999999976 | 0.572 | 0.612 | 0.732 | 0.932 | 1.212 | 1.572 | 2.012 | 2.532 | 3.132 | 3.812 | 4.572 |
| 1.228999999999975 | 0.575 | 0.615 | 0.735 | 0.935 | 1.215 | 1.575 | 2.015 | 2.535 | 3.135 | 3.815 | 4.575 |
| 1.229999999999975 | 0.578 | 0.618 | 0.738 | 0.938 | 1.218 | 1.578 | 2.018 | 2.538 | 3.138 | 3.818 | 4.578 |
| 1.230999999999975 | 0.581 | 0.621 | 0.741 | 0.941 | 1.221 | 1.581 | 2.021 | 2.541 | 3.141 | 3.821 | 4.581 |
| 1.231999999999975 | 0.584 | 0.624 | 0.744 | 0.944 | 1.224 | 1.584 | 2.024 | 2.544 | 3.144 | 3.824 | 4.584 |
| 1.232999999999975 | 0.587 | 0.627 | 0.747 | 0.947 | 1.227 | 1.587 | 2.027 | 2.547 | 3.147 | 3.827 | 4.587 |
| 1.233999999999975 | 0.59 | 0.63 | 0.75 | 0.95 | 1.23 | 1.59 | 2.03 | 2.55 | 3.15 | 3.83 | 4.59 |
| 1.234999999999975 | 0.593 | 0.633 | 0.753 | 0.953 | 1.233 | 1.593 | 2.033 | 2.553 | 3.153 | 3.833 | 4.593 |
| 1.235999999999975 | 0.597 | 0.637 | 0.757 | 0.957 | 1.237 | 1.597 | 2.037 | 2.557 | 3.157 | 3.837 | 4.597 |
| 1.236999999999975 | 0.6 | 0.64 | 0.76 | 0.96 | 1.24 | 1.6 | 2.04 | 2.56 | 3.16 | 3.84 | 4.6 |
| 1.237999999999974 | 0.603 | 0.643 | 0.763 | 0.963 | 1.243 | 1.603 | 2.043 | 2.563 | 3.163 | 3.843 | 4.603 |
| 1.238999999999974 | 0.606 | 0.646 | 0.766 | 0.966 | 1.246 | 1.606 | 2.046 | 2.566 | 3.166 | 3.846 | 4.606 |
| 1.239999999999974 | 0.609 | 0.649 | 0.769 | 0.969 | 1.249 | 1.609 | 2.049 | 2.569 | 3.169 | 3.849 | 4.609 |
| 1.240999999999974 | 0.612 | 0.652 | 0.772 | 0.972 | 1.252 | 1.612 | 2.052 | 2.572 | 3.172 | 3.852 | 4.612 |
| 1.241999999999974 | 0.615 | 0.655 | 0.775 | 0.975 | 1.255 | 1.615 | 2.055 | 2.575 | 3.175 | 3.855 | 4.615 |
| 1.242999999999974 | 0.618 | 0.658 | 0.778 | 0.978 | 1.258 | 1.618 | 2.058 | 2.578 | 3.178 | 3.858 | 4.618 |
| 1.243999999999974 | 0.622 | 0.662 | 0.782 | 0.982 | 1.262 | 1.622 | 2.062 | 2.582 | 3.182 | 3.862 | 4.622 |
| 1.244999999999974 | 0.625 | 0.665 | 0.785 | 0.985 | 1.265 | 1.625 | 2.065 | 2.585 | 3.185 | 3.865 | 4.625 |
| 1.245999999999974 | 0.628 | 0.668 | 0.788 | 0.988 | 1.268 | 1.628 | 2.068 | 2.588 | 3.188 | 3.868 | 4.628 |
| 1.246999999999973 | 0.631 | 0.671 | 0.791 | 0.991 | 1.271 | 1.631 | 2.071 | 2.591 | 3.191 | 3.871 | 4.631 |
| 1.247999999999973 | 0.634 | 0.674 | 0.794 | 0.994 | 1.274 | 1.634 | 2.074 | 2.594 | 3.194 | 3.874 | 4.634 |
| 1.248999999999973 | 0.637 | 0.677 | 0.797 | 0.997 | 1.277 | 1.637 | 2.077 | 2.597 | 3.197 | 3.877 | 4.637 |
| 1.249999999999973 | 0.641 | 0.681 | 0.801 | 1.001 | 1.281 | 1.641 | 2.081 | 2.601 | 3.201 | 3.881 | 4.641 |
| 1.250999999999973 | 0.644 | 0.684 | 0.804 | 1.004 | 1.284 | 1.644 | 2.084 | 2.604 | 3.204 | 3.884 | 4.644 |
| 1.251999999999973 | 0.647 | 0.687 | 0.807 | 1.007 | 1.287 | 1.647 | 2.087 | 2.607 | 3.207 | 3.887 | 4.647 |
| 1.252999999999973 | 0.65 | 0.69 | 0.81 | 1.01 | 1.29 | 1.65 | 2.09 | 2.61 | 3.21 | 3.89 | 4.65 |
| 1.253999999999973 | 0.653 | 0.693 | 0.813 | 1.013 | 1.293 | 1.653 | 2.093 | 2.613 | 3.213 | 3.893 | 4.653 |
| 1.254999999999973 | 0.657 | 0.697 | 0.817 | 1.017 | 1.297 | 1.657 | 2.097 | 2.617 | 3.217 | 3.897 | 4.657 |
| 1.255999999999972 | 0.66 | 0.7 | 0.82 | 1.02 | 1.3 | 1.66 | 2.1 | 2.62 | 3.22 | 3.9 | 4.66 |
| 1.256999999999972 | 0.663 | 0.703 | 0.823 | 1.023 | 1.303 | 1.663 | 2.103 | 2.623 | 3.223 | 3.903 | 4.663 |
| 1.257999999999972 | 0.666 | 0.706 | 0.826 | 1.026 | 1.306 | 1.666 | 2.106 | 2.626 | 3.226 | 3.906 | 4.666 |
| 1.258999999999972 | 0.67 | 0.71 | 0.83 | 1.03 | 1.31 | 1.67 | 2.11 | 2.63 | 3.23 | 3.91 | 4.67 |
| 1.259999999999972 | 0.673 | 0.713 | 0.833 | 1.033 | 1.313 | 1.673 | 2.113 | 2.633 | 3.233 | 3.913 | 4.673 |
| 1.260999999999972 | 0.676 | 0.716 | 0.836 | 1.036 | 1.316 | 1.676 | 2.116 | 2.636 | 3.236 | 3.916 | 4.676 |
| 1.261999999999972 | 0.679 | 0.719 | 0.839 | 1.039 | 1.319 | 1.679 | 2.119 | 2.639 | 3.239 | 3.919 | 4.679 |
| 1.262999999999972 | 0.683 | 0.723 | 0.843 | 1.043 | 1.323 | 1.683 | 2.123 | 2.643 | 3.243 | 3.923 | 4.683 |
| 1.263999999999972 | 0.686 | 0.726 | 0.846 | 1.046 | 1.326 | 1.686 | 2.126 | 2.646 | 3.246 | 3.926 | 4.686 |
| 1.264999999999971 | 0.689 | 0.729 | 0.849 | 1.049 | 1.329 | 1.689 | 2.129 | 2.649 | 3.249 | 3.929 | 4.689 |
| 1.265999999999971 | 0.692 | 0.732 | 0.852 | 1.052 | 1.332 | 1.692 | 2.132 | 2.652 | 3.252 | 3.932 | 4.692 |
| 1.266999999999971 | 0.696 | 0.736 | 0.856 | 1.056 | 1.336 | 1.696 | 2.136 | 2.656 | 3.256 | 3.936 | 4.696 |
| 1.267999999999971 | 0.699 | 0.739 | 0.859 | 1.059 | 1.339 | 1.699 | 2.139 | 2.659 | 3.259 | 3.939 | 4.699 |
| 1.268999999999971 | 0.702 | 0.742 | 0.862 | 1.062 | 1.342 | 1.702 | 2.142 | 2.662 | 3.262 | 3.942 | 4.702 |
| 1.269999999999971 | 0.705 | 0.745 | 0.865 | 1.065 | 1.345 | 1.705 | 2.145 | 2.665 | 3.265 | 3.945 | 4.705 |
| 1.270999999999971 | 0.709 | 0.749 | 0.869 | 1.069 | 1.349 | 1.709 | 2.149 | 2.669 | 3.269 | 3.949 | 4.709 |
| 1.271999999999971 | 0.712 | 0.752 | 0.872 | 1.072 | 1.352 | 1.712 | 2.152 | 2.672 | 3.272 | 3.952 | 4.712 |
| 1.272999999999971 | 0.715 | 0.755 | 0.875 | 1.075 | 1.355 | 1.715 | 2.155 | 2.675 | 3.275 | 3.955 | 4.715 |
| 1.27399999999997 | 0.719 | 0.759 | 0.879 | 1.079 | 1.359 | 1.719 | 2.159 | 2.679 | 3.279 | 3.959 | 4.719 |
| 1.27499999999997 | 0.722 | 0.762 | 0.882 | 1.082 | 1.362 | 1.722 | 2.162 | 2.682 | 3.282 | 3.962 | 4.722 |
| 1.27599999999997 | 0.725 | 0.765 | 0.885 | 1.085 | 1.365 | 1.725 | 2.165 | 2.685 | 3.285 | 3.965 | 4.725 |
| 1.27699999999997 | 0.729 | 0.769 | 0.889 | 1.089 | 1.369 | 1.729 | 2.169 | 2.689 | 3.289 | 3.969 | 4.729 |
| 1.27799999999997 | 0.732 | 0.772 | 0.892 | 1.092 | 1.372 | 1.732 | 2.172 | 2.692 | 3.292 | 3.972 | 4.732 |
| 1.27899999999997 | 0.735 | 0.775 | 0.895 | 1.095 | 1.375 | 1.735 | 2.175 | 2.695 | 3.295 | 3.975 | 4.735 |
| 1.27999999999997 | 0.739 | 0.779 | 0.899 | 1.099 | 1.379 | 1.739 | 2.179 | 2.699 | 3.299 | 3.979 | 4.739 |
| 1.28099999999997 | 0.742 | 0.782 | 0.902 | 1.102 | 1.382 | 1.742 | 2.182 | 2.702 | 3.302 | 3.982 | 4.742 |
| 1.28199999999997 | 0.745 | 0.785 | 0.905 | 1.105 | 1.385 | 1.745 | 2.185 | 2.705 | 3.305 | 3.985 | 4.745 |
| 1.282999999999969 | 0.749 | 0.789 | 0.909 | 1.109 | 1.389 | 1.749 | 2.189 | 2.709 | 3.309 | 3.989 | 4.749 |
| 1.283999999999969 | 0.752 | 0.792 | 0.912 | 1.112 | 1.392 | 1.752 | 2.192 | 2.712 | 3.312 | 3.992 | 4.752 |
| 1.284999999999969 | 0.756 | 0.796 | 0.916 | 1.116 | 1.396 | 1.756 | 2.196 | 2.716 | 3.316 | 3.996 | 4.756 |
| 1.285999999999969 | 0.759 | 0.799 | 0.919 | 1.119 | 1.399 | 1.759 | 2.199 | 2.719 | 3.319 | 3.999 | 4.759 |
| 1.286999999999969 | 0.762 | 0.802 | 0.922 | 1.122 | 1.402 | 1.762 | 2.202 | 2.722 | 3.322 | 4.002 | 4.762 |
| 1.287999999999969 | 0.766 | 0.806 | 0.926 | 1.126 | 1.406 | 1.766 | 2.206 | 2.726 | 3.326 | 4.006 | 4.766 |
| 1.288999999999969 | 0.769 | 0.809 | 0.929 | 1.129 | 1.409 | 1.769 | 2.209 | 2.729 | 3.329 | 4.009 | 4.769 |
| 1.289999999999969 | 0.773 | 0.813 | 0.933 | 1.133 | 1.413 | 1.773 | 2.213 | 2.733 | 3.333 | 4.013 | 4.773 |
| 1.290999999999969 | 0.776 | 0.816 | 0.936 | 1.136 | 1.416 | 1.776 | 2.216 | 2.736 | 3.336 | 4.016 | 4.776 |
| 1.291999999999968 | 0.779 | 0.819 | 0.939 | 1.139 | 1.419 | 1.779 | 2.219 | 2.739 | 3.339 | 4.019 | 4.779 |
| 1.292999999999968 | 0.783 | 0.823 | 0.943 | 1.143 | 1.423 | 1.783 | 2.223 | 2.743 | 3.343 | 4.023 | 4.783 |
| 1.293999999999968 | 0.786 | 0.826 | 0.946 | 1.146 | 1.426 | 1.786 | 2.226 | 2.746 | 3.346 | 4.026 | 4.786 |
| 1.294999999999968 | 0.79 | 0.83 | 0.95 | 1.15 | 1.43 | 1.79 | 2.23 | 2.75 | 3.35 | 4.03 | 4.79 |
| 1.295999999999968 | 0.793 | 0.833 | 0.953 | 1.153 | 1.433 | 1.793 | 2.233 | 2.753 | 3.353 | 4.033 | 4.793 |
| 1.296999999999968 | 0.797 | 0.837 | 0.957 | 1.157 | 1.437 | 1.797 | 2.237 | 2.757 | 3.357 | 4.037 | 4.797 |
| 1.297999999999968 | 0.8 | 0.84 | 0.96 | 1.16 | 1.44 | 1.8 | 2.24 | 2.76 | 3.36 | 4.04 | 4.8 |
| 1.298999999999968 | 0.804 | 0.844 | 0.964 | 1.164 | 1.444 | 1.804 | 2.244 | 2.764 | 3.364 | 4.044 | 4.804 |
| 1.299999999999968 | 0.807 | 0.847 | 0.967 | 1.167 | 1.447 | 1.807 | 2.247 | 2.767 | 3.367 | 4.047 | 4.807 |
| 1.300999999999967 | 0.81 | 0.85 | 0.97 | 1.17 | 1.45 | 1.81 | 2.25 | 2.77 | 3.37 | 4.05 | 4.81 |
| 1.301999999999967 | 0.814 | 0.854 | 0.974 | 1.174 | 1.454 | 1.814 | 2.254 | 2.774 | 3.374 | 4.054 | 4.814 |
| 1.302999999999967 | 0.817 | 0.857 | 0.977 | 1.177 | 1.457 | 1.817 | 2.257 | 2.777 | 3.377 | 4.057 | 4.817 |
| 1.303999999999967 | 0.821 | 0.861 | 0.981 | 1.181 | 1.461 | 1.821 | 2.261 | 2.781 | 3.381 | 4.061 | 4.821 |
| 1.304999999999967 | 0.824 | 0.864 | 0.984 | 1.184 | 1.464 | 1.824 | 2.264 | 2.784 | 3.384 | 4.064 | 4.824 |
| 1.305999999999967 | 0.828 | 0.868 | 0.988 | 1.188 | 1.468 | 1.828 | 2.268 | 2.788 | 3.388 | 4.068 | 4.828 |
| 1.306999999999967 | 0.831 | 0.871 | 0.991 | 1.191 | 1.471 | 1.831 | 2.271 | 2.791 | 3.391 | 4.071 | 4.831 |
| 1.307999999999967 | 0.835 | 0.875 | 0.995 | 1.195 | 1.475 | 1.835 | 2.275 | 2.795 | 3.395 | 4.075 | 4.835 |
| 1.308999999999967 | 0.838 | 0.878 | 0.998 | 1.198 | 1.478 | 1.838 | 2.278 | 2.798 | 3.398 | 4.078 | 4.838 |
| 1.309999999999966 | 0.842 | 0.882 | 1.002 | 1.202 | 1.482 | 1.842 | 2.282 | 2.802 | 3.402 | 4.082 | 4.842 |
| 1.310999999999966 | 0.846 | 0.886 | 1.006 | 1.206 | 1.486 | 1.846 | 2.286 | 2.806 | 3.406 | 4.086 | 4.846 |
| 1.311999999999966 | 0.849 | 0.889 | 1.009 | 1.209 | 1.489 | 1.849 | 2.289 | 2.809 | 3.409 | 4.089 | 4.849 |
| 1.312999999999966 | 0.853 | 0.893 | 1.013 | 1.213 | 1.493 | 1.853 | 2.293 | 2.813 | 3.413 | 4.093 | 4.853 |
| 1.313999999999966 | 0.856 | 0.896 | 1.016 | 1.216 | 1.496 | 1.856 | 2.296 | 2.816 | 3.416 | 4.096 | 4.856 |
| 1.314999999999966 | 0.86 | 0.9 | 1.02 | 1.22 | 1.5 | 1.86 | 2.3 | 2.82 | 3.42 | 4.1 | 4.86 |
| 1.315999999999966 | 0.863 | 0.903 | 1.023 | 1.223 | 1.503 | 1.863 | 2.303 | 2.823 | 3.423 | 4.103 | 4.863 |
| 1.316999999999966 | 0.867 | 0.907 | 1.027 | 1.227 | 1.507 | 1.867 | 2.307 | 2.827 | 3.427 | 4.107 | 4.867 |
| 1.317999999999966 | 0.87 | 0.91 | 1.03 | 1.23 | 1.51 | 1.87 | 2.31 | 2.83 | 3.43 | 4.11 | 4.87 |
| 1.318999999999965 | 0.874 | 0.914 | 1.034 | 1.234 | 1.514 | 1.874 | 2.314 | 2.834 | 3.434 | 4.114 | 4.874 |
| 1.319999999999965 | 0.878 | 0.918 | 1.038 | 1.238 | 1.518 | 1.878 | 2.318 | 2.838 | 3.438 | 4.118 | 4.878 |
| 1.320999999999965 | 0.881 | 0.921 | 1.041 | 1.241 | 1.521 | 1.881 | 2.321 | 2.841 | 3.441 | 4.121 | 4.881 |
| 1.321999999999965 | 0.885 | 0.925 | 1.045 | 1.245 | 1.525 | 1.885 | 2.325 | 2.845 | 3.445 | 4.125 | 4.885 |
| 1.322999999999965 | 0.888 | 0.928 | 1.048 | 1.248 | 1.528 | 1.888 | 2.328 | 2.848 | 3.448 | 4.128 | 4.888 |
| 1.323999999999965 | 0.892 | 0.932 | 1.052 | 1.252 | 1.532 | 1.892 | 2.332 | 2.852 | 3.452 | 4.132 | 4.892 |
| 1.324999999999965 | 0.896 | 0.936 | 1.056 | 1.256 | 1.536 | 1.896 | 2.336 | 2.856 | 3.456 | 4.136 | 4.896 |
| 1.325999999999965 | 0.899 | 0.939 | 1.059 | 1.259 | 1.539 | 1.899 | 2.339 | 2.859 | 3.459 | 4.139 | 4.899 |
| 1.326999999999965 | 0.903 | 0.943 | 1.063 | 1.263 | 1.543 | 1.903 | 2.343 | 2.863 | 3.463 | 4.143 | 4.903 |
| 1.327999999999964 | 0.906 | 0.946 | 1.066 | 1.266 | 1.546 | 1.906 | 2.346 | 2.866 | 3.466 | 4.146 | 4.906 |
| 1.328999999999964 | 0.91 | 0.95 | 1.07 | 1.27 | 1.55 | 1.91 | 2.35 | 2.87 | 3.47 | 4.15 | 4.91 |
| 1.329999999999964 | 0.914 | 0.954 | 1.074 | 1.274 | 1.554 | 1.914 | 2.354 | 2.874 | 3.474 | 4.154 | 4.914 |
| 1.330999999999964 | 0.917 | 0.957 | 1.077 | 1.277 | 1.557 | 1.917 | 2.357 | 2.877 | 3.477 | 4.157 | 4.917 |
| 1.331999999999964 | 0.921 | 0.961 | 1.081 | 1.281 | 1.561 | 1.921 | 2.361 | 2.881 | 3.481 | 4.161 | 4.921 |
| 1.332999999999964 | 0.925 | 0.965 | 1.085 | 1.285 | 1.565 | 1.925 | 2.365 | 2.885 | 3.485 | 4.165 | 4.925 |
| 1.333999999999964 | 0.928 | 0.968 | 1.088 | 1.288 | 1.568 | 1.928 | 2.368 | 2.888 | 3.488 | 4.168 | 4.928 |
| 1.334999999999964 | 0.932 | 0.972 | 1.092 | 1.292 | 1.572 | 1.932 | 2.372 | 2.892 | 3.492 | 4.172 | 4.932 |
| 1.335999999999964 | 0.936 | 0.976 | 1.096 | 1.296 | 1.576 | 1.936 | 2.376 | 2.896 | 3.496 | 4.176 | 4.936 |
| 1.336999999999963 | 0.939 | 0.979 | 1.099 | 1.299 | 1.579 | 1.939 | 2.379 | 2.899 | 3.499 | 4.179 | 4.939 |
| 1.337999999999963 | 0.943 | 0.983 | 1.103 | 1.303 | 1.583 | 1.943 | 2.383 | 2.903 | 3.503 | 4.183 | 4.943 |
| 1.338999999999963 | 0.947 | 0.987 | 1.107 | 1.307 | 1.587 | 1.947 | 2.387 | 2.907 | 3.507 | 4.187 | 4.947 |
| 1.339999999999963 | 0.951 | 0.991 | 1.111 | 1.311 | 1.591 | 1.951 | 2.391 | 2.911 | 3.511 | 4.191 | 4.951 |
| 1.340999999999963 | 0.954 | 0.994 | 1.114 | 1.314 | 1.594 | 1.954 | 2.394 | 2.914 | 3.514 | 4.194 | 4.954 |
| 1.341999999999963 | 0.958 | 0.998 | 1.118 | 1.318 | 1.598 | 1.958 | 2.398 | 2.918 | 3.518 | 4.198 | 4.958 |
| 1.342999999999963 | 0.962 | 1.002 | 1.122 | 1.322 | 1.602 | 1.962 | 2.402 | 2.922 | 3.522 | 4.202 | 4.962 |
| 1.343999999999963 | 0.965 | 1.005 | 1.125 | 1.325 | 1.605 | 1.965 | 2.405 | 2.925 | 3.525 | 4.205 | 4.965 |
| 1.344999999999963 | 0.969 | 1.009 | 1.129 | 1.329 | 1.609 | 1.969 | 2.409 | 2.929 | 3.529 | 4.209 | 4.969 |
| 1.345999999999963 | 0.973 | 1.013 | 1.133 | 1.333 | 1.613 | 1.973 | 2.413 | 2.933 | 3.533 | 4.213 | 4.973 |
| 1.346999999999962 | 0.977 | 1.017 | 1.137 | 1.337 | 1.617 | 1.977 | 2.417 | 2.937 | 3.537 | 4.217 | 4.977 |
| 1.347999999999962 | 0.98 | 1.02 | 1.14 | 1.34 | 1.62 | 1.98 | 2.42 | 2.94 | 3.54 | 4.22 | 4.98 |
| 1.348999999999962 | 0.984 | 1.024 | 1.144 | 1.344 | 1.624 | 1.984 | 2.424 | 2.944 | 3.544 | 4.224 | 4.984 |
| 1.349999999999962 | 0.988 | 1.028 | 1.148 | 1.348 | 1.628 | 1.988 | 2.428 | 2.948 | 3.548 | 4.228 | 4.988 |
| 1.350999999999962 | 0.992 | 1.032 | 1.152 | 1.352 | 1.632 | 1.992 | 2.432 | 2.952 | 3.552 | 4.232 | 4.992 |
| 1.351999999999962 | 0.995 | 1.035 | 1.155 | 1.355 | 1.635 | 1.995 | 2.435 | 2.955 | 3.555 | 4.235 | 4.995 |
| 1.352999999999962 | 0.999 | 1.039 | 1.159 | 1.359 | 1.639 | 1.999 | 2.439 | 2.959 | 3.559 | 4.239 | 4.999 |
| 1.353999999999962 | 1.003 | 1.043 | 1.163 | 1.363 | 1.643 | 2.003 | 2.443 | 2.963 | 3.563 | 4.243 | 5.003 |
| 1.354999999999962 | 1.007 | 1.047 | 1.167 | 1.367 | 1.647 | 2.007 | 2.447 | 2.967 | 3.567 | 4.247 | 5.007 |
| 1.355999999999961 | 1.011 | 1.051 | 1.171 | 1.371 | 1.651 | 2.011 | 2.451 | 2.971 | 3.571 | 4.251 | 5.011 |
| 1.356999999999961 | 1.014 | 1.054 | 1.174 | 1.374 | 1.654 | 2.014 | 2.454 | 2.974 | 3.574 | 4.254 | 5.014 |
| 1.357999999999961 | 1.018 | 1.058 | 1.178 | 1.378 | 1.658 | 2.018 | 2.458 | 2.978 | 3.578 | 4.258 | 5.018 |
| 1.358999999999961 | 1.022 | 1.062 | 1.182 | 1.382 | 1.662 | 2.022 | 2.462 | 2.982 | 3.582 | 4.262 | 5.022 |
| 1.359999999999961 | 1.026 | 1.066 | 1.186 | 1.386 | 1.666 | 2.026 | 2.466 | 2.986 | 3.586 | 4.266 | 5.026 |
| 1.360999999999961 | 1.03 | 1.07 | 1.19 | 1.39 | 1.67 | 2.03 | 2.47 | 2.99 | 3.59 | 4.27 | 5.03 |
| 1.361999999999961 | 1.034 | 1.074 | 1.194 | 1.394 | 1.674 | 2.034 | 2.474 | 2.994 | 3.594 | 4.274 | 5.034 |
| 1.362999999999961 | 1.037 | 1.077 | 1.197 | 1.397 | 1.677 | 2.037 | 2.477 | 2.997 | 3.597 | 4.277 | 5.037 |
| 1.363999999999961 | 1.041 | 1.081 | 1.201 | 1.401 | 1.681 | 2.041 | 2.481 | 3.001 | 3.601 | 4.281 | 5.041 |
| 1.36499999999996 | 1.045 | 1.085 | 1.205 | 1.405 | 1.685 | 2.045 | 2.485 | 3.005 | 3.605 | 4.285 | 5.045 |
| 1.36599999999996 | 1.049 | 1.089 | 1.209 | 1.409 | 1.689 | 2.049 | 2.489 | 3.009 | 3.609 | 4.289 | 5.049 |
| 1.36699999999996 | 1.053 | 1.093 | 1.213 | 1.413 | 1.693 | 2.053 | 2.493 | 3.013 | 3.613 | 4.293 | 5.053 |
| 1.36799999999996 | 1.057 | 1.097 | 1.217 | 1.417 | 1.697 | 2.057 | 2.497 | 3.017 | 3.617 | 4.297 | 5.057 |
| 1.36899999999996 | 1.061 | 1.101 | 1.221 | 1.421 | 1.701 | 2.061 | 2.501 | 3.021 | 3.621 | 4.301 | 5.061 |
| 1.36999999999996 | 1.064 | 1.104 | 1.224 | 1.424 | 1.704 | 2.064 | 2.504 | 3.024 | 3.624 | 4.304 | 5.064 |
| 1.37099999999996 | 1.068 | 1.108 | 1.228 | 1.428 | 1.708 | 2.068 | 2.508 | 3.028 | 3.628 | 4.308 | 5.068 |
| 1.37199999999996 | 1.072 | 1.112 | 1.232 | 1.432 | 1.712 | 2.072 | 2.512 | 3.032 | 3.632 | 4.312 | 5.072 |
| 1.37299999999996 | 1.076 | 1.116 | 1.236 | 1.436 | 1.716 | 2.076 | 2.516 | 3.036 | 3.636 | 4.316 | 5.076 |
| 1.373999999999959 | 1.08 | 1.12 | 1.24 | 1.44 | 1.72 | 2.08 | 2.52 | 3.04 | 3.64 | 4.32 | 5.08 |
| 1.374999999999959 | 1.084 | 1.124 | 1.244 | 1.444 | 1.724 | 2.084 | 2.524 | 3.044 | 3.644 | 4.324 | 5.084 |
| 1.375999999999959 | 1.088 | 1.128 | 1.248 | 1.448 | 1.728 | 2.088 | 2.528 | 3.048 | 3.648 | 4.328 | 5.088 |
| 1.376999999999959 | 1.092 | 1.132 | 1.252 | 1.452 | 1.732 | 2.092 | 2.532 | 3.052 | 3.652 | 4.332 | 5.092 |
| 1.377999999999959 | 1.096 | 1.136 | 1.256 | 1.456 | 1.736 | 2.096 | 2.536 | 3.056 | 3.656 | 4.336 | 5.096 |
| 1.378999999999959 | 1.1 | 1.14 | 1.26 | 1.46 | 1.74 | 2.1 | 2.54 | 3.06 | 3.66 | 4.34 | 5.1 |
| 1.379999999999959 | 1.104 | 1.144 | 1.264 | 1.464 | 1.744 | 2.104 | 2.544 | 3.064 | 3.664 | 4.344 | 5.104 |
| 1.380999999999959 | 1.108 | 1.148 | 1.268 | 1.468 | 1.748 | 2.108 | 2.548 | 3.068 | 3.668 | 4.348 | 5.108 |
| 1.381999999999959 | 1.112 | 1.152 | 1.272 | 1.472 | 1.752 | 2.112 | 2.552 | 3.072 | 3.672 | 4.352 | 5.112 |
| 1.382999999999958 | 1.116 | 1.156 | 1.276 | 1.476 | 1.756 | 2.116 | 2.556 | 3.076 | 3.676 | 4.356 | 5.116 |
| 1.383999999999958 | 1.12 | 1.16 | 1.28 | 1.48 | 1.76 | 2.12 | 2.56 | 3.08 | 3.68 | 4.36 | 5.12 |
| 1.384999999999958 | 1.124 | 1.164 | 1.284 | 1.484 | 1.764 | 2.124 | 2.564 | 3.084 | 3.684 | 4.364 | 5.124 |
| 1.385999999999958 | 1.128 | 1.168 | 1.288 | 1.488 | 1.768 | 2.128 | 2.568 | 3.088 | 3.688 | 4.368 | 5.128 |
| 1.386999999999958 | 1.131 | 1.171 | 1.291 | 1.491 | 1.771 | 2.131 | 2.571 | 3.091 | 3.691 | 4.371 | 5.131 |
| 1.387999999999958 | 1.135 | 1.175 | 1.295 | 1.495 | 1.775 | 2.135 | 2.575 | 3.095 | 3.695 | 4.375 | 5.135 |
| 1.388999999999958 | 1.14 | 1.18 | 1.3 | 1.5 | 1.78 | 2.14 | 2.58 | 3.1 | 3.7 | 4.38 | 5.14 |
| 1.389999999999958 | 1.144 | 1.184 | 1.304 | 1.504 | 1.784 | 2.144 | 2.584 | 3.104 | 3.704 | 4.384 | 5.144 |
| 1.390999999999958 | 1.148 | 1.188 | 1.308 | 1.508 | 1.788 | 2.148 | 2.588 | 3.108 | 3.708 | 4.388 | 5.148 |
| 1.391999999999957 | 1.152 | 1.192 | 1.312 | 1.512 | 1.792 | 2.152 | 2.592 | 3.112 | 3.712 | 4.392 | 5.152 |
| 1.392999999999957 | 1.156 | 1.196 | 1.316 | 1.516 | 1.796 | 2.156 | 2.596 | 3.116 | 3.716 | 4.396 | 5.156 |
| 1.393999999999957 | 1.16 | 1.2 | 1.32 | 1.52 | 1.8 | 2.16 | 2.6 | 3.12 | 3.72 | 4.4 | 5.16 |
| 1.394999999999957 | 1.164 | 1.204 | 1.324 | 1.524 | 1.804 | 2.164 | 2.604 | 3.124 | 3.724 | 4.404 | 5.164 |
| 1.395999999999957 | 1.168 | 1.208 | 1.328 | 1.528 | 1.808 | 2.168 | 2.608 | 3.128 | 3.728 | 4.408 | 5.168 |
| 1.396999999999957 | 1.172 | 1.212 | 1.332 | 1.532 | 1.812 | 2.172 | 2.612 | 3.132 | 3.732 | 4.412 | 5.172 |
| 1.397999999999957 | 1.176 | 1.216 | 1.336 | 1.536 | 1.816 | 2.176 | 2.616 | 3.136 | 3.736 | 4.416 | 5.176 |
| 1.398999999999957 | 1.18 | 1.22 | 1.34 | 1.54 | 1.82 | 2.18 | 2.62 | 3.14 | 3.74 | 4.42 | 5.18 |
| 1.399999999999957 | 1.184 | 1.224 | 1.344 | 1.544 | 1.824 | 2.184 | 2.624 | 3.144 | 3.744 | 4.424 | 5.184 |
| 1.400999999999956 | 1.188 | 1.228 | 1.348 | 1.548 | 1.828 | 2.188 | 2.628 | 3.148 | 3.748 | 4.428 | 5.188 |
| 1.401999999999956 | 1.192 | 1.232 | 1.352 | 1.552 | 1.832 | 2.192 | 2.632 | 3.152 | 3.752 | 4.432 | 5.192 |
| 1.402999999999956 | 1.196 | 1.236 | 1.356 | 1.556 | 1.836 | 2.196 | 2.636 | 3.156 | 3.756 | 4.436 | 5.196 |
| 1.403999999999956 | 1.2 | 1.24 | 1.36 | 1.56 | 1.84 | 2.2 | 2.64 | 3.16 | 3.76 | 4.44 | 5.2 |
| 1.404999999999956 | 1.204 | 1.244 | 1.364 | 1.564 | 1.844 | 2.204 | 2.644 | 3.164 | 3.764 | 4.444 | 5.204 |
| 1.405999999999956 | 1.209 | 1.249 | 1.369 | 1.569 | 1.849 | 2.209 | 2.649 | 3.169 | 3.769 | 4.449 | 5.209 |
| 1.406999999999956 | 1.213 | 1.253 | 1.373 | 1.573 | 1.853 | 2.213 | 2.653 | 3.173 | 3.773 | 4.453 | 5.213 |
| 1.407999999999956 | 1.217 | 1.257 | 1.377 | 1.577 | 1.857 | 2.217 | 2.657 | 3.177 | 3.777 | 4.457 | 5.217 |
| 1.408999999999956 | 1.221 | 1.261 | 1.381 | 1.581 | 1.861 | 2.221 | 2.661 | 3.181 | 3.781 | 4.461 | 5.221 |
| 1.409999999999955 | 1.225 | 1.265 | 1.385 | 1.585 | 1.865 | 2.225 | 2.665 | 3.185 | 3.785 | 4.465 | 5.225 |
| 1.410999999999955 | 1.229 | 1.269 | 1.389 | 1.589 | 1.869 | 2.229 | 2.669 | 3.189 | 3.789 | 4.469 | 5.229 |
| 1.411999999999955 | 1.233 | 1.273 | 1.393 | 1.593 | 1.873 | 2.233 | 2.673 | 3.193 | 3.793 | 4.473 | 5.233 |
| 1.412999999999955 | 1.238 | 1.278 | 1.398 | 1.598 | 1.878 | 2.238 | 2.678 | 3.198 | 3.798 | 4.478 | 5.238 |
| 1.413999999999955 | 1.242 | 1.282 | 1.402 | 1.602 | 1.882 | 2.242 | 2.682 | 3.202 | 3.802 | 4.482 | 5.242 |
| 1.414999999999955 | 1.246 | 1.286 | 1.406 | 1.606 | 1.886 | 2.246 | 2.686 | 3.206 | 3.806 | 4.486 | 5.246 |
| 1.415999999999955 | 1.25 | 1.29 | 1.41 | 1.61 | 1.89 | 2.25 | 2.69 | 3.21 | 3.81 | 4.49 | 5.25 |
| 1.416999999999955 | 1.254 | 1.294 | 1.414 | 1.614 | 1.894 | 2.254 | 2.694 | 3.214 | 3.814 | 4.494 | 5.254 |
| 1.417999999999955 | 1.258 | 1.298 | 1.418 | 1.618 | 1.898 | 2.258 | 2.698 | 3.218 | 3.818 | 4.498 | 5.258 |
| 1.418999999999954 | 1.263 | 1.303 | 1.423 | 1.623 | 1.903 | 2.263 | 2.703 | 3.223 | 3.823 | 4.503 | 5.263 |
| 1.419999999999954 | 1.267 | 1.307 | 1.427 | 1.627 | 1.907 | 2.267 | 2.707 | 3.227 | 3.827 | 4.507 | 5.267 |
| 1.420999999999954 | 1.271 | 1.311 | 1.431 | 1.631 | 1.911 | 2.271 | 2.711 | 3.231 | 3.831 | 4.511 | 5.271 |
| 1.421999999999954 | 1.275 | 1.315 | 1.435 | 1.635 | 1.915 | 2.275 | 2.715 | 3.235 | 3.835 | 4.515 | 5.275 |
| 1.422999999999954 | 1.28 | 1.32 | 1.44 | 1.64 | 1.92 | 2.28 | 2.72 | 3.24 | 3.84 | 4.52 | 5.28 |
| 1.423999999999954 | 1.284 | 1.324 | 1.444 | 1.644 | 1.924 | 2.284 | 2.724 | 3.244 | 3.844 | 4.524 | 5.284 |
| 1.424999999999954 | 1.288 | 1.328 | 1.448 | 1.648 | 1.928 | 2.288 | 2.728 | 3.248 | 3.848 | 4.528 | 5.288 |
| 1.425999999999954 | 1.292 | 1.332 | 1.452 | 1.652 | 1.932 | 2.292 | 2.732 | 3.252 | 3.852 | 4.532 | 5.292 |
| 1.426999999999954 | 1.297 | 1.337 | 1.457 | 1.657 | 1.937 | 2.297 | 2.737 | 3.257 | 3.857 | 4.537 | 5.297 |
| 1.427999999999954 | 1.301 | 1.341 | 1.461 | 1.661 | 1.941 | 2.301 | 2.741 | 3.261 | 3.861 | 4.541 | 5.301 |
| 1.428999999999953 | 1.305 | 1.345 | 1.465 | 1.665 | 1.945 | 2.305 | 2.745 | 3.265 | 3.865 | 4.545 | 5.305 |
| 1.429999999999953 | 1.309 | 1.349 | 1.469 | 1.669 | 1.949 | 2.309 | 2.749 | 3.269 | 3.869 | 4.549 | 5.309 |
| 1.430999999999953 | 1.314 | 1.354 | 1.474 | 1.674 | 1.954 | 2.314 | 2.754 | 3.274 | 3.874 | 4.554 | 5.314 |
| 1.431999999999953 | 1.318 | 1.358 | 1.478 | 1.678 | 1.958 | 2.318 | 2.758 | 3.278 | 3.878 | 4.558 | 5.318 |
| 1.432999999999953 | 1.322 | 1.362 | 1.482 | 1.682 | 1.962 | 2.322 | 2.762 | 3.282 | 3.882 | 4.562 | 5.322 |
| 1.433999999999953 | 1.326 | 1.366 | 1.486 | 1.686 | 1.966 | 2.326 | 2.766 | 3.286 | 3.886 | 4.566 | 5.326 |
| 1.434999999999953 | 1.331 | 1.371 | 1.491 | 1.691 | 1.971 | 2.331 | 2.771 | 3.291 | 3.891 | 4.571 | 5.331 |
| 1.435999999999953 | 1.335 | 1.375 | 1.495 | 1.695 | 1.975 | 2.335 | 2.775 | 3.295 | 3.895 | 4.575 | 5.335 |
| 1.436999999999953 | 1.339 | 1.379 | 1.499 | 1.699 | 1.979 | 2.339 | 2.779 | 3.299 | 3.899 | 4.579 | 5.339 |
| 1.437999999999952 | 1.344 | 1.384 | 1.504 | 1.704 | 1.984 | 2.344 | 2.784 | 3.304 | 3.904 | 4.584 | 5.344 |
| 1.438999999999952 | 1.348 | 1.388 | 1.508 | 1.708 | 1.988 | 2.348 | 2.788 | 3.308 | 3.908 | 4.588 | 5.348 |
| 1.439999999999952 | 1.352 | 1.392 | 1.512 | 1.712 | 1.992 | 2.352 | 2.792 | 3.312 | 3.912 | 4.592 | 5.352 |
| 1.440999999999952 | 1.357 | 1.397 | 1.517 | 1.717 | 1.997 | 2.357 | 2.797 | 3.317 | 3.917 | 4.597 | 5.357 |
| 1.441999999999952 | 1.361 | 1.401 | 1.521 | 1.721 | 2.001 | 2.361 | 2.801 | 3.321 | 3.921 | 4.601 | 5.361 |
| 1.442999999999952 | 1.365 | 1.405 | 1.525 | 1.725 | 2.005 | 2.365 | 2.805 | 3.325 | 3.925 | 4.605 | 5.365 |
| 1.443999999999952 | 1.37 | 1.41 | 1.53 | 1.73 | 2.01 | 2.37 | 2.81 | 3.33 | 3.93 | 4.61 | 5.37 |
| 1.444999999999952 | 1.374 | 1.414 | 1.534 | 1.734 | 2.014 | 2.374 | 2.814 | 3.334 | 3.934 | 4.614 | 5.374 |
| 1.445999999999952 | 1.379 | 1.419 | 1.539 | 1.739 | 2.019 | 2.379 | 2.819 | 3.339 | 3.939 | 4.619 | 5.379 |
| 1.446999999999951 | 1.383 | 1.423 | 1.543 | 1.743 | 2.023 | 2.383 | 2.823 | 3.343 | 3.943 | 4.623 | 5.383 |
| 1.447999999999951 | 1.387 | 1.427 | 1.547 | 1.747 | 2.027 | 2.387 | 2.827 | 3.347 | 3.947 | 4.627 | 5.387 |
| 1.448999999999951 | 1.392 | 1.432 | 1.552 | 1.752 | 2.032 | 2.392 | 2.832 | 3.352 | 3.952 | 4.632 | 5.392 |
| 1.449999999999951 | 1.396 | 1.436 | 1.556 | 1.756 | 2.036 | 2.396 | 2.836 | 3.356 | 3.956 | 4.636 | 5.396 |
| 1.450999999999951 | 1.401 | 1.441 | 1.561 | 1.761 | 2.041 | 2.401 | 2.841 | 3.361 | 3.961 | 4.641 | 5.401 |
| 1.451999999999951 | 1.405 | 1.445 | 1.565 | 1.765 | 2.045 | 2.405 | 2.845 | 3.365 | 3.965 | 4.645 | 5.405 |
| 1.452999999999951 | 1.409 | 1.449 | 1.569 | 1.769 | 2.049 | 2.409 | 2.849 | 3.369 | 3.969 | 4.649 | 5.409 |
| 1.453999999999951 | 1.414 | 1.454 | 1.574 | 1.774 | 2.054 | 2.414 | 2.854 | 3.374 | 3.974 | 4.654 | 5.414 |
| 1.454999999999951 | 1.418 | 1.458 | 1.578 | 1.778 | 2.058 | 2.418 | 2.858 | 3.378 | 3.978 | 4.658 | 5.418 |
| 1.45599999999995 | 1.423 | 1.463 | 1.583 | 1.783 | 2.063 | 2.423 | 2.863 | 3.383 | 3.983 | 4.663 | 5.423 |
| 1.45699999999995 | 1.427 | 1.467 | 1.587 | 1.787 | 2.067 | 2.427 | 2.867 | 3.387 | 3.987 | 4.667 | 5.427 |
| 1.45799999999995 | 1.432 | 1.472 | 1.592 | 1.792 | 2.072 | 2.432 | 2.872 | 3.392 | 3.992 | 4.672 | 5.432 |
| 1.45899999999995 | 1.436 | 1.476 | 1.596 | 1.796 | 2.076 | 2.436 | 2.876 | 3.396 | 3.996 | 4.676 | 5.436 |
| 1.45999999999995 | 1.441 | 1.481 | 1.601 | 1.801 | 2.081 | 2.441 | 2.881 | 3.401 | 4.001 | 4.681 | 5.441 |
| 1.46099999999995 | 1.445 | 1.485 | 1.605 | 1.805 | 2.085 | 2.445 | 2.885 | 3.405 | 4.005 | 4.685 | 5.445 |
| 1.46199999999995 | 1.449 | 1.489 | 1.609 | 1.809 | 2.089 | 2.449 | 2.889 | 3.409 | 4.009 | 4.689 | 5.449 |
| 1.46299999999995 | 1.454 | 1.494 | 1.614 | 1.814 | 2.094 | 2.454 | 2.894 | 3.414 | 4.014 | 4.694 | 5.454 |
| 1.46399999999995 | 1.458 | 1.498 | 1.618 | 1.818 | 2.098 | 2.458 | 2.898 | 3.418 | 4.018 | 4.698 | 5.458 |
| 1.464999999999949 | 1.463 | 1.503 | 1.623 | 1.823 | 2.103 | 2.463 | 2.903 | 3.423 | 4.023 | 4.703 | 5.463 |
| 1.465999999999949 | 1.468 | 1.508 | 1.628 | 1.828 | 2.108 | 2.468 | 2.908 | 3.428 | 4.028 | 4.708 | 5.468 |
| 1.466999999999949 | 1.472 | 1.512 | 1.632 | 1.832 | 2.112 | 2.472 | 2.912 | 3.432 | 4.032 | 4.712 | 5.472 |
| 1.467999999999949 | 1.477 | 1.517 | 1.637 | 1.837 | 2.117 | 2.477 | 2.917 | 3.437 | 4.037 | 4.717 | 5.477 |
| 1.468999999999949 | 1.481 | 1.521 | 1.641 | 1.841 | 2.121 | 2.481 | 2.921 | 3.441 | 4.041 | 4.721 | 5.481 |
| 1.469999999999949 | 1.486 | 1.526 | 1.646 | 1.846 | 2.126 | 2.486 | 2.926 | 3.446 | 4.046 | 4.726 | 5.486 |
| 1.470999999999949 | 1.49 | 1.53 | 1.65 | 1.85 | 2.13 | 2.49 | 2.93 | 3.45 | 4.05 | 4.73 | 5.49 |
| 1.471999999999949 | 1.495 | 1.535 | 1.655 | 1.855 | 2.135 | 2.495 | 2.935 | 3.455 | 4.055 | 4.735 | 5.495 |
| 1.472999999999949 | 1.499 | 1.539 | 1.659 | 1.859 | 2.139 | 2.499 | 2.939 | 3.459 | 4.059 | 4.739 | 5.499 |
| 1.473999999999948 | 1.504 | 1.544 | 1.664 | 1.864 | 2.144 | 2.504 | 2.944 | 3.464 | 4.064 | 4.744 | 5.504 |
| 1.474999999999948 | 1.508 | 1.548 | 1.668 | 1.868 | 2.148 | 2.508 | 2.948 | 3.468 | 4.068 | 4.748 | 5.508 |
| 1.475999999999948 | 1.513 | 1.553 | 1.673 | 1.873 | 2.153 | 2.513 | 2.953 | 3.473 | 4.073 | 4.753 | 5.513 |
| 1.476999999999948 | 1.518 | 1.558 | 1.678 | 1.878 | 2.158 | 2.518 | 2.958 | 3.478 | 4.078 | 4.758 | 5.518 |
| 1.477999999999948 | 1.522 | 1.562 | 1.682 | 1.882 | 2.162 | 2.522 | 2.962 | 3.482 | 4.082 | 4.762 | 5.522 |
| 1.478999999999948 | 1.527 | 1.567 | 1.687 | 1.887 | 2.167 | 2.527 | 2.967 | 3.487 | 4.087 | 4.767 | 5.527 |
| 1.479999999999948 | 1.531 | 1.571 | 1.691 | 1.891 | 2.171 | 2.531 | 2.971 | 3.491 | 4.091 | 4.771 | 5.531 |
| 1.480999999999948 | 1.536 | 1.576 | 1.696 | 1.896 | 2.176 | 2.536 | 2.976 | 3.496 | 4.096 | 4.776 | 5.536 |
| 1.481999999999948 | 1.541 | 1.581 | 1.701 | 1.901 | 2.181 | 2.541 | 2.981 | 3.501 | 4.101 | 4.781 | 5.541 |
| 1.482999999999947 | 1.545 | 1.585 | 1.705 | 1.905 | 2.185 | 2.545 | 2.985 | 3.505 | 4.105 | 4.785 | 5.545 |
| 1.483999999999947 | 1.55 | 1.59 | 1.71 | 1.91 | 2.19 | 2.55 | 2.99 | 3.51 | 4.11 | 4.79 | 5.55 |
| 1.484999999999947 | 1.555 | 1.595 | 1.715 | 1.915 | 2.195 | 2.555 | 2.995 | 3.515 | 4.115 | 4.795 | 5.555 |
| 1.485999999999947 | 1.559 | 1.599 | 1.719 | 1.919 | 2.199 | 2.559 | 2.999 | 3.519 | 4.119 | 4.799 | 5.559 |
| 1.486999999999947 | 1.564 | 1.604 | 1.724 | 1.924 | 2.204 | 2.564 | 3.004 | 3.524 | 4.124 | 4.804 | 5.564 |
| 1.487999999999947 | 1.569 | 1.609 | 1.729 | 1.929 | 2.209 | 2.569 | 3.009 | 3.529 | 4.129 | 4.809 | 5.569 |
| 1.488999999999947 | 1.573 | 1.613 | 1.733 | 1.933 | 2.213 | 2.573 | 3.013 | 3.533 | 4.133 | 4.813 | 5.573 |
| 1.489999999999947 | 1.578 | 1.618 | 1.738 | 1.938 | 2.218 | 2.578 | 3.018 | 3.538 | 4.138 | 4.818 | 5.578 |
| 1.490999999999947 | 1.583 | 1.623 | 1.743 | 1.943 | 2.223 | 2.583 | 3.023 | 3.543 | 4.143 | 4.823 | 5.583 |
| 1.491999999999946 | 1.587 | 1.627 | 1.747 | 1.947 | 2.227 | 2.587 | 3.027 | 3.547 | 4.147 | 4.827 | 5.587 |
| 1.492999999999946 | 1.592 | 1.632 | 1.752 | 1.952 | 2.232 | 2.592 | 3.032 | 3.552 | 4.152 | 4.832 | 5.592 |
| 1.493999999999946 | 1.597 | 1.637 | 1.757 | 1.957 | 2.237 | 2.597 | 3.037 | 3.557 | 4.157 | 4.837 | 5.597 |
| 1.494999999999946 | 1.601 | 1.641 | 1.761 | 1.961 | 2.241 | 2.601 | 3.041 | 3.561 | 4.161 | 4.841 | 5.601 |
| 1.495999999999946 | 1.606 | 1.646 | 1.766 | 1.966 | 2.246 | 2.606 | 3.046 | 3.566 | 4.166 | 4.846 | 5.606 |
| 1.496999999999946 | 1.611 | 1.651 | 1.771 | 1.971 | 2.251 | 2.611 | 3.051 | 3.571 | 4.171 | 4.851 | 5.611 |
| 1.497999999999946 | 1.616 | 1.656 | 1.776 | 1.976 | 2.256 | 2.616 | 3.056 | 3.576 | 4.176 | 4.856 | 5.616 |
| 1.498999999999946 | 1.62 | 1.66 | 1.78 | 1.98 | 2.26 | 2.62 | 3.06 | 3.58 | 4.18 | 4.86 | 5.62 |
| 1.499999999999946 | 1.625 | 1.665 | 1.785 | 1.985 | 2.265 | 2.625 | 3.065 | 3.585 | 4.185 | 4.865 | 5.625 |
| 1.500999999999945 | 1.63 | 1.67 | 1.79 | 1.99 | 2.27 | 2.63 | 3.07 | 3.59 | 4.19 | 4.87 | 5.63 |
| 1.501999999999945 | 1.635 | 1.675 | 1.795 | 1.995 | 2.275 | 2.635 | 3.075 | 3.595 | 4.195 | 4.875 | 5.635 |
| 1.502999999999945 | 1.639 | 1.679 | 1.799 | 1.999 | 2.279 | 2.639 | 3.079 | 3.599 | 4.199 | 4.879 | 5.639 |
| 1.503999999999945 | 1.644 | 1.684 | 1.804 | 2.004 | 2.284 | 2.644 | 3.084 | 3.604 | 4.204 | 4.884 | 5.644 |
| 1.504999999999945 | 1.649 | 1.689 | 1.809 | 2.009 | 2.289 | 2.649 | 3.089 | 3.609 | 4.209 | 4.889 | 5.649 |
| 1.505999999999945 | 1.654 | 1.694 | 1.814 | 2.014 | 2.294 | 2.654 | 3.094 | 3.614 | 4.214 | 4.894 | 5.654 |
| 1.506999999999945 | 1.658 | 1.698 | 1.818 | 2.018 | 2.298 | 2.658 | 3.098 | 3.618 | 4.218 | 4.898 | 5.658 |
| 1.507999999999945 | 1.663 | 1.703 | 1.823 | 2.023 | 2.303 | 2.663 | 3.103 | 3.623 | 4.223 | 4.903 | 5.663 |
| 1.508999999999945 | 1.668 | 1.708 | 1.828 | 2.028 | 2.308 | 2.668 | 3.108 | 3.628 | 4.228 | 4.908 | 5.668 |
| 1.509999999999944 | 1.673 | 1.713 | 1.833 | 2.033 | 2.313 | 2.673 | 3.113 | 3.633 | 4.233 | 4.913 | 5.673 |
| 1.510999999999944 | 1.678 | 1.718 | 1.838 | 2.038 | 2.318 | 2.678 | 3.118 | 3.638 | 4.238 | 4.918 | 5.678 |
| 1.511999999999944 | 1.683 | 1.723 | 1.843 | 2.043 | 2.323 | 2.683 | 3.123 | 3.643 | 4.243 | 4.923 | 5.683 |
| 1.512999999999944 | 1.687 | 1.727 | 1.847 | 2.047 | 2.327 | 2.687 | 3.127 | 3.647 | 4.247 | 4.927 | 5.687 |
| 1.513999999999944 | 1.692 | 1.732 | 1.852 | 2.052 | 2.332 | 2.692 | 3.132 | 3.652 | 4.252 | 4.932 | 5.692 |
| 1.514999999999944 | 1.697 | 1.737 | 1.857 | 2.057 | 2.337 | 2.697 | 3.137 | 3.657 | 4.257 | 4.937 | 5.697 |
| 1.515999999999944 | 1.702 | 1.742 | 1.862 | 2.062 | 2.342 | 2.702 | 3.142 | 3.662 | 4.262 | 4.942 | 5.702 |
| 1.516999999999944 | 1.707 | 1.747 | 1.867 | 2.067 | 2.347 | 2.707 | 3.147 | 3.667 | 4.267 | 4.947 | 5.707 |
| 1.517999999999944 | 1.712 | 1.752 | 1.872 | 2.072 | 2.352 | 2.712 | 3.152 | 3.672 | 4.272 | 4.952 | 5.712 |
| 1.518999999999944 | 1.717 | 1.757 | 1.877 | 2.077 | 2.357 | 2.717 | 3.157 | 3.677 | 4.277 | 4.957 | 5.717 |
| 1.519999999999943 | 1.721 | 1.761 | 1.881 | 2.081 | 2.361 | 2.721 | 3.161 | 3.681 | 4.281 | 4.961 | 5.721 |
| 1.520999999999943 | 1.726 | 1.766 | 1.886 | 2.086 | 2.366 | 2.726 | 3.166 | 3.686 | 4.286 | 4.966 | 5.726 |
| 1.521999999999943 | 1.731 | 1.771 | 1.891 | 2.091 | 2.371 | 2.731 | 3.171 | 3.691 | 4.291 | 4.971 | 5.731 |
| 1.522999999999943 | 1.736 | 1.776 | 1.896 | 2.096 | 2.376 | 2.736 | 3.176 | 3.696 | 4.296 | 4.976 | 5.736 |
| 1.523999999999943 | 1.741 | 1.781 | 1.901 | 2.101 | 2.381 | 2.741 | 3.181 | 3.701 | 4.301 | 4.981 | 5.741 |
| 1.524999999999943 | 1.746 | 1.786 | 1.906 | 2.106 | 2.386 | 2.746 | 3.186 | 3.706 | 4.306 | 4.986 | 5.746 |
| 1.525999999999943 | 1.751 | 1.791 | 1.911 | 2.111 | 2.391 | 2.751 | 3.191 | 3.711 | 4.311 | 4.991 | 5.751 |
| 1.526999999999943 | 1.756 | 1.796 | 1.916 | 2.116 | 2.396 | 2.756 | 3.196 | 3.716 | 4.316 | 4.996 | 5.756 |
| 1.527999999999943 | 1.761 | 1.801 | 1.921 | 2.121 | 2.401 | 2.761 | 3.201 | 3.721 | 4.321 | 5.001 | 5.761 |
| 1.528999999999942 | 1.766 | 1.806 | 1.926 | 2.126 | 2.406 | 2.766 | 3.206 | 3.726 | 4.326 | 5.006 | 5.766 |
| 1.529999999999942 | 1.771 | 1.811 | 1.931 | 2.131 | 2.411 | 2.771 | 3.211 | 3.731 | 4.331 | 5.011 | 5.771 |
| 1.530999999999942 | 1.776 | 1.816 | 1.936 | 2.136 | 2.416 | 2.776 | 3.216 | 3.736 | 4.336 | 5.016 | 5.776 |
| 1.531999999999942 | 1.781 | 1.821 | 1.941 | 2.141 | 2.421 | 2.781 | 3.221 | 3.741 | 4.341 | 5.021 | 5.781 |
| 1.532999999999942 | 1.786 | 1.826 | 1.946 | 2.146 | 2.426 | 2.786 | 3.226 | 3.746 | 4.346 | 5.026 | 5.786 |
| 1.533999999999942 | 1.791 | 1.831 | 1.951 | 2.151 | 2.431 | 2.791 | 3.231 | 3.751 | 4.351 | 5.031 | 5.791 |
| 1.534999999999942 | 1.796 | 1.836 | 1.956 | 2.156 | 2.436 | 2.796 | 3.236 | 3.756 | 4.356 | 5.036 | 5.796 |
| 1.535999999999942 | 1.801 | 1.841 | 1.961 | 2.161 | 2.441 | 2.801 | 3.241 | 3.761 | 4.361 | 5.041 | 5.801 |
| 1.536999999999942 | 1.806 | 1.846 | 1.966 | 2.166 | 2.446 | 2.806 | 3.246 | 3.766 | 4.366 | 5.046 | 5.806 |
| 1.537999999999941 | 1.811 | 1.851 | 1.971 | 2.171 | 2.451 | 2.811 | 3.251 | 3.771 | 4.371 | 5.051 | 5.811 |
| 1.538999999999941 | 1.816 | 1.856 | 1.976 | 2.176 | 2.456 | 2.816 | 3.256 | 3.776 | 4.376 | 5.056 | 5.816 |
| 1.539999999999941 | 1.821 | 1.861 | 1.981 | 2.181 | 2.461 | 2.821 | 3.261 | 3.781 | 4.381 | 5.061 | 5.821 |
| 1.540999999999941 | 1.826 | 1.866 | 1.986 | 2.186 | 2.466 | 2.826 | 3.266 | 3.786 | 4.386 | 5.066 | 5.826 |
| 1.541999999999941 | 1.831 | 1.871 | 1.991 | 2.191 | 2.471 | 2.831 | 3.271 | 3.791 | 4.391 | 5.071 | 5.831 |
| 1.542999999999941 | 1.836 | 1.876 | 1.996 | 2.196 | 2.476 | 2.836 | 3.276 | 3.796 | 4.396 | 5.076 | 5.836 |
| 1.543999999999941 | 1.841 | 1.881 | 2.001 | 2.201 | 2.481 | 2.841 | 3.281 | 3.801 | 4.401 | 5.081 | 5.841 |
| 1.544999999999941 | 1.846 | 1.886 | 2.006 | 2.206 | 2.486 | 2.846 | 3.286 | 3.806 | 4.406 | 5.086 | 5.846 |
| 1.545999999999941 | 1.851 | 1.891 | 2.011 | 2.211 | 2.491 | 2.851 | 3.291 | 3.811 | 4.411 | 5.091 | 5.851 |
| 1.54699999999994 | 1.856 | 1.896 | 2.016 | 2.216 | 2.496 | 2.856 | 3.296 | 3.816 | 4.416 | 5.096 | 5.856 |
| 1.54799999999994 | 1.861 | 1.901 | 2.021 | 2.221 | 2.501 | 2.861 | 3.301 | 3.821 | 4.421 | 5.101 | 5.861 |
| 1.54899999999994 | 1.866 | 1.906 | 2.026 | 2.226 | 2.506 | 2.866 | 3.306 | 3.826 | 4.426 | 5.106 | 5.866 |
| 1.54999999999994 | 1.871 | 1.911 | 2.031 | 2.231 | 2.511 | 2.871 | 3.311 | 3.831 | 4.431 | 5.111 | 5.871 |
| 1.55099999999994 | 1.876 | 1.916 | 2.036 | 2.236 | 2.516 | 2.876 | 3.316 | 3.836 | 4.436 | 5.116 | 5.876 |
| 1.55199999999994 | 1.882 | 1.922 | 2.042 | 2.242 | 2.522 | 2.882 | 3.322 | 3.842 | 4.442 | 5.122 | 5.882 |
| 1.55299999999994 | 1.887 | 1.927 | 2.047 | 2.247 | 2.527 | 2.887 | 3.327 | 3.847 | 4.447 | 5.127 | 5.887 |
| 1.55399999999994 | 1.892 | 1.932 | 2.052 | 2.252 | 2.532 | 2.892 | 3.332 | 3.852 | 4.452 | 5.132 | 5.892 |
| 1.55499999999994 | 1.897 | 1.937 | 2.057 | 2.257 | 2.537 | 2.897 | 3.337 | 3.857 | 4.457 | 5.137 | 5.897 |
| 1.555999999999939 | 1.902 | 1.942 | 2.062 | 2.262 | 2.542 | 2.902 | 3.342 | 3.862 | 4.462 | 5.142 | 5.902 |
| 1.556999999999939 | 1.907 | 1.947 | 2.067 | 2.267 | 2.547 | 2.907 | 3.347 | 3.867 | 4.467 | 5.147 | 5.907 |
| 1.557999999999939 | 1.912 | 1.952 | 2.072 | 2.272 | 2.552 | 2.912 | 3.352 | 3.872 | 4.472 | 5.152 | 5.912 |
| 1.558999999999939 | 1.918 | 1.958 | 2.078 | 2.278 | 2.558 | 2.918 | 3.358 | 3.878 | 4.478 | 5.158 | 5.918 |
| 1.559999999999939 | 1.923 | 1.963 | 2.083 | 2.283 | 2.563 | 2.923 | 3.363 | 3.883 | 4.483 | 5.163 | 5.923 |
| 1.560999999999939 | 1.928 | 1.968 | 2.088 | 2.288 | 2.568 | 2.928 | 3.368 | 3.888 | 4.488 | 5.168 | 5.928 |
| 1.561999999999939 | 1.933 | 1.973 | 2.093 | 2.293 | 2.573 | 2.933 | 3.373 | 3.893 | 4.493 | 5.173 | 5.933 |
| 1.562999999999939 | 1.938 | 1.978 | 2.098 | 2.298 | 2.578 | 2.938 | 3.378 | 3.898 | 4.498 | 5.178 | 5.938 |
| 1.563999999999939 | 1.944 | 1.984 | 2.104 | 2.304 | 2.584 | 2.944 | 3.384 | 3.904 | 4.504 | 5.184 | 5.944 |
| 1.564999999999938 | 1.949 | 1.989 | 2.109 | 2.309 | 2.589 | 2.949 | 3.389 | 3.909 | 4.509 | 5.189 | 5.949 |
| 1.565999999999938 | 1.954 | 1.994 | 2.114 | 2.314 | 2.594 | 2.954 | 3.394 | 3.914 | 4.514 | 5.194 | 5.954 |
| 1.566999999999938 | 1.959 | 1.999 | 2.119 | 2.319 | 2.599 | 2.959 | 3.399 | 3.919 | 4.519 | 5.199 | 5.959 |
| 1.567999999999938 | 1.964 | 2.004 | 2.124 | 2.324 | 2.604 | 2.964 | 3.404 | 3.924 | 4.524 | 5.204 | 5.964 |
| 1.568999999999938 | 1.97 | 2.01 | 2.13 | 2.33 | 2.61 | 2.97 | 3.41 | 3.93 | 4.53 | 5.21 | 5.97 |
| 1.569999999999938 | 1.975 | 2.015 | 2.135 | 2.335 | 2.615 | 2.975 | 3.415 | 3.935 | 4.535 | 5.215 | 5.975 |
| 1.570999999999938 | 1.98 | 2.02 | 2.14 | 2.34 | 2.62 | 2.98 | 3.42 | 3.94 | 4.54 | 5.22 | 5.98 |
| 1.571999999999938 | 1.986 | 2.026 | 2.146 | 2.346 | 2.626 | 2.986 | 3.426 | 3.946 | 4.546 | 5.226 | 5.986 |
| 1.572999999999938 | 1.991 | 2.031 | 2.151 | 2.351 | 2.631 | 2.991 | 3.431 | 3.951 | 4.551 | 5.231 | 5.991 |
| 1.573999999999937 | 1.996 | 2.036 | 2.156 | 2.356 | 2.636 | 2.996 | 3.436 | 3.956 | 4.556 | 5.236 | 5.996 |
| 1.574999999999937 | 2.001 | 2.041 | 2.161 | 2.361 | 2.641 | 3.001 | 3.441 | 3.961 | 4.561 | 5.241 | 6.001 |
| 1.575999999999937 | 2.007 | 2.047 | 2.167 | 2.367 | 2.647 | 3.007 | 3.447 | 3.967 | 4.567 | 5.247 | 6.007 |
| 1.576999999999937 | 2.012 | 2.052 | 2.172 | 2.372 | 2.652 | 3.012 | 3.452 | 3.972 | 4.572 | 5.252 | 6.012 |
| 1.577999999999937 | 2.017 | 2.057 | 2.177 | 2.377 | 2.657 | 3.017 | 3.457 | 3.977 | 4.577 | 5.257 | 6.017 |
| 1.578999999999937 | 2.023 | 2.063 | 2.183 | 2.383 | 2.663 | 3.023 | 3.463 | 3.983 | 4.583 | 5.263 | 6.023 |
| 1.579999999999937 | 2.028 | 2.068 | 2.188 | 2.388 | 2.668 | 3.028 | 3.468 | 3.988 | 4.588 | 5.268 | 6.028 |
| 1.580999999999937 | 2.033 | 2.073 | 2.193 | 2.393 | 2.673 | 3.033 | 3.473 | 3.993 | 4.593 | 5.273 | 6.033 |
| 1.581999999999937 | 2.039 | 2.079 | 2.199 | 2.399 | 2.679 | 3.039 | 3.479 | 3.999 | 4.599 | 5.279 | 6.039 |
| 1.582999999999936 | 2.044 | 2.084 | 2.204 | 2.404 | 2.684 | 3.044 | 3.484 | 4.004 | 4.604 | 5.284 | 6.044 |
| 1.583999999999936 | 2.049 | 2.089 | 2.209 | 2.409 | 2.689 | 3.049 | 3.489 | 4.009 | 4.609 | 5.289 | 6.049 |
| 1.584999999999936 | 2.055 | 2.095 | 2.215 | 2.415 | 2.695 | 3.055 | 3.495 | 4.015 | 4.615 | 5.295 | 6.055 |
| 1.585999999999936 | 2.06 | 2.1 | 2.22 | 2.42 | 2.7 | 3.06 | 3.5 | 4.02 | 4.62 | 5.3 | 6.06 |
| 1.586999999999936 | 2.065 | 2.105 | 2.225 | 2.425 | 2.705 | 3.065 | 3.505 | 4.025 | 4.625 | 5.305 | 6.065 |
| 1.587999999999936 | 2.071 | 2.111 | 2.231 | 2.431 | 2.711 | 3.071 | 3.511 | 4.031 | 4.631 | 5.311 | 6.071 |
| 1.588999999999936 | 2.076 | 2.116 | 2.236 | 2.436 | 2.716 | 3.076 | 3.516 | 4.036 | 4.636 | 5.316 | 6.076 |
| 1.589999999999936 | 2.082 | 2.122 | 2.242 | 2.442 | 2.722 | 3.082 | 3.522 | 4.042 | 4.642 | 5.322 | 6.082 |
| 1.590999999999936 | 2.087 | 2.127 | 2.247 | 2.447 | 2.727 | 3.087 | 3.527 | 4.047 | 4.647 | 5.327 | 6.087 |
| 1.591999999999935 | 2.092 | 2.132 | 2.252 | 2.452 | 2.732 | 3.092 | 3.532 | 4.052 | 4.652 | 5.332 | 6.092 |
| 1.592999999999935 | 2.098 | 2.138 | 2.258 | 2.458 | 2.738 | 3.098 | 3.538 | 4.058 | 4.658 | 5.338 | 6.098 |
| 1.593999999999935 | 2.103 | 2.143 | 2.263 | 2.463 | 2.743 | 3.103 | 3.543 | 4.063 | 4.663 | 5.343 | 6.103 |
| 1.594999999999935 | 2.109 | 2.149 | 2.269 | 2.469 | 2.749 | 3.109 | 3.549 | 4.069 | 4.669 | 5.349 | 6.109 |
| 1.595999999999935 | 2.114 | 2.154 | 2.274 | 2.474 | 2.754 | 3.114 | 3.554 | 4.074 | 4.674 | 5.354 | 6.114 |
| 1.596999999999935 | 2.12 | 2.16 | 2.28 | 2.48 | 2.76 | 3.12 | 3.56 | 4.08 | 4.68 | 5.36 | 6.12 |
| 1.597999999999935 | 2.125 | 2.165 | 2.285 | 2.485 | 2.765 | 3.125 | 3.565 | 4.085 | 4.685 | 5.365 | 6.125 |
| 1.598999999999935 | 2.131 | 2.171 | 2.291 | 2.491 | 2.771 | 3.131 | 3.571 | 4.091 | 4.691 | 5.371 | 6.131 |
| 1.599999999999935 | 2.136 | 2.176 | 2.296 | 2.496 | 2.776 | 3.136 | 3.576 | 4.096 | 4.696 | 5.376 | 6.136 |
| 1.600999999999934 | 2.141 | 2.181 | 2.301 | 2.501 | 2.781 | 3.141 | 3.581 | 4.101 | 4.701 | 5.381 | 6.141 |
| 1.601999999999934 | 2.147 | 2.187 | 2.307 | 2.507 | 2.787 | 3.147 | 3.587 | 4.107 | 4.707 | 5.387 | 6.147 |
| 1.602999999999934 | 2.152 | 2.192 | 2.312 | 2.512 | 2.792 | 3.152 | 3.592 | 4.112 | 4.712 | 5.392 | 6.152 |
| 1.603999999999934 | 2.158 | 2.198 | 2.318 | 2.518 | 2.798 | 3.158 | 3.598 | 4.118 | 4.718 | 5.398 | 6.158 |
| 1.604999999999934 | 2.163 | 2.203 | 2.323 | 2.523 | 2.803 | 3.163 | 3.603 | 4.123 | 4.723 | 5.403 | 6.163 |
| 1.605999999999934 | 2.169 | 2.209 | 2.329 | 2.529 | 2.809 | 3.169 | 3.609 | 4.129 | 4.729 | 5.409 | 6.169 |
| 1.606999999999934 | 2.175 | 2.215 | 2.335 | 2.535 | 2.815 | 3.175 | 3.615 | 4.135 | 4.735 | 5.415 | 6.175 |
| 1.607999999999934 | 2.18 | 2.22 | 2.34 | 2.54 | 2.82 | 3.18 | 3.62 | 4.14 | 4.74 | 5.42 | 6.18 |
| 1.608999999999934 | 2.186 | 2.226 | 2.346 | 2.546 | 2.826 | 3.186 | 3.626 | 4.146 | 4.746 | 5.426 | 6.186 |
| 1.609999999999933 | 2.191 | 2.231 | 2.351 | 2.551 | 2.831 | 3.191 | 3.631 | 4.151 | 4.751 | 5.431 | 6.191 |
| 1.610999999999933 | 2.197 | 2.237 | 2.357 | 2.557 | 2.837 | 3.197 | 3.637 | 4.157 | 4.757 | 5.437 | 6.197 |
| 1.611999999999933 | 2.202 | 2.242 | 2.362 | 2.562 | 2.842 | 3.202 | 3.642 | 4.162 | 4.762 | 5.442 | 6.202 |
| 1.612999999999933 | 2.208 | 2.248 | 2.368 | 2.568 | 2.848 | 3.208 | 3.648 | 4.168 | 4.768 | 5.448 | 6.208 |
| 1.613999999999933 | 2.213 | 2.253 | 2.373 | 2.573 | 2.853 | 3.213 | 3.653 | 4.173 | 4.773 | 5.453 | 6.213 |
| 1.614999999999933 | 2.219 | 2.259 | 2.379 | 2.579 | 2.859 | 3.219 | 3.659 | 4.179 | 4.779 | 5.459 | 6.219 |
| 1.615999999999933 | 2.225 | 2.265 | 2.385 | 2.585 | 2.865 | 3.225 | 3.665 | 4.185 | 4.785 | 5.465 | 6.225 |
| 1.616999999999933 | 2.23 | 2.27 | 2.39 | 2.59 | 2.87 | 3.23 | 3.67 | 4.19 | 4.79 | 5.47 | 6.23 |
| 1.617999999999933 | 2.236 | 2.276 | 2.396 | 2.596 | 2.876 | 3.236 | 3.676 | 4.196 | 4.796 | 5.476 | 6.236 |
| 1.618999999999932 | 2.241 | 2.281 | 2.401 | 2.601 | 2.881 | 3.241 | 3.681 | 4.201 | 4.801 | 5.481 | 6.241 |
| 1.619999999999932 | 2.247 | 2.287 | 2.407 | 2.607 | 2.887 | 3.247 | 3.687 | 4.207 | 4.807 | 5.487 | 6.247 |
| 1.620999999999932 | 2.253 | 2.293 | 2.413 | 2.613 | 2.893 | 3.253 | 3.693 | 4.213 | 4.813 | 5.493 | 6.253 |
| 1.621999999999932 | 2.258 | 2.298 | 2.418 | 2.618 | 2.898 | 3.258 | 3.698 | 4.218 | 4.818 | 5.498 | 6.258 |
| 1.622999999999932 | 2.264 | 2.304 | 2.424 | 2.624 | 2.904 | 3.264 | 3.704 | 4.224 | 4.824 | 5.504 | 6.264 |
| 1.623999999999932 | 2.27 | 2.31 | 2.43 | 2.63 | 2.91 | 3.27 | 3.71 | 4.23 | 4.83 | 5.51 | 6.27 |
| 1.624999999999932 | 2.275 | 2.315 | 2.435 | 2.635 | 2.915 | 3.275 | 3.715 | 4.235 | 4.835 | 5.515 | 6.275 |
| 1.625999999999932 | 2.281 | 2.321 | 2.441 | 2.641 | 2.921 | 3.281 | 3.721 | 4.241 | 4.841 | 5.521 | 6.281 |
| 1.626999999999932 | 2.287 | 2.327 | 2.447 | 2.647 | 2.927 | 3.287 | 3.727 | 4.247 | 4.847 | 5.527 | 6.287 |
| 1.627999999999931 | 2.292 | 2.332 | 2.452 | 2.652 | 2.932 | 3.292 | 3.732 | 4.252 | 4.852 | 5.532 | 6.292 |
| 1.628999999999931 | 2.298 | 2.338 | 2.458 | 2.658 | 2.938 | 3.298 | 3.738 | 4.258 | 4.858 | 5.538 | 6.298 |
| 1.629999999999931 | 2.304 | 2.344 | 2.464 | 2.664 | 2.944 | 3.304 | 3.744 | 4.264 | 4.864 | 5.544 | 6.304 |
| 1.630999999999931 | 2.31 | 2.35 | 2.47 | 2.67 | 2.95 | 3.31 | 3.75 | 4.27 | 4.87 | 5.55 | 6.31 |
| 1.631999999999931 | 2.315 | 2.355 | 2.475 | 2.675 | 2.955 | 3.315 | 3.755 | 4.275 | 4.875 | 5.555 | 6.315 |
| 1.632999999999931 | 2.321 | 2.361 | 2.481 | 2.681 | 2.961 | 3.321 | 3.761 | 4.281 | 4.881 | 5.561 | 6.321 |
| 1.633999999999931 | 2.327 | 2.367 | 2.487 | 2.687 | 2.967 | 3.327 | 3.767 | 4.287 | 4.887 | 5.567 | 6.327 |
| 1.634999999999931 | 2.332 | 2.372 | 2.492 | 2.692 | 2.972 | 3.332 | 3.772 | 4.292 | 4.892 | 5.572 | 6.332 |
| 1.635999999999931 | 2.338 | 2.378 | 2.498 | 2.698 | 2.978 | 3.338 | 3.778 | 4.298 | 4.898 | 5.578 | 6.338 |
| 1.63699999999993 | 2.344 | 2.384 | 2.504 | 2.704 | 2.984 | 3.344 | 3.784 | 4.304 | 4.904 | 5.584 | 6.344 |
| 1.63799999999993 | 2.35 | 2.39 | 2.51 | 2.71 | 2.99 | 3.35 | 3.79 | 4.31 | 4.91 | 5.59 | 6.35 |
| 1.63899999999993 | 2.356 | 2.396 | 2.516 | 2.716 | 2.996 | 3.356 | 3.796 | 4.316 | 4.916 | 5.596 | 6.356 |
| 1.63999999999993 | 2.361 | 2.401 | 2.521 | 2.721 | 3.001 | 3.361 | 3.801 | 4.321 | 4.921 | 5.601 | 6.361 |
| 1.64099999999993 | 2.367 | 2.407 | 2.527 | 2.727 | 3.007 | 3.367 | 3.807 | 4.327 | 4.927 | 5.607 | 6.367 |
| 1.64199999999993 | 2.373 | 2.413 | 2.533 | 2.733 | 3.013 | 3.373 | 3.813 | 4.333 | 4.933 | 5.613 | 6.373 |
| 1.64299999999993 | 2.379 | 2.419 | 2.539 | 2.739 | 3.019 | 3.379 | 3.819 | 4.339 | 4.939 | 5.619 | 6.379 |
| 1.64399999999993 | 2.385 | 2.425 | 2.545 | 2.745 | 3.025 | 3.385 | 3.825 | 4.345 | 4.945 | 5.625 | 6.385 |
| 1.64499999999993 | 2.39 | 2.43 | 2.55 | 2.75 | 3.03 | 3.39 | 3.83 | 4.35 | 4.95 | 5.63 | 6.39 |
| 1.645999999999929 | 2.396 | 2.436 | 2.556 | 2.756 | 3.036 | 3.396 | 3.836 | 4.356 | 4.956 | 5.636 | 6.396 |
| 1.646999999999929 | 2.402 | 2.442 | 2.562 | 2.762 | 3.042 | 3.402 | 3.842 | 4.362 | 4.962 | 5.642 | 6.402 |
| 1.647999999999929 | 2.408 | 2.448 | 2.568 | 2.768 | 3.048 | 3.408 | 3.848 | 4.368 | 4.968 | 5.648 | 6.408 |
| 1.648999999999929 | 2.414 | 2.454 | 2.574 | 2.774 | 3.054 | 3.414 | 3.854 | 4.374 | 4.974 | 5.654 | 6.414 |
| 1.649999999999929 | 2.42 | 2.46 | 2.58 | 2.78 | 3.06 | 3.42 | 3.86 | 4.38 | 4.98 | 5.66 | 6.42 |
| 1.650999999999929 | 2.425 | 2.465 | 2.585 | 2.785 | 3.065 | 3.425 | 3.865 | 4.385 | 4.985 | 5.665 | 6.425 |
| 1.651999999999929 | 2.431 | 2.471 | 2.591 | 2.791 | 3.071 | 3.431 | 3.871 | 4.391 | 4.991 | 5.671 | 6.431 |
| 1.652999999999929 | 2.437 | 2.477 | 2.597 | 2.797 | 3.077 | 3.437 | 3.877 | 4.397 | 4.997 | 5.677 | 6.437 |
| 1.653999999999929 | 2.443 | 2.483 | 2.603 | 2.803 | 3.083 | 3.443 | 3.883 | 4.403 | 5.003 | 5.683 | 6.443 |
| 1.654999999999928 | 2.449 | 2.489 | 2.609 | 2.809 | 3.089 | 3.449 | 3.889 | 4.409 | 5.009 | 5.689 | 6.449 |
| 1.655999999999928 | 2.455 | 2.495 | 2.615 | 2.815 | 3.095 | 3.455 | 3.895 | 4.415 | 5.015 | 5.695 | 6.455 |
| 1.656999999999928 | 2.461 | 2.501 | 2.621 | 2.821 | 3.101 | 3.461 | 3.901 | 4.421 | 5.021 | 5.701 | 6.461 |
| 1.657999999999928 | 2.467 | 2.507 | 2.627 | 2.827 | 3.107 | 3.467 | 3.907 | 4.427 | 5.027 | 5.707 | 6.467 |
| 1.658999999999928 | 2.473 | 2.513 | 2.633 | 2.833 | 3.113 | 3.473 | 3.913 | 4.433 | 5.033 | 5.713 | 6.473 |
| 1.659999999999928 | 2.479 | 2.519 | 2.639 | 2.839 | 3.119 | 3.479 | 3.919 | 4.439 | 5.039 | 5.719 | 6.479 |
| 1.660999999999928 | 2.485 | 2.525 | 2.645 | 2.845 | 3.125 | 3.485 | 3.925 | 4.445 | 5.045 | 5.725 | 6.485 |
| 1.661999999999928 | 2.491 | 2.531 | 2.651 | 2.851 | 3.131 | 3.491 | 3.931 | 4.451 | 5.051 | 5.731 | 6.491 |
| 1.662999999999928 | 2.497 | 2.537 | 2.657 | 2.857 | 3.137 | 3.497 | 3.937 | 4.457 | 5.057 | 5.737 | 6.497 |
| 1.663999999999927 | 2.503 | 2.543 | 2.663 | 2.863 | 3.143 | 3.503 | 3.943 | 4.463 | 5.063 | 5.743 | 6.503 |
| 1.664999999999927 | 2.509 | 2.549 | 2.669 | 2.869 | 3.149 | 3.509 | 3.949 | 4.469 | 5.069 | 5.749 | 6.509 |
| 1.665999999999927 | 2.515 | 2.555 | 2.675 | 2.875 | 3.155 | 3.515 | 3.955 | 4.475 | 5.075 | 5.755 | 6.515 |
| 1.666999999999927 | 2.521 | 2.561 | 2.681 | 2.881 | 3.161 | 3.521 | 3.961 | 4.481 | 5.081 | 5.761 | 6.521 |
| 1.667999999999927 | 2.527 | 2.567 | 2.687 | 2.887 | 3.167 | 3.527 | 3.967 | 4.487 | 5.087 | 5.767 | 6.527 |
| 1.668999999999927 | 2.533 | 2.573 | 2.693 | 2.893 | 3.173 | 3.533 | 3.973 | 4.493 | 5.093 | 5.773 | 6.533 |
| 1.669999999999927 | 2.539 | 2.579 | 2.699 | 2.899 | 3.179 | 3.539 | 3.979 | 4.499 | 5.099 | 5.779 | 6.539 |
| 1.670999999999927 | 2.545 | 2.585 | 2.705 | 2.905 | 3.185 | 3.545 | 3.985 | 4.505 | 5.105 | 5.785 | 6.545 |
| 1.671999999999927 | 2.551 | 2.591 | 2.711 | 2.911 | 3.191 | 3.551 | 3.991 | 4.511 | 5.111 | 5.791 | 6.551 |
| 1.672999999999926 | 2.557 | 2.597 | 2.717 | 2.917 | 3.197 | 3.557 | 3.997 | 4.517 | 5.117 | 5.797 | 6.557 |
| 1.673999999999926 | 2.563 | 2.603 | 2.723 | 2.923 | 3.203 | 3.563 | 4.003 | 4.523 | 5.123 | 5.803 | 6.563 |
| 1.674999999999926 | 2.569 | 2.609 | 2.729 | 2.929 | 3.209 | 3.569 | 4.009 | 4.529 | 5.129 | 5.809 | 6.569 |
| 1.675999999999926 | 2.575 | 2.615 | 2.735 | 2.935 | 3.215 | 3.575 | 4.015 | 4.535 | 5.135 | 5.815 | 6.575 |
| 1.676999999999926 | 2.581 | 2.621 | 2.741 | 2.941 | 3.221 | 3.581 | 4.021 | 4.541 | 5.141 | 5.821 | 6.581 |
| 1.677999999999926 | 2.587 | 2.627 | 2.747 | 2.947 | 3.227 | 3.587 | 4.027 | 4.547 | 5.147 | 5.827 | 6.587 |
| 1.678999999999926 | 2.593 | 2.633 | 2.753 | 2.953 | 3.233 | 3.593 | 4.033 | 4.553 | 5.153 | 5.833 | 6.593 |
| 1.679999999999926 | 2.599 | 2.639 | 2.759 | 2.959 | 3.239 | 3.599 | 4.039 | 4.559 | 5.159 | 5.839 | 6.599 |
| 1.680999999999926 | 2.605 | 2.645 | 2.765 | 2.965 | 3.245 | 3.605 | 4.045 | 4.565 | 5.165 | 5.845 | 6.605 |
| 1.681999999999925 | 2.611 | 2.651 | 2.771 | 2.971 | 3.251 | 3.611 | 4.051 | 4.571 | 5.171 | 5.851 | 6.611 |
| 1.682999999999925 | 2.618 | 2.658 | 2.778 | 2.978 | 3.258 | 3.618 | 4.058 | 4.578 | 5.178 | 5.858 | 6.618 |
| 1.683999999999925 | 2.624 | 2.664 | 2.784 | 2.984 | 3.264 | 3.624 | 4.064 | 4.584 | 5.184 | 5.864 | 6.624 |
| 1.684999999999925 | 2.63 | 2.67 | 2.79 | 2.99 | 3.27 | 3.63 | 4.07 | 4.59 | 5.19 | 5.87 | 6.63 |
| 1.685999999999925 | 2.636 | 2.676 | 2.796 | 2.996 | 3.276 | 3.636 | 4.076 | 4.596 | 5.196 | 5.876 | 6.636 |
| 1.686999999999925 | 2.642 | 2.682 | 2.802 | 3.002 | 3.282 | 3.642 | 4.082 | 4.602 | 5.202 | 5.882 | 6.642 |
| 1.687999999999925 | 2.648 | 2.688 | 2.808 | 3.008 | 3.288 | 3.648 | 4.088 | 4.608 | 5.208 | 5.888 | 6.648 |
| 1.688999999999925 | 2.655 | 2.695 | 2.815 | 3.015 | 3.295 | 3.655 | 4.095 | 4.615 | 5.215 | 5.895 | 6.655 |
| 1.689999999999925 | 2.661 | 2.701 | 2.821 | 3.021 | 3.301 | 3.661 | 4.101 | 4.621 | 5.221 | 5.901 | 6.661 |
| 1.690999999999924 | 2.667 | 2.707 | 2.827 | 3.027 | 3.307 | 3.667 | 4.107 | 4.627 | 5.227 | 5.907 | 6.667 |
| 1.691999999999924 | 2.673 | 2.713 | 2.833 | 3.033 | 3.313 | 3.673 | 4.113 | 4.633 | 5.233 | 5.913 | 6.673 |
| 1.692999999999924 | 2.679 | 2.719 | 2.839 | 3.039 | 3.319 | 3.679 | 4.119 | 4.639 | 5.239 | 5.919 | 6.679 |
| 1.693999999999924 | 2.686 | 2.726 | 2.846 | 3.046 | 3.326 | 3.686 | 4.126 | 4.646 | 5.246 | 5.926 | 6.686 |
| 1.694999999999924 | 2.692 | 2.732 | 2.852 | 3.052 | 3.332 | 3.692 | 4.132 | 4.652 | 5.252 | 5.932 | 6.692 |
| 1.695999999999924 | 2.698 | 2.738 | 2.858 | 3.058 | 3.338 | 3.698 | 4.138 | 4.658 | 5.258 | 5.938 | 6.698 |
| 1.696999999999924 | 2.704 | 2.744 | 2.864 | 3.064 | 3.344 | 3.704 | 4.144 | 4.664 | 5.264 | 5.944 | 6.704 |
| 1.697999999999924 | 2.71 | 2.75 | 2.87 | 3.07 | 3.35 | 3.71 | 4.15 | 4.67 | 5.27 | 5.95 | 6.71 |
| 1.698999999999924 | 2.717 | 2.757 | 2.877 | 3.077 | 3.357 | 3.717 | 4.157 | 4.677 | 5.277 | 5.957 | 6.717 |
| 1.699999999999923 | 2.723 | 2.763 | 2.883 | 3.083 | 3.363 | 3.723 | 4.163 | 4.683 | 5.283 | 5.963 | 6.723 |
| 1.700999999999923 | 2.729 | 2.769 | 2.889 | 3.089 | 3.369 | 3.729 | 4.169 | 4.689 | 5.289 | 5.969 | 6.729 |
| 1.701999999999923 | 2.736 | 2.776 | 2.896 | 3.096 | 3.376 | 3.736 | 4.176 | 4.696 | 5.296 | 5.976 | 6.736 |
| 1.702999999999923 | 2.742 | 2.782 | 2.902 | 3.102 | 3.382 | 3.742 | 4.182 | 4.702 | 5.302 | 5.982 | 6.742 |
| 1.703999999999923 | 2.748 | 2.788 | 2.908 | 3.108 | 3.388 | 3.748 | 4.188 | 4.708 | 5.308 | 5.988 | 6.748 |
| 1.704999999999923 | 2.754 | 2.794 | 2.914 | 3.114 | 3.394 | 3.754 | 4.194 | 4.714 | 5.314 | 5.994 | 6.754 |
| 1.705999999999923 | 2.761 | 2.801 | 2.921 | 3.121 | 3.401 | 3.761 | 4.201 | 4.721 | 5.321 | 6.001 | 6.761 |
| 1.706999999999923 | 2.767 | 2.807 | 2.927 | 3.127 | 3.407 | 3.767 | 4.207 | 4.727 | 5.327 | 6.007 | 6.767 |
| 1.707999999999923 | 2.773 | 2.813 | 2.933 | 3.133 | 3.413 | 3.773 | 4.213 | 4.733 | 5.333 | 6.013 | 6.773 |
| 1.708999999999923 | 2.78 | 2.82 | 2.94 | 3.14 | 3.42 | 3.78 | 4.22 | 4.74 | 5.34 | 6.02 | 6.78 |
| 1.709999999999922 | 2.786 | 2.826 | 2.946 | 3.146 | 3.426 | 3.786 | 4.226 | 4.746 | 5.346 | 6.026 | 6.786 |
| 1.710999999999922 | 2.792 | 2.832 | 2.952 | 3.152 | 3.432 | 3.792 | 4.232 | 4.752 | 5.352 | 6.032 | 6.792 |
| 1.711999999999922 | 2.799 | 2.839 | 2.959 | 3.159 | 3.439 | 3.799 | 4.239 | 4.759 | 5.359 | 6.039 | 6.799 |
| 1.712999999999922 | 2.805 | 2.845 | 2.965 | 3.165 | 3.445 | 3.805 | 4.245 | 4.765 | 5.365 | 6.045 | 6.805 |
| 1.713999999999922 | 2.812 | 2.852 | 2.972 | 3.172 | 3.452 | 3.812 | 4.252 | 4.772 | 5.372 | 6.052 | 6.812 |
| 1.714999999999922 | 2.818 | 2.858 | 2.978 | 3.178 | 3.458 | 3.818 | 4.258 | 4.778 | 5.378 | 6.058 | 6.818 |
| 1.715999999999922 | 2.824 | 2.864 | 2.984 | 3.184 | 3.464 | 3.824 | 4.264 | 4.784 | 5.384 | 6.064 | 6.824 |
| 1.716999999999922 | 2.831 | 2.871 | 2.991 | 3.191 | 3.471 | 3.831 | 4.271 | 4.791 | 5.391 | 6.071 | 6.831 |
| 1.717999999999922 | 2.837 | 2.877 | 2.997 | 3.197 | 3.477 | 3.837 | 4.277 | 4.797 | 5.397 | 6.077 | 6.837 |
| 1.718999999999921 | 2.844 | 2.884 | 3.004 | 3.204 | 3.484 | 3.844 | 4.284 | 4.804 | 5.404 | 6.084 | 6.844 |
| 1.719999999999921 | 2.85 | 2.89 | 3.01 | 3.21 | 3.49 | 3.85 | 4.29 | 4.81 | 5.41 | 6.09 | 6.85 |
| 1.720999999999921 | 2.856 | 2.896 | 3.016 | 3.216 | 3.496 | 3.856 | 4.296 | 4.816 | 5.416 | 6.096 | 6.856 |
| 1.721999999999921 | 2.863 | 2.903 | 3.023 | 3.223 | 3.503 | 3.863 | 4.303 | 4.823 | 5.423 | 6.103 | 6.863 |
| 1.722999999999921 | 2.869 | 2.909 | 3.029 | 3.229 | 3.509 | 3.869 | 4.309 | 4.829 | 5.429 | 6.109 | 6.869 |
| 1.723999999999921 | 2.876 | 2.916 | 3.036 | 3.236 | 3.516 | 3.876 | 4.316 | 4.836 | 5.436 | 6.116 | 6.876 |
| 1.724999999999921 | 2.882 | 2.922 | 3.042 | 3.242 | 3.522 | 3.882 | 4.322 | 4.842 | 5.442 | 6.122 | 6.882 |
| 1.725999999999921 | 2.889 | 2.929 | 3.049 | 3.249 | 3.529 | 3.889 | 4.329 | 4.849 | 5.449 | 6.129 | 6.889 |
| 1.726999999999921 | 2.895 | 2.935 | 3.055 | 3.255 | 3.535 | 3.895 | 4.335 | 4.855 | 5.455 | 6.135 | 6.895 |
| 1.72799999999992 | 2.902 | 2.942 | 3.062 | 3.262 | 3.542 | 3.902 | 4.342 | 4.862 | 5.462 | 6.142 | 6.902 |
| 1.72899999999992 | 2.908 | 2.948 | 3.068 | 3.268 | 3.548 | 3.908 | 4.348 | 4.868 | 5.468 | 6.148 | 6.908 |
| 1.72999999999992 | 2.915 | 2.955 | 3.075 | 3.275 | 3.555 | 3.915 | 4.355 | 4.875 | 5.475 | 6.155 | 6.915 |
| 1.73099999999992 | 2.921 | 2.961 | 3.081 | 3.281 | 3.561 | 3.921 | 4.361 | 4.881 | 5.481 | 6.161 | 6.921 |
| 1.73199999999992 | 2.928 | 2.968 | 3.088 | 3.288 | 3.568 | 3.928 | 4.368 | 4.888 | 5.488 | 6.168 | 6.928 |
| 1.73299999999992 | 2.934 | 2.974 | 3.094 | 3.294 | 3.574 | 3.934 | 4.374 | 4.894 | 5.494 | 6.174 | 6.934 |
| 1.73399999999992 | 2.941 | 2.981 | 3.101 | 3.301 | 3.581 | 3.941 | 4.381 | 4.901 | 5.501 | 6.181 | 6.941 |
| 1.73499999999992 | 2.948 | 2.988 | 3.108 | 3.308 | 3.588 | 3.948 | 4.388 | 4.908 | 5.508 | 6.188 | 6.948 |
| 1.73599999999992 | 2.954 | 2.994 | 3.114 | 3.314 | 3.594 | 3.954 | 4.394 | 4.914 | 5.514 | 6.194 | 6.954 |
| 1.736999999999919 | 2.961 | 3.001 | 3.121 | 3.321 | 3.601 | 3.961 | 4.401 | 4.921 | 5.521 | 6.201 | 6.961 |
| 1.737999999999919 | 2.967 | 3.007 | 3.127 | 3.327 | 3.607 | 3.967 | 4.407 | 4.927 | 5.527 | 6.207 | 6.967 |
| 1.738999999999919 | 2.974 | 3.014 | 3.134 | 3.334 | 3.614 | 3.974 | 4.414 | 4.934 | 5.534 | 6.214 | 6.974 |
| 1.739999999999919 | 2.98 | 3.02 | 3.14 | 3.34 | 3.62 | 3.98 | 4.42 | 4.94 | 5.54 | 6.22 | 6.98 |
| 1.740999999999919 | 2.987 | 3.027 | 3.147 | 3.347 | 3.627 | 3.987 | 4.427 | 4.947 | 5.547 | 6.227 | 6.987 |
| 1.741999999999919 | 2.994 | 3.034 | 3.154 | 3.354 | 3.634 | 3.994 | 4.434 | 4.954 | 5.554 | 6.234 | 6.994 |
| 1.742999999999919 | 3 | 3.04 | 3.16 | 3.36 | 3.64 | 4 | 4.44 | 4.96 | 5.56 | 6.24 | 7 |
| 1.743999999999919 | 3.007 | 3.047 | 3.167 | 3.367 | 3.647 | 4.007 | 4.447 | 4.967 | 5.567 | 6.247 | 7.007 |
| 1.744999999999919 | 3.014 | 3.054 | 3.174 | 3.374 | 3.654 | 4.014 | 4.454 | 4.974 | 5.574 | 6.254 | 7.014 |
| 1.745999999999918 | 3.02 | 3.06 | 3.18 | 3.38 | 3.66 | 4.02 | 4.46 | 4.98 | 5.58 | 6.26 | 7.02 |
| 1.746999999999918 | 3.027 | 3.067 | 3.187 | 3.387 | 3.667 | 4.027 | 4.467 | 4.987 | 5.587 | 6.267 | 7.027 |
| 1.747999999999918 | 3.034 | 3.074 | 3.194 | 3.394 | 3.674 | 4.034 | 4.474 | 4.994 | 5.594 | 6.274 | 7.034 |
| 1.748999999999918 | 3.04 | 3.08 | 3.2 | 3.4 | 3.68 | 4.04 | 4.48 | 5 | 5.6 | 6.28 | 7.04 |
| 1.749999999999918 | 3.047 | 3.087 | 3.207 | 3.407 | 3.687 | 4.047 | 4.487 | 5.007 | 5.607 | 6.287 | 7.047 |
| 1.750999999999918 | 3.054 | 3.094 | 3.214 | 3.414 | 3.694 | 4.054 | 4.494 | 5.014 | 5.614 | 6.294 | 7.054 |
| 1.751999999999918 | 3.06 | 3.1 | 3.22 | 3.42 | 3.7 | 4.06 | 4.5 | 5.02 | 5.62 | 6.3 | 7.06 |
| 1.752999999999918 | 3.067 | 3.107 | 3.227 | 3.427 | 3.707 | 4.067 | 4.507 | 5.027 | 5.627 | 6.307 | 7.067 |
| 1.753999999999918 | 3.074 | 3.114 | 3.234 | 3.434 | 3.714 | 4.074 | 4.514 | 5.034 | 5.634 | 6.314 | 7.074 |
| 1.754999999999917 | 3.08 | 3.12 | 3.24 | 3.44 | 3.72 | 4.08 | 4.52 | 5.04 | 5.64 | 6.32 | 7.08 |
| 1.755999999999917 | 3.087 | 3.127 | 3.247 | 3.447 | 3.727 | 4.087 | 4.527 | 5.047 | 5.647 | 6.327 | 7.087 |
| 1.756999999999917 | 3.094 | 3.134 | 3.254 | 3.454 | 3.734 | 4.094 | 4.534 | 5.054 | 5.654 | 6.334 | 7.094 |
| 1.757999999999917 | 3.101 | 3.141 | 3.261 | 3.461 | 3.741 | 4.101 | 4.541 | 5.061 | 5.661 | 6.341 | 7.101 |
| 1.758999999999917 | 3.107 | 3.147 | 3.267 | 3.467 | 3.747 | 4.107 | 4.547 | 5.067 | 5.667 | 6.347 | 7.107 |
| 1.759999999999917 | 3.114 | 3.154 | 3.274 | 3.474 | 3.754 | 4.114 | 4.554 | 5.074 | 5.674 | 6.354 | 7.114 |
| 1.760999999999917 | 3.121 | 3.161 | 3.281 | 3.481 | 3.761 | 4.121 | 4.561 | 5.081 | 5.681 | 6.361 | 7.121 |
| 1.761999999999917 | 3.128 | 3.168 | 3.288 | 3.488 | 3.768 | 4.128 | 4.568 | 5.088 | 5.688 | 6.368 | 7.128 |
| 1.762999999999917 | 3.135 | 3.175 | 3.295 | 3.495 | 3.775 | 4.135 | 4.575 | 5.095 | 5.695 | 6.375 | 7.135 |
| 1.763999999999916 | 3.141 | 3.181 | 3.301 | 3.501 | 3.781 | 4.141 | 4.581 | 5.101 | 5.701 | 6.381 | 7.141 |
| 1.764999999999916 | 3.148 | 3.188 | 3.308 | 3.508 | 3.788 | 4.148 | 4.588 | 5.108 | 5.708 | 6.388 | 7.148 |
| 1.765999999999916 | 3.155 | 3.195 | 3.315 | 3.515 | 3.795 | 4.155 | 4.595 | 5.115 | 5.715 | 6.395 | 7.155 |
| 1.766999999999916 | 3.162 | 3.202 | 3.322 | 3.522 | 3.802 | 4.162 | 4.602 | 5.122 | 5.722 | 6.402 | 7.162 |
| 1.767999999999916 | 3.169 | 3.209 | 3.329 | 3.529 | 3.809 | 4.169 | 4.609 | 5.129 | 5.729 | 6.409 | 7.169 |
| 1.768999999999916 | 3.175 | 3.215 | 3.335 | 3.535 | 3.815 | 4.175 | 4.615 | 5.135 | 5.735 | 6.415 | 7.175 |
| 1.769999999999916 | 3.182 | 3.222 | 3.342 | 3.542 | 3.822 | 4.182 | 4.622 | 5.142 | 5.742 | 6.422 | 7.182 |
| 1.770999999999916 | 3.189 | 3.229 | 3.349 | 3.549 | 3.829 | 4.189 | 4.629 | 5.149 | 5.749 | 6.429 | 7.189 |
| 1.771999999999916 | 3.196 | 3.236 | 3.356 | 3.556 | 3.836 | 4.196 | 4.636 | 5.156 | 5.756 | 6.436 | 7.196 |
| 1.772999999999915 | 3.203 | 3.243 | 3.363 | 3.563 | 3.843 | 4.203 | 4.643 | 5.163 | 5.763 | 6.443 | 7.203 |
| 1.773999999999915 | 3.21 | 3.25 | 3.37 | 3.57 | 3.85 | 4.21 | 4.65 | 5.17 | 5.77 | 6.45 | 7.21 |
| 1.774999999999915 | 3.217 | 3.257 | 3.377 | 3.577 | 3.857 | 4.217 | 4.657 | 5.177 | 5.777 | 6.457 | 7.217 |
| 1.775999999999915 | 3.224 | 3.264 | 3.384 | 3.584 | 3.864 | 4.224 | 4.664 | 5.184 | 5.784 | 6.464 | 7.224 |
| 1.776999999999915 | 3.231 | 3.271 | 3.391 | 3.591 | 3.871 | 4.231 | 4.671 | 5.191 | 5.791 | 6.471 | 7.231 |
| 1.777999999999915 | 3.237 | 3.277 | 3.397 | 3.597 | 3.877 | 4.237 | 4.677 | 5.197 | 5.797 | 6.477 | 7.237 |
| 1.778999999999915 | 3.244 | 3.284 | 3.404 | 3.604 | 3.884 | 4.244 | 4.684 | 5.204 | 5.804 | 6.484 | 7.244 |
| 1.779999999999915 | 3.251 | 3.291 | 3.411 | 3.611 | 3.891 | 4.251 | 4.691 | 5.211 | 5.811 | 6.491 | 7.251 |
| 1.780999999999915 | 3.258 | 3.298 | 3.418 | 3.618 | 3.898 | 4.258 | 4.698 | 5.218 | 5.818 | 6.498 | 7.258 |
| 1.781999999999914 | 3.265 | 3.305 | 3.425 | 3.625 | 3.905 | 4.265 | 4.705 | 5.225 | 5.825 | 6.505 | 7.265 |
| 1.782999999999914 | 3.272 | 3.312 | 3.432 | 3.632 | 3.912 | 4.272 | 4.712 | 5.232 | 5.832 | 6.512 | 7.272 |
| 1.783999999999914 | 3.279 | 3.319 | 3.439 | 3.639 | 3.919 | 4.279 | 4.719 | 5.239 | 5.839 | 6.519 | 7.279 |
| 1.784999999999914 | 3.286 | 3.326 | 3.446 | 3.646 | 3.926 | 4.286 | 4.726 | 5.246 | 5.846 | 6.526 | 7.286 |
| 1.785999999999914 | 3.293 | 3.333 | 3.453 | 3.653 | 3.933 | 4.293 | 4.733 | 5.253 | 5.853 | 6.533 | 7.293 |
| 1.786999999999914 | 3.3 | 3.34 | 3.46 | 3.66 | 3.94 | 4.3 | 4.74 | 5.26 | 5.86 | 6.54 | 7.3 |
| 1.787999999999914 | 3.307 | 3.347 | 3.467 | 3.667 | 3.947 | 4.307 | 4.747 | 5.267 | 5.867 | 6.547 | 7.307 |
| 1.788999999999914 | 3.314 | 3.354 | 3.474 | 3.674 | 3.954 | 4.314 | 4.754 | 5.274 | 5.874 | 6.554 | 7.314 |
| 1.789999999999914 | 3.321 | 3.361 | 3.481 | 3.681 | 3.961 | 4.321 | 4.761 | 5.281 | 5.881 | 6.561 | 7.321 |
| 1.790999999999913 | 3.328 | 3.368 | 3.488 | 3.688 | 3.968 | 4.328 | 4.768 | 5.288 | 5.888 | 6.568 | 7.328 |
| 1.791999999999913 | 3.335 | 3.375 | 3.495 | 3.695 | 3.975 | 4.335 | 4.775 | 5.295 | 5.895 | 6.575 | 7.335 |
| 1.792999999999913 | 3.342 | 3.382 | 3.502 | 3.702 | 3.982 | 4.342 | 4.782 | 5.302 | 5.902 | 6.582 | 7.342 |
| 1.793999999999913 | 3.349 | 3.389 | 3.509 | 3.709 | 3.989 | 4.349 | 4.789 | 5.309 | 5.909 | 6.589 | 7.349 |
| 1.794999999999913 | 3.357 | 3.397 | 3.517 | 3.717 | 3.997 | 4.357 | 4.797 | 5.317 | 5.917 | 6.597 | 7.357 |
| 1.795999999999913 | 3.364 | 3.404 | 3.524 | 3.724 | 4.004 | 4.364 | 4.804 | 5.324 | 5.924 | 6.604 | 7.364 |
| 1.796999999999913 | 3.371 | 3.411 | 3.531 | 3.731 | 4.011 | 4.371 | 4.811 | 5.331 | 5.931 | 6.611 | 7.371 |
| 1.797999999999913 | 3.378 | 3.418 | 3.538 | 3.738 | 4.018 | 4.378 | 4.818 | 5.338 | 5.938 | 6.618 | 7.378 |
| 1.798999999999913 | 3.385 | 3.425 | 3.545 | 3.745 | 4.025 | 4.385 | 4.825 | 5.345 | 5.945 | 6.625 | 7.385 |
| 1.799999999999912 | 3.392 | 3.432 | 3.552 | 3.752 | 4.032 | 4.392 | 4.832 | 5.352 | 5.952 | 6.632 | 7.392 |
| 1.800999999999912 | 3.399 | 3.439 | 3.559 | 3.759 | 4.039 | 4.399 | 4.839 | 5.359 | 5.959 | 6.639 | 7.399 |
| 1.801999999999912 | 3.406 | 3.446 | 3.566 | 3.766 | 4.046 | 4.406 | 4.846 | 5.366 | 5.966 | 6.646 | 7.406 |
| 1.802999999999912 | 3.413 | 3.453 | 3.573 | 3.773 | 4.053 | 4.413 | 4.853 | 5.373 | 5.973 | 6.653 | 7.413 |
| 1.803999999999912 | 3.421 | 3.461 | 3.581 | 3.781 | 4.061 | 4.421 | 4.861 | 5.381 | 5.981 | 6.661 | 7.421 |
| 1.804999999999912 | 3.428 | 3.468 | 3.588 | 3.788 | 4.068 | 4.428 | 4.868 | 5.388 | 5.988 | 6.668 | 7.428 |
| 1.805999999999912 | 3.435 | 3.475 | 3.595 | 3.795 | 4.075 | 4.435 | 4.875 | 5.395 | 5.995 | 6.675 | 7.435 |
| 1.806999999999912 | 3.442 | 3.482 | 3.602 | 3.802 | 4.082 | 4.442 | 4.882 | 5.402 | 6.002 | 6.682 | 7.442 |
| 1.807999999999912 | 3.449 | 3.489 | 3.609 | 3.809 | 4.089 | 4.449 | 4.889 | 5.409 | 6.009 | 6.689 | 7.449 |
| 1.808999999999912 | 3.456 | 3.496 | 3.616 | 3.816 | 4.096 | 4.456 | 4.896 | 5.416 | 6.016 | 6.696 | 7.456 |
| 1.809999999999911 | 3.464 | 3.504 | 3.624 | 3.824 | 4.104 | 4.464 | 4.904 | 5.424 | 6.024 | 6.704 | 7.464 |
| 1.810999999999911 | 3.471 | 3.511 | 3.631 | 3.831 | 4.111 | 4.471 | 4.911 | 5.431 | 6.031 | 6.711 | 7.471 |
| 1.811999999999911 | 3.478 | 3.518 | 3.638 | 3.838 | 4.118 | 4.478 | 4.918 | 5.438 | 6.038 | 6.718 | 7.478 |
| 1.812999999999911 | 3.485 | 3.525 | 3.645 | 3.845 | 4.125 | 4.485 | 4.925 | 5.445 | 6.045 | 6.725 | 7.485 |
| 1.813999999999911 | 3.493 | 3.533 | 3.653 | 3.853 | 4.133 | 4.493 | 4.933 | 5.453 | 6.053 | 6.733 | 7.493 |
| 1.814999999999911 | 3.5 | 3.54 | 3.66 | 3.86 | 4.14 | 4.5 | 4.94 | 5.46 | 6.06 | 6.74 | 7.5 |
| 1.815999999999911 | 3.507 | 3.547 | 3.667 | 3.867 | 4.147 | 4.507 | 4.947 | 5.467 | 6.067 | 6.747 | 7.507 |
| 1.816999999999911 | 3.514 | 3.554 | 3.674 | 3.874 | 4.154 | 4.514 | 4.954 | 5.474 | 6.074 | 6.754 | 7.514 |
| 1.817999999999911 | 3.522 | 3.562 | 3.682 | 3.882 | 4.162 | 4.522 | 4.962 | 5.482 | 6.082 | 6.762 | 7.522 |
| 1.81899999999991 | 3.529 | 3.569 | 3.689 | 3.889 | 4.169 | 4.529 | 4.969 | 5.489 | 6.089 | 6.769 | 7.529 |
| 1.81999999999991 | 3.536 | 3.576 | 3.696 | 3.896 | 4.176 | 4.536 | 4.976 | 5.496 | 6.096 | 6.776 | 7.536 |
| 1.82099999999991 | 3.543 | 3.583 | 3.703 | 3.903 | 4.183 | 4.543 | 4.983 | 5.503 | 6.103 | 6.783 | 7.543 |
| 1.82199999999991 | 3.551 | 3.591 | 3.711 | 3.911 | 4.191 | 4.551 | 4.991 | 5.511 | 6.111 | 6.791 | 7.551 |
| 1.82299999999991 | 3.558 | 3.598 | 3.718 | 3.918 | 4.198 | 4.558 | 4.998 | 5.518 | 6.118 | 6.798 | 7.558 |
| 1.82399999999991 | 3.565 | 3.605 | 3.725 | 3.925 | 4.205 | 4.565 | 5.005 | 5.525 | 6.125 | 6.805 | 7.565 |
| 1.82499999999991 | 3.573 | 3.613 | 3.733 | 3.933 | 4.213 | 4.573 | 5.013 | 5.533 | 6.133 | 6.813 | 7.573 |
| 1.82599999999991 | 3.58 | 3.62 | 3.74 | 3.94 | 4.22 | 4.58 | 5.02 | 5.54 | 6.14 | 6.82 | 7.58 |
| 1.82699999999991 | 3.587 | 3.627 | 3.747 | 3.947 | 4.227 | 4.587 | 5.027 | 5.547 | 6.147 | 6.827 | 7.587 |
| 1.827999999999909 | 3.595 | 3.635 | 3.755 | 3.955 | 4.235 | 4.595 | 5.035 | 5.555 | 6.155 | 6.835 | 7.595 |
| 1.828999999999909 | 3.602 | 3.642 | 3.762 | 3.962 | 4.242 | 4.602 | 5.042 | 5.562 | 6.162 | 6.842 | 7.602 |
| 1.829999999999909 | 3.61 | 3.65 | 3.77 | 3.97 | 4.25 | 4.61 | 5.05 | 5.57 | 6.17 | 6.85 | 7.61 |
| 1.830999999999909 | 3.617 | 3.657 | 3.777 | 3.977 | 4.257 | 4.617 | 5.057 | 5.577 | 6.177 | 6.857 | 7.617 |
| 1.831999999999909 | 3.624 | 3.664 | 3.784 | 3.984 | 4.264 | 4.624 | 5.064 | 5.584 | 6.184 | 6.864 | 7.624 |
| 1.832999999999909 | 3.632 | 3.672 | 3.792 | 3.992 | 4.272 | 4.632 | 5.072 | 5.592 | 6.192 | 6.872 | 7.632 |
| 1.833999999999909 | 3.639 | 3.679 | 3.799 | 3.999 | 4.279 | 4.639 | 5.079 | 5.599 | 6.199 | 6.879 | 7.639 |
| 1.834999999999909 | 3.647 | 3.687 | 3.807 | 4.007 | 4.287 | 4.647 | 5.087 | 5.607 | 6.207 | 6.887 | 7.647 |
| 1.835999999999909 | 3.654 | 3.694 | 3.814 | 4.014 | 4.294 | 4.654 | 5.094 | 5.614 | 6.214 | 6.894 | 7.654 |
| 1.836999999999908 | 3.662 | 3.702 | 3.822 | 4.022 | 4.302 | 4.662 | 5.102 | 5.622 | 6.222 | 6.902 | 7.662 |
| 1.837999999999908 | 3.669 | 3.709 | 3.829 | 4.029 | 4.309 | 4.669 | 5.109 | 5.629 | 6.229 | 6.909 | 7.669 |
| 1.838999999999908 | 3.676 | 3.716 | 3.836 | 4.036 | 4.316 | 4.676 | 5.116 | 5.636 | 6.236 | 6.916 | 7.676 |
| 1.839999999999908 | 3.684 | 3.724 | 3.844 | 4.044 | 4.324 | 4.684 | 5.124 | 5.644 | 6.244 | 6.924 | 7.684 |
| 1.840999999999908 | 3.691 | 3.731 | 3.851 | 4.051 | 4.331 | 4.691 | 5.131 | 5.651 | 6.251 | 6.931 | 7.691 |
| 1.841999999999908 | 3.699 | 3.739 | 3.859 | 4.059 | 4.339 | 4.699 | 5.139 | 5.659 | 6.259 | 6.939 | 7.699 |
| 1.842999999999908 | 3.706 | 3.746 | 3.866 | 4.066 | 4.346 | 4.706 | 5.146 | 5.666 | 6.266 | 6.946 | 7.706 |
| 1.843999999999908 | 3.714 | 3.754 | 3.874 | 4.074 | 4.354 | 4.714 | 5.154 | 5.674 | 6.274 | 6.954 | 7.714 |
| 1.844999999999908 | 3.721 | 3.761 | 3.881 | 4.081 | 4.361 | 4.721 | 5.161 | 5.681 | 6.281 | 6.961 | 7.721 |
| 1.845999999999907 | 3.729 | 3.769 | 3.889 | 4.089 | 4.369 | 4.729 | 5.169 | 5.689 | 6.289 | 6.969 | 7.729 |
| 1.846999999999907 | 3.736 | 3.776 | 3.896 | 4.096 | 4.376 | 4.736 | 5.176 | 5.696 | 6.296 | 6.976 | 7.736 |
| 1.847999999999907 | 3.744 | 3.784 | 3.904 | 4.104 | 4.384 | 4.744 | 5.184 | 5.704 | 6.304 | 6.984 | 7.744 |
| 1.848999999999907 | 3.752 | 3.792 | 3.912 | 4.112 | 4.392 | 4.752 | 5.192 | 5.712 | 6.312 | 6.992 | 7.752 |
| 1.849999999999907 | 3.759 | 3.799 | 3.919 | 4.119 | 4.399 | 4.759 | 5.199 | 5.719 | 6.319 | 6.999 | 7.759 |
| 1.850999999999907 | 3.767 | 3.807 | 3.927 | 4.127 | 4.407 | 4.767 | 5.207 | 5.727 | 6.327 | 7.007 | 7.767 |
| 1.851999999999907 | 3.774 | 3.814 | 3.934 | 4.134 | 4.414 | 4.774 | 5.214 | 5.734 | 6.334 | 7.014 | 7.774 |
| 1.852999999999907 | 3.782 | 3.822 | 3.942 | 4.142 | 4.422 | 4.782 | 5.222 | 5.742 | 6.342 | 7.022 | 7.782 |
| 1.853999999999907 | 3.789 | 3.829 | 3.949 | 4.149 | 4.429 | 4.789 | 5.229 | 5.749 | 6.349 | 7.029 | 7.789 |
| 1.854999999999906 | 3.797 | 3.837 | 3.957 | 4.157 | 4.437 | 4.797 | 5.237 | 5.757 | 6.357 | 7.037 | 7.797 |
| 1.855999999999906 | 3.805 | 3.845 | 3.965 | 4.165 | 4.445 | 4.805 | 5.245 | 5.765 | 6.365 | 7.045 | 7.805 |
| 1.856999999999906 | 3.812 | 3.852 | 3.972 | 4.172 | 4.452 | 4.812 | 5.252 | 5.772 | 6.372 | 7.052 | 7.812 |
| 1.857999999999906 | 3.82 | 3.86 | 3.98 | 4.18 | 4.46 | 4.82 | 5.26 | 5.78 | 6.38 | 7.06 | 7.82 |
| 1.858999999999906 | 3.828 | 3.868 | 3.988 | 4.188 | 4.468 | 4.828 | 5.268 | 5.788 | 6.388 | 7.068 | 7.828 |
| 1.859999999999906 | 3.835 | 3.875 | 3.995 | 4.195 | 4.475 | 4.835 | 5.275 | 5.795 | 6.395 | 7.075 | 7.835 |
| 1.860999999999906 | 3.843 | 3.883 | 4.003 | 4.203 | 4.483 | 4.843 | 5.283 | 5.803 | 6.403 | 7.083 | 7.843 |
| 1.861999999999906 | 3.851 | 3.891 | 4.011 | 4.211 | 4.491 | 4.851 | 5.291 | 5.811 | 6.411 | 7.091 | 7.851 |
| 1.862999999999906 | 3.858 | 3.898 | 4.018 | 4.218 | 4.498 | 4.858 | 5.298 | 5.818 | 6.418 | 7.098 | 7.858 |
| 1.863999999999905 | 3.866 | 3.906 | 4.026 | 4.226 | 4.506 | 4.866 | 5.306 | 5.826 | 6.426 | 7.106 | 7.866 |
| 1.864999999999905 | 3.874 | 3.914 | 4.034 | 4.234 | 4.514 | 4.874 | 5.314 | 5.834 | 6.434 | 7.114 | 7.874 |
| 1.865999999999905 | 3.881 | 3.921 | 4.041 | 4.241 | 4.521 | 4.881 | 5.321 | 5.841 | 6.441 | 7.121 | 7.881 |
| 1.866999999999905 | 3.889 | 3.929 | 4.049 | 4.249 | 4.529 | 4.889 | 5.329 | 5.849 | 6.449 | 7.129 | 7.889 |
| 1.867999999999905 | 3.897 | 3.937 | 4.057 | 4.257 | 4.537 | 4.897 | 5.337 | 5.857 | 6.457 | 7.137 | 7.897 |
| 1.868999999999905 | 3.905 | 3.945 | 4.065 | 4.265 | 4.545 | 4.905 | 5.345 | 5.865 | 6.465 | 7.145 | 7.905 |
| 1.869999999999905 | 3.912 | 3.952 | 4.072 | 4.272 | 4.552 | 4.912 | 5.352 | 5.872 | 6.472 | 7.152 | 7.912 |
| 1.870999999999905 | 3.92 | 3.96 | 4.08 | 4.28 | 4.56 | 4.92 | 5.36 | 5.88 | 6.48 | 7.16 | 7.92 |
| 1.871999999999905 | 3.928 | 3.968 | 4.088 | 4.288 | 4.568 | 4.928 | 5.368 | 5.888 | 6.488 | 7.168 | 7.928 |
| 1.872999999999904 | 3.936 | 3.976 | 4.096 | 4.296 | 4.576 | 4.936 | 5.376 | 5.896 | 6.496 | 7.176 | 7.936 |
| 1.873999999999904 | 3.943 | 3.983 | 4.103 | 4.303 | 4.583 | 4.943 | 5.383 | 5.903 | 6.503 | 7.183 | 7.943 |
| 1.874999999999904 | 3.951 | 3.991 | 4.111 | 4.311 | 4.591 | 4.951 | 5.391 | 5.911 | 6.511 | 7.191 | 7.951 |
| 1.875999999999904 | 3.959 | 3.999 | 4.119 | 4.319 | 4.599 | 4.959 | 5.399 | 5.919 | 6.519 | 7.199 | 7.959 |
| 1.876999999999904 | 3.967 | 4.007 | 4.127 | 4.327 | 4.607 | 4.967 | 5.407 | 5.927 | 6.527 | 7.207 | 7.967 |
| 1.877999999999904 | 3.975 | 4.015 | 4.135 | 4.335 | 4.615 | 4.975 | 5.415 | 5.935 | 6.535 | 7.215 | 7.975 |
| 1.878999999999904 | 3.982 | 4.022 | 4.142 | 4.342 | 4.622 | 4.982 | 5.422 | 5.942 | 6.542 | 7.222 | 7.982 |
| 1.879999999999904 | 3.99 | 4.03 | 4.15 | 4.35 | 4.63 | 4.99 | 5.43 | 5.95 | 6.55 | 7.23 | 7.99 |
| 1.880999999999904 | 3.998 | 4.038 | 4.158 | 4.358 | 4.638 | 4.998 | 5.438 | 5.958 | 6.558 | 7.238 | 7.998 |
| 1.881999999999903 | 4.006 | 4.046 | 4.166 | 4.366 | 4.646 | 5.006 | 5.446 | 5.966 | 6.566 | 7.246 | 8.006 |
| 1.882999999999903 | 4.014 | 4.054 | 4.174 | 4.374 | 4.654 | 5.014 | 5.454 | 5.974 | 6.574 | 7.254 | 8.014 |
| 1.883999999999903 | 4.022 | 4.062 | 4.182 | 4.382 | 4.662 | 5.022 | 5.462 | 5.982 | 6.582 | 7.262 | 8.022 |
| 1.884999999999903 | 4.03 | 4.07 | 4.19 | 4.39 | 4.67 | 5.03 | 5.47 | 5.99 | 6.59 | 7.27 | 8.03 |
| 1.885999999999903 | 4.037 | 4.077 | 4.197 | 4.397 | 4.677 | 5.037 | 5.477 | 5.997 | 6.597 | 7.277 | 8.037 |
| 1.886999999999903 | 4.045 | 4.085 | 4.205 | 4.405 | 4.685 | 5.045 | 5.485 | 6.005 | 6.605 | 7.285 | 8.045 |
| 1.887999999999903 | 4.053 | 4.093 | 4.213 | 4.413 | 4.693 | 5.053 | 5.493 | 6.013 | 6.613 | 7.293 | 8.053 |
| 1.888999999999903 | 4.061 | 4.101 | 4.221 | 4.421 | 4.701 | 5.061 | 5.501 | 6.021 | 6.621 | 7.301 | 8.061 |
| 1.889999999999903 | 4.069 | 4.109 | 4.229 | 4.429 | 4.709 | 5.069 | 5.509 | 6.029 | 6.629 | 7.309 | 8.069 |
| 1.890999999999902 | 4.077 | 4.117 | 4.237 | 4.437 | 4.717 | 5.077 | 5.517 | 6.037 | 6.637 | 7.317 | 8.077 |
| 1.891999999999902 | 4.085 | 4.125 | 4.245 | 4.445 | 4.725 | 5.085 | 5.525 | 6.045 | 6.645 | 7.325 | 8.085 |
| 1.892999999999902 | 4.093 | 4.133 | 4.253 | 4.453 | 4.733 | 5.093 | 5.533 | 6.053 | 6.653 | 7.333 | 8.093 |
| 1.893999999999902 | 4.101 | 4.141 | 4.261 | 4.461 | 4.741 | 5.101 | 5.541 | 6.061 | 6.661 | 7.341 | 8.101 |
| 1.894999999999902 | 4.109 | 4.149 | 4.269 | 4.469 | 4.749 | 5.109 | 5.549 | 6.069 | 6.669 | 7.349 | 8.109 |
| 1.895999999999902 | 4.117 | 4.157 | 4.277 | 4.477 | 4.757 | 5.117 | 5.557 | 6.077 | 6.677 | 7.357 | 8.117 |
| 1.896999999999902 | 4.125 | 4.165 | 4.285 | 4.485 | 4.765 | 5.125 | 5.565 | 6.085 | 6.685 | 7.365 | 8.125 |
| 1.897999999999902 | 4.133 | 4.173 | 4.293 | 4.493 | 4.773 | 5.133 | 5.573 | 6.093 | 6.693 | 7.373 | 8.133 |
| 1.898999999999902 | 4.141 | 4.181 | 4.301 | 4.501 | 4.781 | 5.141 | 5.581 | 6.101 | 6.701 | 7.381 | 8.141 |
| 1.899999999999901 | 4.149 | 4.189 | 4.309 | 4.509 | 4.789 | 5.149 | 5.589 | 6.109 | 6.709 | 7.389 | 8.149 |
| 1.900999999999901 | 4.157 | 4.197 | 4.317 | 4.517 | 4.797 | 5.157 | 5.597 | 6.117 | 6.717 | 7.397 | 8.157 |
| 1.901999999999901 | 4.165 | 4.205 | 4.325 | 4.525 | 4.805 | 5.165 | 5.605 | 6.125 | 6.725 | 7.405 | 8.165 |
| 1.902999999999901 | 4.173 | 4.213 | 4.333 | 4.533 | 4.813 | 5.173 | 5.613 | 6.133 | 6.733 | 7.413 | 8.173 |
| 1.903999999999901 | 4.181 | 4.221 | 4.341 | 4.541 | 4.821 | 5.181 | 5.621 | 6.141 | 6.741 | 7.421 | 8.181 |
| 1.904999999999901 | 4.189 | 4.229 | 4.349 | 4.549 | 4.829 | 5.189 | 5.629 | 6.149 | 6.749 | 7.429 | 8.189 |
| 1.905999999999901 | 4.197 | 4.237 | 4.357 | 4.557 | 4.837 | 5.197 | 5.637 | 6.157 | 6.757 | 7.437 | 8.197 |
| 1.906999999999901 | 4.205 | 4.245 | 4.365 | 4.565 | 4.845 | 5.205 | 5.645 | 6.165 | 6.765 | 7.445 | 8.205 |
| 1.907999999999901 | 4.214 | 4.254 | 4.374 | 4.574 | 4.854 | 5.214 | 5.654 | 6.174 | 6.774 | 7.454 | 8.214 |
| 1.908999999999901 | 4.222 | 4.262 | 4.382 | 4.582 | 4.862 | 5.222 | 5.662 | 6.182 | 6.782 | 7.462 | 8.222 |
| 1.9099999999999 | 4.23 | 4.27 | 4.39 | 4.59 | 4.87 | 5.23 | 5.67 | 6.19 | 6.79 | 7.47 | 8.23 |
| 1.9109999999999 | 4.238 | 4.278 | 4.398 | 4.598 | 4.878 | 5.238 | 5.678 | 6.198 | 6.798 | 7.478 | 8.238 |
| 1.9119999999999 | 4.246 | 4.286 | 4.406 | 4.606 | 4.886 | 5.246 | 5.686 | 6.206 | 6.806 | 7.486 | 8.246 |
| 1.9129999999999 | 4.254 | 4.294 | 4.414 | 4.614 | 4.894 | 5.254 | 5.694 | 6.214 | 6.814 | 7.494 | 8.254 |
| 1.9139999999999 | 4.262 | 4.302 | 4.422 | 4.622 | 4.902 | 5.262 | 5.702 | 6.222 | 6.822 | 7.502 | 8.262 |
| 1.9149999999999 | 4.271 | 4.311 | 4.431 | 4.631 | 4.911 | 5.271 | 5.711 | 6.231 | 6.831 | 7.511 | 8.271 |
| 1.9159999999999 | 4.279 | 4.319 | 4.439 | 4.639 | 4.919 | 5.279 | 5.719 | 6.239 | 6.839 | 7.519 | 8.279 |
| 1.9169999999999 | 4.287 | 4.327 | 4.447 | 4.647 | 4.927 | 5.287 | 5.727 | 6.247 | 6.847 | 7.527 | 8.287 |
| 1.9179999999999 | 4.295 | 4.335 | 4.455 | 4.655 | 4.935 | 5.295 | 5.735 | 6.255 | 6.855 | 7.535 | 8.295 |
| 1.918999999999899 | 4.303 | 4.343 | 4.463 | 4.663 | 4.943 | 5.303 | 5.743 | 6.263 | 6.863 | 7.543 | 8.303 |
| 1.919999999999899 | 4.311 | 4.351 | 4.471 | 4.671 | 4.951 | 5.311 | 5.751 | 6.271 | 6.871 | 7.551 | 8.311 |
| 1.920999999999899 | 4.32 | 4.36 | 4.48 | 4.68 | 4.96 | 5.32 | 5.76 | 6.28 | 6.88 | 7.56 | 8.32 |
| 1.921999999999899 | 4.328 | 4.368 | 4.488 | 4.688 | 4.968 | 5.328 | 5.768 | 6.288 | 6.888 | 7.568 | 8.328 |
| 1.922999999999899 | 4.336 | 4.376 | 4.496 | 4.696 | 4.976 | 5.336 | 5.776 | 6.296 | 6.896 | 7.576 | 8.336 |
| 1.923999999999899 | 4.344 | 4.384 | 4.504 | 4.704 | 4.984 | 5.344 | 5.784 | 6.304 | 6.904 | 7.584 | 8.344 |
| 1.924999999999899 | 4.353 | 4.393 | 4.513 | 4.713 | 4.993 | 5.353 | 5.793 | 6.313 | 6.913 | 7.593 | 8.353 |
| 1.925999999999899 | 4.361 | 4.401 | 4.521 | 4.721 | 5.001 | 5.361 | 5.801 | 6.321 | 6.921 | 7.601 | 8.361 |
| 1.926999999999899 | 4.369 | 4.409 | 4.529 | 4.729 | 5.009 | 5.369 | 5.809 | 6.329 | 6.929 | 7.609 | 8.369 |
| 1.927999999999898 | 4.378 | 4.418 | 4.538 | 4.738 | 5.018 | 5.378 | 5.818 | 6.338 | 6.938 | 7.618 | 8.378 |
| 1.928999999999898 | 4.386 | 4.426 | 4.546 | 4.746 | 5.026 | 5.386 | 5.826 | 6.346 | 6.946 | 7.626 | 8.386 |
| 1.929999999999898 | 4.394 | 4.434 | 4.554 | 4.754 | 5.034 | 5.394 | 5.834 | 6.354 | 6.954 | 7.634 | 8.394 |
| 1.930999999999898 | 4.402 | 4.442 | 4.562 | 4.762 | 5.042 | 5.402 | 5.842 | 6.362 | 6.962 | 7.642 | 8.402 |
| 1.931999999999898 | 4.411 | 4.451 | 4.571 | 4.771 | 5.051 | 5.411 | 5.851 | 6.371 | 6.971 | 7.651 | 8.411 |
| 1.932999999999898 | 4.419 | 4.459 | 4.579 | 4.779 | 5.059 | 5.419 | 5.859 | 6.379 | 6.979 | 7.659 | 8.419 |
| 1.933999999999898 | 4.427 | 4.467 | 4.587 | 4.787 | 5.067 | 5.427 | 5.867 | 6.387 | 6.987 | 7.667 | 8.427 |
| 1.934999999999898 | 4.436 | 4.476 | 4.596 | 4.796 | 5.076 | 5.436 | 5.876 | 6.396 | 6.996 | 7.676 | 8.436 |
| 1.935999999999898 | 4.444 | 4.484 | 4.604 | 4.804 | 5.084 | 5.444 | 5.884 | 6.404 | 7.004 | 7.684 | 8.444 |
| 1.936999999999897 | 4.453 | 4.493 | 4.613 | 4.813 | 5.093 | 5.453 | 5.893 | 6.413 | 7.013 | 7.693 | 8.453 |
| 1.937999999999897 | 4.461 | 4.501 | 4.621 | 4.821 | 5.101 | 5.461 | 5.901 | 6.421 | 7.021 | 7.701 | 8.461 |
| 1.938999999999897 | 4.469 | 4.509 | 4.629 | 4.829 | 5.109 | 5.469 | 5.909 | 6.429 | 7.029 | 7.709 | 8.469 |
| 1.939999999999897 | 4.478 | 4.518 | 4.638 | 4.838 | 5.118 | 5.478 | 5.918 | 6.438 | 7.038 | 7.718 | 8.478 |
| 1.940999999999897 | 4.486 | 4.526 | 4.646 | 4.846 | 5.126 | 5.486 | 5.926 | 6.446 | 7.046 | 7.726 | 8.486 |
| 1.941999999999897 | 4.495 | 4.535 | 4.655 | 4.855 | 5.135 | 5.495 | 5.935 | 6.455 | 7.055 | 7.735 | 8.495 |
| 1.942999999999897 | 4.503 | 4.543 | 4.663 | 4.863 | 5.143 | 5.503 | 5.943 | 6.463 | 7.063 | 7.743 | 8.503 |
| 1.943999999999897 | 4.512 | 4.552 | 4.672 | 4.872 | 5.152 | 5.512 | 5.952 | 6.472 | 7.072 | 7.752 | 8.512 |
| 1.944999999999897 | 4.52 | 4.56 | 4.68 | 4.88 | 5.16 | 5.52 | 5.96 | 6.48 | 7.08 | 7.76 | 8.52 |
| 1.945999999999896 | 4.528 | 4.568 | 4.688 | 4.888 | 5.168 | 5.528 | 5.968 | 6.488 | 7.088 | 7.768 | 8.528 |
| 1.946999999999896 | 4.537 | 4.577 | 4.697 | 4.897 | 5.177 | 5.537 | 5.977 | 6.497 | 7.097 | 7.777 | 8.537 |
| 1.947999999999896 | 4.545 | 4.585 | 4.705 | 4.905 | 5.185 | 5.545 | 5.985 | 6.505 | 7.105 | 7.785 | 8.545 |
| 1.948999999999896 | 4.554 | 4.594 | 4.714 | 4.914 | 5.194 | 5.554 | 5.994 | 6.514 | 7.114 | 7.794 | 8.554 |
| 1.949999999999896 | 4.562 | 4.602 | 4.722 | 4.922 | 5.202 | 5.562 | 6.002 | 6.522 | 7.122 | 7.802 | 8.562 |
| 1.950999999999896 | 4.571 | 4.611 | 4.731 | 4.931 | 5.211 | 5.571 | 6.011 | 6.531 | 7.131 | 7.811 | 8.571 |
| 1.951999999999896 | 4.579 | 4.619 | 4.739 | 4.939 | 5.219 | 5.579 | 6.019 | 6.539 | 7.139 | 7.819 | 8.579 |
| 1.952999999999896 | 4.588 | 4.628 | 4.748 | 4.948 | 5.228 | 5.588 | 6.028 | 6.548 | 7.148 | 7.828 | 8.588 |
| 1.953999999999896 | 4.596 | 4.636 | 4.756 | 4.956 | 5.236 | 5.596 | 6.036 | 6.556 | 7.156 | 7.836 | 8.596 |
| 1.954999999999895 | 4.605 | 4.645 | 4.765 | 4.965 | 5.245 | 5.605 | 6.045 | 6.565 | 7.165 | 7.845 | 8.605 |
| 1.955999999999895 | 4.614 | 4.654 | 4.774 | 4.974 | 5.254 | 5.614 | 6.054 | 6.574 | 7.174 | 7.854 | 8.614 |
| 1.956999999999895 | 4.622 | 4.662 | 4.782 | 4.982 | 5.262 | 5.622 | 6.062 | 6.582 | 7.182 | 7.862 | 8.622 |
| 1.957999999999895 | 4.631 | 4.671 | 4.791 | 4.991 | 5.271 | 5.631 | 6.071 | 6.591 | 7.191 | 7.871 | 8.631 |
| 1.958999999999895 | 4.639 | 4.679 | 4.799 | 4.999 | 5.279 | 5.639 | 6.079 | 6.599 | 7.199 | 7.879 | 8.639 |
| 1.959999999999895 | 4.648 | 4.688 | 4.808 | 5.008 | 5.288 | 5.648 | 6.088 | 6.608 | 7.208 | 7.888 | 8.648 |
| 1.960999999999895 | 4.657 | 4.697 | 4.817 | 5.017 | 5.297 | 5.657 | 6.097 | 6.617 | 7.217 | 7.897 | 8.657 |
| 1.961999999999895 | 4.665 | 4.705 | 4.825 | 5.025 | 5.305 | 5.665 | 6.105 | 6.625 | 7.225 | 7.905 | 8.665 |
| 1.962999999999895 | 4.674 | 4.714 | 4.834 | 5.034 | 5.314 | 5.674 | 6.114 | 6.634 | 7.234 | 7.914 | 8.674 |
| 1.963999999999894 | 4.682 | 4.722 | 4.842 | 5.042 | 5.322 | 5.682 | 6.122 | 6.642 | 7.242 | 7.922 | 8.682 |
| 1.964999999999894 | 4.691 | 4.731 | 4.851 | 5.051 | 5.331 | 5.691 | 6.131 | 6.651 | 7.251 | 7.931 | 8.691 |
| 1.965999999999894 | 4.7 | 4.74 | 4.86 | 5.06 | 5.34 | 5.7 | 6.14 | 6.66 | 7.26 | 7.94 | 8.7 |
| 1.966999999999894 | 4.708 | 4.748 | 4.868 | 5.068 | 5.348 | 5.708 | 6.148 | 6.668 | 7.268 | 7.948 | 8.708 |
| 1.967999999999894 | 4.717 | 4.757 | 4.877 | 5.077 | 5.357 | 5.717 | 6.157 | 6.677 | 7.277 | 7.957 | 8.717 |
| 1.968999999999894 | 4.726 | 4.766 | 4.886 | 5.086 | 5.366 | 5.726 | 6.166 | 6.686 | 7.286 | 7.966 | 8.726 |
| 1.969999999999894 | 4.734 | 4.774 | 4.894 | 5.094 | 5.374 | 5.734 | 6.174 | 6.694 | 7.294 | 7.974 | 8.734 |
| 1.970999999999894 | 4.743 | 4.783 | 4.903 | 5.103 | 5.383 | 5.743 | 6.183 | 6.703 | 7.303 | 7.983 | 8.743 |
| 1.971999999999894 | 4.752 | 4.792 | 4.912 | 5.112 | 5.392 | 5.752 | 6.192 | 6.712 | 7.312 | 7.992 | 8.752 |
| 1.972999999999893 | 4.761 | 4.801 | 4.921 | 5.121 | 5.401 | 5.761 | 6.201 | 6.721 | 7.321 | 8.001 | 8.761 |
| 1.973999999999893 | 4.769 | 4.809 | 4.929 | 5.129 | 5.409 | 5.769 | 6.209 | 6.729 | 7.329 | 8.009 | 8.769 |
| 1.974999999999893 | 4.778 | 4.818 | 4.938 | 5.138 | 5.418 | 5.778 | 6.218 | 6.738 | 7.338 | 8.018 | 8.778 |
| 1.975999999999893 | 4.787 | 4.827 | 4.947 | 5.147 | 5.427 | 5.787 | 6.227 | 6.747 | 7.347 | 8.027 | 8.787 |
| 1.976999999999893 | 4.796 | 4.836 | 4.956 | 5.156 | 5.436 | 5.796 | 6.236 | 6.756 | 7.356 | 8.036 | 8.796 |
| 1.977999999999893 | 4.804 | 4.844 | 4.964 | 5.164 | 5.444 | 5.804 | 6.244 | 6.764 | 7.364 | 8.044 | 8.804 |
| 1.978999999999893 | 4.813 | 4.853 | 4.973 | 5.173 | 5.453 | 5.813 | 6.253 | 6.773 | 7.373 | 8.053 | 8.813 |
| 1.979999999999893 | 4.822 | 4.862 | 4.982 | 5.182 | 5.462 | 5.822 | 6.262 | 6.782 | 7.382 | 8.062 | 8.822 |
| 1.980999999999893 | 4.831 | 4.871 | 4.991 | 5.191 | 5.471 | 5.831 | 6.271 | 6.791 | 7.391 | 8.071 | 8.831 |
| 1.981999999999892 | 4.84 | 4.88 | 5 | 5.2 | 5.48 | 5.84 | 6.28 | 6.8 | 7.4 | 8.08 | 8.84 |
| 1.982999999999892 | 4.848 | 4.888 | 5.008 | 5.208 | 5.488 | 5.848 | 6.288 | 6.808 | 7.408 | 8.088 | 8.848 |
| 1.983999999999892 | 4.857 | 4.897 | 5.017 | 5.217 | 5.497 | 5.857 | 6.297 | 6.817 | 7.417 | 8.097 | 8.857 |
| 1.984999999999892 | 4.866 | 4.906 | 5.026 | 5.226 | 5.506 | 5.866 | 6.306 | 6.826 | 7.426 | 8.106 | 8.866 |
| 1.985999999999892 | 4.875 | 4.915 | 5.035 | 5.235 | 5.515 | 5.875 | 6.315 | 6.835 | 7.435 | 8.115 | 8.875 |
| 1.986999999999892 | 4.884 | 4.924 | 5.044 | 5.244 | 5.524 | 5.884 | 6.324 | 6.844 | 7.444 | 8.124 | 8.884 |
| 1.987999999999892 | 4.893 | 4.933 | 5.053 | 5.253 | 5.533 | 5.893 | 6.333 | 6.853 | 7.453 | 8.133 | 8.893 |
| 1.988999999999892 | 4.902 | 4.942 | 5.062 | 5.262 | 5.542 | 5.902 | 6.342 | 6.862 | 7.462 | 8.142 | 8.902 |
| 1.989999999999892 | 4.91 | 4.95 | 5.07 | 5.27 | 5.55 | 5.91 | 6.35 | 6.87 | 7.47 | 8.15 | 8.91 |
| 1.990999999999891 | 4.919 | 4.959 | 5.079 | 5.279 | 5.559 | 5.919 | 6.359 | 6.879 | 7.479 | 8.159 | 8.919 |
| 1.991999999999891 | 4.928 | 4.968 | 5.088 | 5.288 | 5.568 | 5.928 | 6.368 | 6.888 | 7.488 | 8.168 | 8.928 |
| 1.992999999999891 | 4.937 | 4.977 | 5.097 | 5.297 | 5.577 | 5.937 | 6.377 | 6.897 | 7.497 | 8.177 | 8.937 |
| 1.993999999999891 | 4.946 | 4.986 | 5.106 | 5.306 | 5.586 | 5.946 | 6.386 | 6.906 | 7.506 | 8.186 | 8.946 |
| 1.994999999999891 | 4.955 | 4.995 | 5.115 | 5.315 | 5.595 | 5.955 | 6.395 | 6.915 | 7.515 | 8.195 | 8.955 |
| 1.995999999999891 | 4.964 | 5.004 | 5.124 | 5.324 | 5.604 | 5.964 | 6.404 | 6.924 | 7.524 | 8.204 | 8.964 |
| 1.996999999999891 | 4.973 | 5.013 | 5.133 | 5.333 | 5.613 | 5.973 | 6.413 | 6.933 | 7.533 | 8.213 | 8.973 |
| 1.997999999999891 | 4.982 | 5.022 | 5.142 | 5.342 | 5.622 | 5.982 | 6.422 | 6.942 | 7.542 | 8.222 | 8.982 |
| 1.998999999999891 | 4.991 | 5.031 | 5.151 | 5.351 | 5.631 | 5.991 | 6.431 | 6.951 | 7.551 | 8.231 | 8.991 |
| 1.99999999999989 | 5 | 5.04 | 5.16 | 5.36 | 5.64 | 6 | 6.44 | 6.96 | 7.56 | 8.24 | 9 |